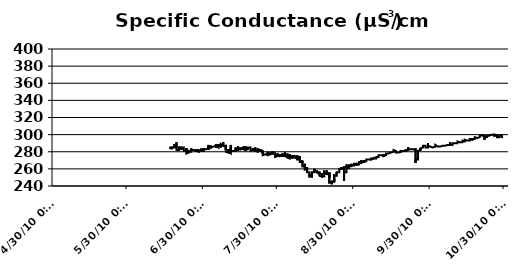
| Category | µS/cm |
|---|---|
| 6/16/10 | 285 |
| 6/16/10 | 285 |
| 6/16/10 | 285 |
| 6/16/10 | 285 |
| 6/16/10 | 286 |
| 6/16/10 | 285 |
| 6/16/10 | 286 |
| 6/16/10 | 286 |
| 6/16/10 | 284 |
| 6/16/10 | 285 |
| 6/16/10 | 285 |
| 6/16/10 | 284 |
| 6/16/10 | 284 |
| 6/16/10 | 284 |
| 6/16/10 | 284 |
| 6/16/10 | 284 |
| 6/16/10 | 285 |
| 6/16/10 | 284 |
| 6/16/10 | 284 |
| 6/16/10 | 284 |
| 6/16/10 | 284 |
| 6/16/10 | 284 |
| 6/16/10 | 284 |
| 6/16/10 | 284 |
| 6/17/10 | 284 |
| 6/17/10 | 284 |
| 6/17/10 | 284 |
| 6/17/10 | 284 |
| 6/17/10 | 284 |
| 6/17/10 | 284 |
| 6/17/10 | 284 |
| 6/17/10 | 284 |
| 6/17/10 | 284 |
| 6/17/10 | 284 |
| 6/17/10 | 284 |
| 6/17/10 | 285 |
| 6/17/10 | 285 |
| 6/17/10 | 285 |
| 6/17/10 | 285 |
| 6/17/10 | 285 |
| 6/17/10 | 285 |
| 6/17/10 | 285 |
| 6/17/10 | 285 |
| 6/17/10 | 285 |
| 6/17/10 | 285 |
| 6/17/10 | 285 |
| 6/17/10 | 285 |
| 6/17/10 | 285 |
| 6/17/10 | 285 |
| 6/17/10 | 286 |
| 6/17/10 | 285 |
| 6/17/10 | 286 |
| 6/17/10 | 286 |
| 6/17/10 | 286 |
| 6/17/10 | 286 |
| 6/17/10 | 286 |
| 6/17/10 | 286 |
| 6/17/10 | 286 |
| 6/17/10 | 285 |
| 6/17/10 | 286 |
| 6/17/10 | 286 |
| 6/17/10 | 287 |
| 6/17/10 | 287 |
| 6/17/10 | 286 |
| 6/17/10 | 285 |
| 6/17/10 | 284 |
| 6/17/10 | 284 |
| 6/17/10 | 284 |
| 6/17/10 | 284 |
| 6/17/10 | 285 |
| 6/17/10 | 285 |
| 6/17/10 | 285 |
| 6/18/10 | 285 |
| 6/18/10 | 285 |
| 6/18/10 | 285 |
| 6/18/10 | 285 |
| 6/18/10 | 286 |
| 6/18/10 | 286 |
| 6/18/10 | 286 |
| 6/18/10 | 286 |
| 6/18/10 | 286 |
| 6/18/10 | 286 |
| 6/18/10 | 287 |
| 6/18/10 | 287 |
| 6/18/10 | 287 |
| 6/18/10 | 287 |
| 6/18/10 | 287 |
| 6/18/10 | 287 |
| 6/18/10 | 287 |
| 6/18/10 | 287 |
| 6/18/10 | 287 |
| 6/18/10 | 287 |
| 6/18/10 | 288 |
| 6/18/10 | 287 |
| 6/18/10 | 288 |
| 6/18/10 | 288 |
| 6/18/10 | 288 |
| 6/18/10 | 288 |
| 6/18/10 | 289 |
| 6/18/10 | 289 |
| 6/18/10 | 289 |
| 6/18/10 | 289 |
| 6/18/10 | 289 |
| 6/18/10 | 287 |
| 6/18/10 | 287 |
| 6/18/10 | 289 |
| 6/18/10 | 290 |
| 6/18/10 | 290 |
| 6/18/10 | 290 |
| 6/18/10 | 289 |
| 6/18/10 | 290 |
| 6/18/10 | 290 |
| 6/18/10 | 289 |
| 6/18/10 | 287 |
| 6/18/10 | 287 |
| 6/18/10 | 287 |
| 6/18/10 | 288 |
| 6/18/10 | 287 |
| 6/18/10 | 287 |
| 6/18/10 | 287 |
| 6/19/10 | 287 |
| 6/19/10 | 287 |
| 6/19/10 | 287 |
| 6/19/10 | 287 |
| 6/19/10 | 287 |
| 6/19/10 | 287 |
| 6/19/10 | 287 |
| 6/19/10 | 288 |
| 6/19/10 | 287 |
| 6/19/10 | 288 |
| 6/19/10 | 288 |
| 6/19/10 | 288 |
| 6/19/10 | 288 |
| 6/19/10 | 288 |
| 6/19/10 | 288 |
| 6/19/10 | 287 |
| 6/19/10 | 287 |
| 6/19/10 | 287 |
| 6/19/10 | 288 |
| 6/19/10 | 288 |
| 6/19/10 | 287 |
| 6/19/10 | 288 |
| 6/19/10 | 287 |
| 6/19/10 | 287 |
| 6/19/10 | 286 |
| 6/19/10 | 287 |
| 6/19/10 | 287 |
| 6/19/10 | 287 |
| 6/19/10 | 287 |
| 6/19/10 | 287 |
| 6/19/10 | 288 |
| 6/19/10 | 288 |
| 6/19/10 | 288 |
| 6/19/10 | 288 |
| 6/19/10 | 289 |
| 6/19/10 | 288 |
| 6/19/10 | 289 |
| 6/19/10 | 291 |
| 6/19/10 | 288 |
| 6/19/10 | 284 |
| 6/19/10 | 286 |
| 6/19/10 | 284 |
| 6/19/10 | 283 |
| 6/19/10 | 283 |
| 6/19/10 | 283 |
| 6/19/10 | 283 |
| 6/19/10 | 282 |
| 6/19/10 | 281 |
| 6/20/10 | 282 |
| 6/20/10 | 282 |
| 6/20/10 | 282 |
| 6/20/10 | 282 |
| 6/20/10 | 282 |
| 6/20/10 | 282 |
| 6/20/10 | 282 |
| 6/20/10 | 283 |
| 6/20/10 | 283 |
| 6/20/10 | 283 |
| 6/20/10 | 283 |
| 6/20/10 | 284 |
| 6/20/10 | 284 |
| 6/20/10 | 284 |
| 6/20/10 | 284 |
| 6/20/10 | 284 |
| 6/20/10 | 284 |
| 6/20/10 | 285 |
| 6/20/10 | 285 |
| 6/20/10 | 285 |
| 6/20/10 | 285 |
| 6/20/10 | 284 |
| 6/20/10 | 285 |
| 6/20/10 | 285 |
| 6/20/10 | 284 |
| 6/20/10 | 284 |
| 6/20/10 | 285 |
| 6/20/10 | 285 |
| 6/20/10 | 285 |
| 6/20/10 | 286 |
| 6/20/10 | 286 |
| 6/20/10 | 286 |
| 6/20/10 | 286 |
| 6/20/10 | 286 |
| 6/20/10 | 285 |
| 6/20/10 | 286 |
| 6/20/10 | 286 |
| 6/20/10 | 286 |
| 6/20/10 | 284 |
| 6/20/10 | 285 |
| 6/20/10 | 284 |
| 6/20/10 | 285 |
| 6/20/10 | 285 |
| 6/20/10 | 284 |
| 6/20/10 | 284 |
| 6/20/10 | 284 |
| 6/20/10 | 283 |
| 6/20/10 | 284 |
| 6/21/10 | 284 |
| 6/21/10 | 284 |
| 6/21/10 | 284 |
| 6/21/10 | 284 |
| 6/21/10 | 284 |
| 6/21/10 | 284 |
| 6/21/10 | 284 |
| 6/21/10 | 284 |
| 6/21/10 | 284 |
| 6/21/10 | 284 |
| 6/21/10 | 284 |
| 6/21/10 | 284 |
| 6/21/10 | 284 |
| 6/21/10 | 284 |
| 6/21/10 | 284 |
| 6/21/10 | 282 |
| 6/21/10 | 284 |
| 6/21/10 | 284 |
| 6/21/10 | 285 |
| 6/21/10 | 285 |
| 6/21/10 | 284 |
| 6/21/10 | 284 |
| 6/21/10 | 285 |
| 6/21/10 | 285 |
| 6/21/10 | 285 |
| 6/21/10 | 285 |
| 6/21/10 | 285 |
| 6/21/10 | 285 |
| 6/21/10 | 285 |
| 6/21/10 | 285 |
| 6/21/10 | 285 |
| 6/21/10 | 286 |
| 6/21/10 | 286 |
| 6/21/10 | 286 |
| 6/21/10 | 286 |
| 6/21/10 | 286 |
| 6/21/10 | 286 |
| 6/21/10 | 287 |
| 6/21/10 | 286 |
| 6/21/10 | 286 |
| 6/21/10 | 285 |
| 6/21/10 | 284 |
| 6/21/10 | 284 |
| 6/21/10 | 284 |
| 6/21/10 | 284 |
| 6/21/10 | 284 |
| 6/21/10 | 284 |
| 6/21/10 | 284 |
| 6/22/10 | 285 |
| 6/22/10 | 285 |
| 6/22/10 | 285 |
| 6/22/10 | 285 |
| 6/22/10 | 284 |
| 6/22/10 | 284 |
| 6/22/10 | 284 |
| 6/22/10 | 284 |
| 6/22/10 | 284 |
| 6/22/10 | 284 |
| 6/22/10 | 284 |
| 6/22/10 | 284 |
| 6/22/10 | 284 |
| 6/22/10 | 284 |
| 6/22/10 | 284 |
| 6/22/10 | 284 |
| 6/22/10 | 284 |
| 6/22/10 | 283 |
| 6/22/10 | 283 |
| 6/22/10 | 283 |
| 6/22/10 | 283 |
| 6/22/10 | 283 |
| 6/22/10 | 283 |
| 6/22/10 | 283 |
| 6/22/10 | 283 |
| 6/22/10 | 283 |
| 6/22/10 | 283 |
| 6/22/10 | 283 |
| 6/22/10 | 283 |
| 6/22/10 | 283 |
| 6/22/10 | 284 |
| 6/22/10 | 284 |
| 6/22/10 | 283 |
| 6/22/10 | 283 |
| 6/22/10 | 284 |
| 6/22/10 | 283 |
| 6/22/10 | 284 |
| 6/22/10 | 282 |
| 6/22/10 | 282 |
| 6/22/10 | 281 |
| 6/22/10 | 282 |
| 6/22/10 | 282 |
| 6/22/10 | 282 |
| 6/22/10 | 282 |
| 6/22/10 | 282 |
| 6/22/10 | 282 |
| 6/22/10 | 282 |
| 6/22/10 | 282 |
| 6/23/10 | 282 |
| 6/23/10 | 282 |
| 6/23/10 | 282 |
| 6/23/10 | 282 |
| 6/23/10 | 282 |
| 6/23/10 | 282 |
| 6/23/10 | 282 |
| 6/23/10 | 282 |
| 6/23/10 | 282 |
| 6/23/10 | 282 |
| 6/23/10 | 282 |
| 6/23/10 | 282 |
| 6/23/10 | 282 |
| 6/23/10 | 283 |
| 6/23/10 | 283 |
| 6/23/10 | 283 |
| 6/23/10 | 283 |
| 6/23/10 | 283 |
| 6/23/10 | 284 |
| 6/23/10 | 283 |
| 6/23/10 | 283 |
| 6/23/10 | 283 |
| 6/23/10 | 283 |
| 6/23/10 | 283 |
| 6/23/10 | 283 |
| 6/23/10 | 283 |
| 6/23/10 | 283 |
| 6/23/10 | 283 |
| 6/23/10 | 281 |
| 6/23/10 | 280 |
| 6/23/10 | 282 |
| 6/23/10 | 282 |
| 6/23/10 | 282 |
| 6/23/10 | 284 |
| 6/23/10 | 284 |
| 6/23/10 | 284 |
| 6/23/10 | 285 |
| 6/23/10 | 280 |
| 6/23/10 | 280 |
| 6/23/10 | 280 |
| 6/23/10 | 279 |
| 6/23/10 | 278 |
| 6/23/10 | 278 |
| 6/23/10 | 279 |
| 6/23/10 | 279 |
| 6/23/10 | 279 |
| 6/23/10 | 279 |
| 6/23/10 | 279 |
| 6/24/10 | 279 |
| 6/24/10 | 279 |
| 6/24/10 | 279 |
| 6/24/10 | 279 |
| 6/24/10 | 279 |
| 6/24/10 | 279 |
| 6/24/10 | 279 |
| 6/24/10 | 279 |
| 6/24/10 | 279 |
| 6/24/10 | 279 |
| 6/24/10 | 279 |
| 6/24/10 | 279 |
| 6/24/10 | 280 |
| 6/24/10 | 280 |
| 6/24/10 | 280 |
| 6/24/10 | 280 |
| 6/24/10 | 280 |
| 6/24/10 | 281 |
| 6/24/10 | 281 |
| 6/24/10 | 280 |
| 6/24/10 | 280 |
| 6/24/10 | 279 |
| 6/24/10 | 280 |
| 6/24/10 | 280 |
| 6/24/10 | 280 |
| 6/24/10 | 280 |
| 6/24/10 | 280 |
| 6/24/10 | 280 |
| 6/24/10 | 281 |
| 6/24/10 | 281 |
| 6/24/10 | 280 |
| 6/24/10 | 280 |
| 6/24/10 | 280 |
| 6/24/10 | 281 |
| 6/24/10 | 281 |
| 6/24/10 | 281 |
| 6/24/10 | 282 |
| 6/24/10 | 281 |
| 6/24/10 | 281 |
| 6/24/10 | 281 |
| 6/24/10 | 281 |
| 6/24/10 | 280 |
| 6/24/10 | 280 |
| 6/24/10 | 280 |
| 6/24/10 | 280 |
| 6/24/10 | 280 |
| 6/24/10 | 280 |
| 6/24/10 | 280 |
| 6/25/10 | 280 |
| 6/25/10 | 280 |
| 6/25/10 | 280 |
| 6/25/10 | 281 |
| 6/25/10 | 281 |
| 6/25/10 | 281 |
| 6/25/10 | 281 |
| 6/25/10 | 281 |
| 6/25/10 | 281 |
| 6/25/10 | 281 |
| 6/25/10 | 281 |
| 6/25/10 | 282 |
| 6/25/10 | 282 |
| 6/25/10 | 282 |
| 6/25/10 | 282 |
| 6/25/10 | 282 |
| 6/25/10 | 282 |
| 6/25/10 | 282 |
| 6/25/10 | 282 |
| 6/25/10 | 283 |
| 6/25/10 | 283 |
| 6/25/10 | 282 |
| 6/25/10 | 283 |
| 6/25/10 | 284 |
| 6/25/10 | 283 |
| 6/25/10 | 284 |
| 6/25/10 | 283 |
| 6/25/10 | 284 |
| 6/25/10 | 284 |
| 6/25/10 | 283 |
| 6/25/10 | 283 |
| 6/25/10 | 284 |
| 6/25/10 | 284 |
| 6/25/10 | 284 |
| 6/25/10 | 283 |
| 6/25/10 | 282 |
| 6/25/10 | 283 |
| 6/25/10 | 283 |
| 6/25/10 | 282 |
| 6/25/10 | 283 |
| 6/25/10 | 283 |
| 6/25/10 | 283 |
| 6/25/10 | 283 |
| 6/25/10 | 282 |
| 6/25/10 | 281 |
| 6/25/10 | 281 |
| 6/25/10 | 281 |
| 6/25/10 | 282 |
| 6/26/10 | 282 |
| 6/26/10 | 281 |
| 6/26/10 | 281 |
| 6/26/10 | 281 |
| 6/26/10 | 281 |
| 6/26/10 | 281 |
| 6/26/10 | 281 |
| 6/26/10 | 281 |
| 6/26/10 | 281 |
| 6/26/10 | 281 |
| 6/26/10 | 281 |
| 6/26/10 | 281 |
| 6/26/10 | 281 |
| 6/26/10 | 281 |
| 6/26/10 | 281 |
| 6/26/10 | 281 |
| 6/26/10 | 281 |
| 6/26/10 | 281 |
| 6/26/10 | 282 |
| 6/26/10 | 282 |
| 6/26/10 | 281 |
| 6/26/10 | 281 |
| 6/26/10 | 281 |
| 6/26/10 | 282 |
| 6/26/10 | 283 |
| 6/26/10 | 282 |
| 6/26/10 | 282 |
| 6/26/10 | 281 |
| 6/26/10 | 282 |
| 6/26/10 | 281 |
| 6/26/10 | 282 |
| 6/26/10 | 282 |
| 6/26/10 | 283 |
| 6/26/10 | 283 |
| 6/26/10 | 283 |
| 6/26/10 | 282 |
| 6/26/10 | 282 |
| 6/26/10 | 281 |
| 6/26/10 | 281 |
| 6/26/10 | 282 |
| 6/26/10 | 282 |
| 6/26/10 | 282 |
| 6/26/10 | 282 |
| 6/26/10 | 282 |
| 6/26/10 | 281 |
| 6/26/10 | 281 |
| 6/26/10 | 281 |
| 6/26/10 | 281 |
| 6/27/10 | 281 |
| 6/27/10 | 281 |
| 6/27/10 | 281 |
| 6/27/10 | 281 |
| 6/27/10 | 281 |
| 6/27/10 | 281 |
| 6/27/10 | 281 |
| 6/27/10 | 281 |
| 6/27/10 | 281 |
| 6/27/10 | 281 |
| 6/27/10 | 281 |
| 6/27/10 | 281 |
| 6/27/10 | 281 |
| 6/27/10 | 281 |
| 6/27/10 | 281 |
| 6/27/10 | 281 |
| 6/27/10 | 281 |
| 6/27/10 | 282 |
| 6/27/10 | 281 |
| 6/27/10 | 281 |
| 6/27/10 | 281 |
| 6/27/10 | 281 |
| 6/27/10 | 282 |
| 6/27/10 | 282 |
| 6/27/10 | 281 |
| 6/27/10 | 281 |
| 6/27/10 | 281 |
| 6/27/10 | 280 |
| 6/27/10 | 281 |
| 6/27/10 | 281 |
| 6/27/10 | 283 |
| 6/27/10 | 282 |
| 6/27/10 | 281 |
| 6/27/10 | 281 |
| 6/27/10 | 282 |
| 6/27/10 | 282 |
| 6/27/10 | 282 |
| 6/27/10 | 283 |
| 6/27/10 | 281 |
| 6/27/10 | 280 |
| 6/27/10 | 280 |
| 6/27/10 | 280 |
| 6/27/10 | 280 |
| 6/27/10 | 281 |
| 6/27/10 | 281 |
| 6/27/10 | 281 |
| 6/27/10 | 280 |
| 6/27/10 | 280 |
| 6/28/10 | 280 |
| 6/28/10 | 280 |
| 6/28/10 | 281 |
| 6/28/10 | 280 |
| 6/28/10 | 280 |
| 6/28/10 | 281 |
| 6/28/10 | 280 |
| 6/28/10 | 281 |
| 6/28/10 | 281 |
| 6/28/10 | 281 |
| 6/28/10 | 281 |
| 6/28/10 | 281 |
| 6/28/10 | 281 |
| 6/28/10 | 281 |
| 6/28/10 | 281 |
| 6/28/10 | 281 |
| 6/28/10 | 281 |
| 6/28/10 | 281 |
| 6/28/10 | 281 |
| 6/28/10 | 281 |
| 6/28/10 | 281 |
| 6/28/10 | 281 |
| 6/28/10 | 282 |
| 6/28/10 | 282 |
| 6/28/10 | 282 |
| 6/28/10 | 282 |
| 6/28/10 | 282 |
| 6/28/10 | 282 |
| 6/28/10 | 282 |
| 6/28/10 | 282 |
| 6/28/10 | 282 |
| 6/28/10 | 282 |
| 6/28/10 | 282 |
| 6/28/10 | 282 |
| 6/28/10 | 281 |
| 6/28/10 | 281 |
| 6/28/10 | 281 |
| 6/28/10 | 282 |
| 6/28/10 | 281 |
| 6/28/10 | 281 |
| 6/28/10 | 281 |
| 6/28/10 | 281 |
| 6/28/10 | 281 |
| 6/28/10 | 281 |
| 6/28/10 | 281 |
| 6/28/10 | 281 |
| 6/28/10 | 281 |
| 6/28/10 | 281 |
| 6/29/10 | 281 |
| 6/29/10 | 281 |
| 6/29/10 | 282 |
| 6/29/10 | 282 |
| 6/29/10 | 281 |
| 6/29/10 | 282 |
| 6/29/10 | 282 |
| 6/29/10 | 282 |
| 6/29/10 | 282 |
| 6/29/10 | 283 |
| 6/29/10 | 282 |
| 6/29/10 | 283 |
| 6/29/10 | 281 |
| 6/29/10 | 283 |
| 6/29/10 | 283 |
| 6/29/10 | 283 |
| 6/29/10 | 283 |
| 6/29/10 | 283 |
| 6/29/10 | 283 |
| 6/29/10 | 283 |
| 6/29/10 | 282 |
| 6/29/10 | 282 |
| 6/29/10 | 282 |
| 6/29/10 | 282 |
| 6/29/10 | 282 |
| 6/29/10 | 283 |
| 6/29/10 | 283 |
| 6/29/10 | 283 |
| 6/29/10 | 283 |
| 6/29/10 | 281 |
| 6/29/10 | 283 |
| 6/29/10 | 283 |
| 6/29/10 | 284 |
| 6/29/10 | 284 |
| 6/29/10 | 284 |
| 6/29/10 | 283 |
| 6/29/10 | 283 |
| 6/29/10 | 283 |
| 6/29/10 | 282 |
| 6/29/10 | 282 |
| 6/29/10 | 282 |
| 6/29/10 | 282 |
| 6/29/10 | 282 |
| 6/29/10 | 282 |
| 6/29/10 | 282 |
| 6/29/10 | 282 |
| 6/29/10 | 283 |
| 6/29/10 | 283 |
| 6/30/10 | 283 |
| 6/30/10 | 283 |
| 6/30/10 | 283 |
| 6/30/10 | 283 |
| 6/30/10 | 283 |
| 6/30/10 | 283 |
| 6/30/10 | 283 |
| 6/30/10 | 283 |
| 6/30/10 | 282 |
| 6/30/10 | 282 |
| 6/30/10 | 282 |
| 6/30/10 | 283 |
| 6/30/10 | 283 |
| 6/30/10 | 280 |
| 6/30/10 | 282 |
| 6/30/10 | 283 |
| 6/30/10 | 283 |
| 6/30/10 | 282 |
| 6/30/10 | 283 |
| 6/30/10 | 283 |
| 6/30/10 | 283 |
| 6/30/10 | 283 |
| 6/30/10 | 283 |
| 6/30/10 | 282 |
| 6/30/10 | 282 |
| 6/30/10 | 283 |
| 6/30/10 | 282 |
| 6/30/10 | 283 |
| 6/30/10 | 283 |
| 6/30/10 | 283 |
| 6/30/10 | 283 |
| 6/30/10 | 284 |
| 6/30/10 | 283 |
| 6/30/10 | 281 |
| 6/30/10 | 283 |
| 6/30/10 | 283 |
| 6/30/10 | 283 |
| 6/30/10 | 282 |
| 6/30/10 | 283 |
| 6/30/10 | 283 |
| 6/30/10 | 283 |
| 6/30/10 | 283 |
| 6/30/10 | 283 |
| 6/30/10 | 283 |
| 6/30/10 | 282 |
| 6/30/10 | 283 |
| 6/30/10 | 283 |
| 6/30/10 | 283 |
| 7/1/10 | 283 |
| 7/1/10 | 283 |
| 7/1/10 | 283 |
| 7/1/10 | 283 |
| 7/1/10 | 283 |
| 7/1/10 | 283 |
| 7/1/10 | 283 |
| 7/1/10 | 283 |
| 7/1/10 | 283 |
| 7/1/10 | 283 |
| 7/1/10 | 283 |
| 7/1/10 | 283 |
| 7/1/10 | 283 |
| 7/1/10 | 283 |
| 7/1/10 | 283 |
| 7/1/10 | 283 |
| 7/1/10 | 283 |
| 7/1/10 | 283 |
| 7/1/10 | 283 |
| 7/1/10 | 284 |
| 7/1/10 | 284 |
| 7/1/10 | 284 |
| 7/1/10 | 283 |
| 7/1/10 | 283 |
| 7/1/10 | 283 |
| 7/1/10 | 284 |
| 7/1/10 | 282 |
| 7/1/10 | 282 |
| 7/1/10 | 284 |
| 7/1/10 | 284 |
| 7/1/10 | 284 |
| 7/1/10 | 284 |
| 7/1/10 | 284 |
| 7/1/10 | 284 |
| 7/1/10 | 284 |
| 7/1/10 | 284 |
| 7/1/10 | 284 |
| 7/1/10 | 284 |
| 7/1/10 | 284 |
| 7/1/10 | 284 |
| 7/1/10 | 284 |
| 7/1/10 | 284 |
| 7/1/10 | 284 |
| 7/1/10 | 284 |
| 7/1/10 | 284 |
| 7/1/10 | 284 |
| 7/1/10 | 284 |
| 7/1/10 | 284 |
| 7/2/10 | 284 |
| 7/2/10 | 284 |
| 7/2/10 | 284 |
| 7/2/10 | 284 |
| 7/2/10 | 284 |
| 7/2/10 | 284 |
| 7/2/10 | 284 |
| 7/2/10 | 284 |
| 7/2/10 | 284 |
| 7/2/10 | 284 |
| 7/2/10 | 284 |
| 7/2/10 | 284 |
| 7/2/10 | 284 |
| 7/2/10 | 284 |
| 7/2/10 | 284 |
| 7/2/10 | 284 |
| 7/2/10 | 284 |
| 7/2/10 | 284 |
| 7/2/10 | 284 |
| 7/2/10 | 282 |
| 7/2/10 | 282 |
| 7/2/10 | 283 |
| 7/2/10 | 283 |
| 7/2/10 | 285 |
| 7/2/10 | 285 |
| 7/2/10 | 285 |
| 7/2/10 | 286 |
| 7/2/10 | 286 |
| 7/2/10 | 283 |
| 7/2/10 | 286 |
| 7/2/10 | 284 |
| 7/2/10 | 286 |
| 7/2/10 | 287 |
| 7/2/10 | 287 |
| 7/2/10 | 288 |
| 7/2/10 | 287 |
| 7/2/10 | 287 |
| 7/2/10 | 287 |
| 7/2/10 | 284 |
| 7/2/10 | 284 |
| 7/2/10 | 284 |
| 7/2/10 | 284 |
| 7/2/10 | 284 |
| 7/2/10 | 285 |
| 7/2/10 | 284 |
| 7/2/10 | 284 |
| 7/2/10 | 285 |
| 7/2/10 | 285 |
| 7/3/10 | 285 |
| 7/3/10 | 285 |
| 7/3/10 | 285 |
| 7/3/10 | 285 |
| 7/3/10 | 285 |
| 7/3/10 | 285 |
| 7/3/10 | 285 |
| 7/3/10 | 284 |
| 7/3/10 | 284 |
| 7/3/10 | 284 |
| 7/3/10 | 284 |
| 7/3/10 | 284 |
| 7/3/10 | 284 |
| 7/3/10 | 284 |
| 7/3/10 | 284 |
| 7/3/10 | 284 |
| 7/3/10 | 284 |
| 7/3/10 | 284 |
| 7/3/10 | 285 |
| 7/3/10 | 284 |
| 7/3/10 | 284 |
| 7/3/10 | 285 |
| 7/3/10 | 285 |
| 7/3/10 | 285 |
| 7/3/10 | 285 |
| 7/3/10 | 285 |
| 7/3/10 | 285 |
| 7/3/10 | 286 |
| 7/3/10 | 286 |
| 7/3/10 | 286 |
| 7/3/10 | 286 |
| 7/3/10 | 287 |
| 7/3/10 | 286 |
| 7/3/10 | 287 |
| 7/3/10 | 285 |
| 7/3/10 | 287 |
| 7/3/10 | 285 |
| 7/3/10 | 284 |
| 7/3/10 | 285 |
| 7/3/10 | 286 |
| 7/3/10 | 285 |
| 7/3/10 | 286 |
| 7/3/10 | 286 |
| 7/3/10 | 286 |
| 7/3/10 | 286 |
| 7/3/10 | 285 |
| 7/3/10 | 286 |
| 7/3/10 | 286 |
| 7/4/10 | 286 |
| 7/4/10 | 285 |
| 7/4/10 | 285 |
| 7/4/10 | 285 |
| 7/4/10 | 285 |
| 7/4/10 | 285 |
| 7/4/10 | 285 |
| 7/4/10 | 285 |
| 7/4/10 | 285 |
| 7/4/10 | 285 |
| 7/4/10 | 285 |
| 7/4/10 | 285 |
| 7/4/10 | 285 |
| 7/4/10 | 285 |
| 7/4/10 | 285 |
| 7/4/10 | 285 |
| 7/4/10 | 285 |
| 7/4/10 | 285 |
| 7/4/10 | 285 |
| 7/4/10 | 285 |
| 7/4/10 | 285 |
| 7/4/10 | 285 |
| 7/4/10 | 285 |
| 7/4/10 | 286 |
| 7/4/10 | 286 |
| 7/4/10 | 286 |
| 7/4/10 | 286 |
| 7/4/10 | 285 |
| 7/4/10 | 285 |
| 7/4/10 | 285 |
| 7/4/10 | 285 |
| 7/4/10 | 286 |
| 7/4/10 | 286 |
| 7/4/10 | 287 |
| 7/4/10 | 287 |
| 7/4/10 | 287 |
| 7/4/10 | 286 |
| 7/4/10 | 286 |
| 7/4/10 | 286 |
| 7/4/10 | 286 |
| 7/4/10 | 286 |
| 7/4/10 | 287 |
| 7/4/10 | 287 |
| 7/4/10 | 286 |
| 7/4/10 | 286 |
| 7/4/10 | 286 |
| 7/4/10 | 286 |
| 7/4/10 | 287 |
| 7/5/10 | 287 |
| 7/5/10 | 286 |
| 7/5/10 | 286 |
| 7/5/10 | 286 |
| 7/5/10 | 286 |
| 7/5/10 | 285 |
| 7/5/10 | 285 |
| 7/5/10 | 285 |
| 7/5/10 | 285 |
| 7/5/10 | 285 |
| 7/5/10 | 285 |
| 7/5/10 | 285 |
| 7/5/10 | 285 |
| 7/5/10 | 285 |
| 7/5/10 | 285 |
| 7/5/10 | 285 |
| 7/5/10 | 285 |
| 7/5/10 | 286 |
| 7/5/10 | 285 |
| 7/5/10 | 285 |
| 7/5/10 | 286 |
| 7/5/10 | 286 |
| 7/5/10 | 286 |
| 7/5/10 | 286 |
| 7/5/10 | 286 |
| 7/5/10 | 287 |
| 7/5/10 | 287 |
| 7/5/10 | 286 |
| 7/5/10 | 287 |
| 7/5/10 | 287 |
| 7/5/10 | 288 |
| 7/5/10 | 288 |
| 7/5/10 | 288 |
| 7/5/10 | 288 |
| 7/5/10 | 288 |
| 7/5/10 | 288 |
| 7/5/10 | 288 |
| 7/5/10 | 288 |
| 7/5/10 | 288 |
| 7/5/10 | 288 |
| 7/5/10 | 288 |
| 7/5/10 | 289 |
| 7/5/10 | 288 |
| 7/5/10 | 288 |
| 7/5/10 | 287 |
| 7/5/10 | 287 |
| 7/5/10 | 286 |
| 7/5/10 | 286 |
| 7/6/10 | 285 |
| 7/6/10 | 287 |
| 7/6/10 | 286 |
| 7/6/10 | 287 |
| 7/6/10 | 287 |
| 7/6/10 | 287 |
| 7/6/10 | 287 |
| 7/6/10 | 287 |
| 7/6/10 | 286 |
| 7/6/10 | 286 |
| 7/6/10 | 286 |
| 7/6/10 | 286 |
| 7/6/10 | 286 |
| 7/6/10 | 286 |
| 7/6/10 | 286 |
| 7/6/10 | 286 |
| 7/6/10 | 286 |
| 7/6/10 | 286 |
| 7/6/10 | 287 |
| 7/6/10 | 286 |
| 7/6/10 | 286 |
| 7/6/10 | 286 |
| 7/6/10 | 286 |
| 7/6/10 | 287 |
| 7/6/10 | 287 |
| 7/6/10 | 287 |
| 7/6/10 | 287 |
| 7/6/10 | 287 |
| 7/6/10 | 288 |
| 7/6/10 | 288 |
| 7/6/10 | 288 |
| 7/6/10 | 288 |
| 7/6/10 | 289 |
| 7/6/10 | 288 |
| 7/6/10 | 289 |
| 7/6/10 | 289 |
| 7/6/10 | 289 |
| 7/6/10 | 289 |
| 7/6/10 | 288 |
| 7/6/10 | 288 |
| 7/6/10 | 288 |
| 7/6/10 | 288 |
| 7/6/10 | 287 |
| 7/6/10 | 287 |
| 7/6/10 | 288 |
| 7/6/10 | 288 |
| 7/6/10 | 288 |
| 7/6/10 | 287 |
| 7/7/10 | 287 |
| 7/7/10 | 287 |
| 7/7/10 | 287 |
| 7/7/10 | 287 |
| 7/7/10 | 286 |
| 7/7/10 | 288 |
| 7/7/10 | 287 |
| 7/7/10 | 287 |
| 7/7/10 | 286 |
| 7/7/10 | 286 |
| 7/7/10 | 286 |
| 7/7/10 | 286 |
| 7/7/10 | 286 |
| 7/7/10 | 286 |
| 7/7/10 | 286 |
| 7/7/10 | 286 |
| 7/7/10 | 286 |
| 7/7/10 | 286 |
| 7/7/10 | 285 |
| 7/7/10 | 286 |
| 7/7/10 | 287 |
| 7/7/10 | 286 |
| 7/7/10 | 287 |
| 7/7/10 | 287 |
| 7/7/10 | 288 |
| 7/7/10 | 287 |
| 7/7/10 | 287 |
| 7/7/10 | 288 |
| 7/7/10 | 287 |
| 7/7/10 | 288 |
| 7/7/10 | 287 |
| 7/7/10 | 288 |
| 7/7/10 | 288 |
| 7/7/10 | 289 |
| 7/7/10 | 288 |
| 7/7/10 | 288 |
| 7/7/10 | 288 |
| 7/7/10 | 289 |
| 7/7/10 | 288 |
| 7/7/10 | 289 |
| 7/7/10 | 288 |
| 7/7/10 | 288 |
| 7/7/10 | 288 |
| 7/7/10 | 288 |
| 7/7/10 | 288 |
| 7/7/10 | 288 |
| 7/7/10 | 288 |
| 7/7/10 | 288 |
| 7/8/10 | 287 |
| 7/8/10 | 286 |
| 7/8/10 | 286 |
| 7/8/10 | 286 |
| 7/8/10 | 286 |
| 7/8/10 | 286 |
| 7/8/10 | 286 |
| 7/8/10 | 286 |
| 7/8/10 | 286 |
| 7/8/10 | 286 |
| 7/8/10 | 286 |
| 7/8/10 | 286 |
| 7/8/10 | 286 |
| 7/8/10 | 286 |
| 7/8/10 | 287 |
| 7/8/10 | 286 |
| 7/8/10 | 286 |
| 7/8/10 | 286 |
| 7/8/10 | 287 |
| 7/8/10 | 286 |
| 7/8/10 | 287 |
| 7/8/10 | 287 |
| 7/8/10 | 288 |
| 7/8/10 | 287 |
| 7/8/10 | 287 |
| 7/8/10 | 288 |
| 7/8/10 | 288 |
| 7/8/10 | 288 |
| 7/8/10 | 288 |
| 7/8/10 | 288 |
| 7/8/10 | 289 |
| 7/8/10 | 289 |
| 7/8/10 | 289 |
| 7/8/10 | 290 |
| 7/8/10 | 290 |
| 7/8/10 | 290 |
| 7/8/10 | 290 |
| 7/8/10 | 290 |
| 7/8/10 | 290 |
| 7/8/10 | 290 |
| 7/8/10 | 291 |
| 7/8/10 | 290 |
| 7/8/10 | 290 |
| 7/8/10 | 290 |
| 7/8/10 | 289 |
| 7/8/10 | 287 |
| 7/8/10 | 287 |
| 7/8/10 | 287 |
| 7/9/10 | 287 |
| 7/9/10 | 287 |
| 7/9/10 | 287 |
| 7/9/10 | 287 |
| 7/9/10 | 287 |
| 7/9/10 | 287 |
| 7/9/10 | 287 |
| 7/9/10 | 286 |
| 7/9/10 | 286 |
| 7/9/10 | 286 |
| 7/9/10 | 286 |
| 7/9/10 | 286 |
| 7/9/10 | 286 |
| 7/9/10 | 286 |
| 7/9/10 | 282 |
| 7/9/10 | 286 |
| 7/9/10 | 286 |
| 7/9/10 | 286 |
| 7/9/10 | 287 |
| 7/9/10 | 287 |
| 7/9/10 | 287 |
| 7/9/10 | 288 |
| 7/9/10 | 288 |
| 7/9/10 | 288 |
| 7/9/10 | 288 |
| 7/9/10 | 288 |
| 7/9/10 | 288 |
| 7/9/10 | 288 |
| 7/9/10 | 288 |
| 7/9/10 | 286 |
| 7/9/10 | 286 |
| 7/9/10 | 286 |
| 7/9/10 | 283 |
| 7/9/10 | 280 |
| 7/9/10 | 281 |
| 7/9/10 | 281 |
| 7/9/10 | 280 |
| 7/9/10 | 279 |
| 7/9/10 | 280 |
| 7/9/10 | 280 |
| 7/9/10 | 279 |
| 7/9/10 | 279 |
| 7/9/10 | 279 |
| 7/9/10 | 279 |
| 7/9/10 | 279 |
| 7/9/10 | 279 |
| 7/9/10 | 279 |
| 7/9/10 | 279 |
| 7/10/10 | 279 |
| 7/10/10 | 279 |
| 7/10/10 | 279 |
| 7/10/10 | 279 |
| 7/10/10 | 279 |
| 7/10/10 | 280 |
| 7/10/10 | 280 |
| 7/10/10 | 280 |
| 7/10/10 | 280 |
| 7/10/10 | 280 |
| 7/10/10 | 280 |
| 7/10/10 | 279 |
| 7/10/10 | 281 |
| 7/10/10 | 281 |
| 7/10/10 | 281 |
| 7/10/10 | 281 |
| 7/10/10 | 281 |
| 7/10/10 | 281 |
| 7/10/10 | 281 |
| 7/10/10 | 281 |
| 7/10/10 | 281 |
| 7/10/10 | 282 |
| 7/10/10 | 282 |
| 7/10/10 | 282 |
| 7/10/10 | 282 |
| 7/10/10 | 282 |
| 7/10/10 | 282 |
| 7/10/10 | 282 |
| 7/10/10 | 282 |
| 7/10/10 | 282 |
| 7/10/10 | 279 |
| 7/10/10 | 283 |
| 7/10/10 | 280 |
| 7/10/10 | 282 |
| 7/10/10 | 280 |
| 7/10/10 | 280 |
| 7/10/10 | 281 |
| 7/10/10 | 280 |
| 7/10/10 | 280 |
| 7/10/10 | 279 |
| 7/10/10 | 280 |
| 7/10/10 | 280 |
| 7/10/10 | 279 |
| 7/10/10 | 279 |
| 7/10/10 | 279 |
| 7/10/10 | 279 |
| 7/10/10 | 279 |
| 7/10/10 | 279 |
| 7/11/10 | 278 |
| 7/11/10 | 279 |
| 7/11/10 | 279 |
| 7/11/10 | 279 |
| 7/11/10 | 279 |
| 7/11/10 | 280 |
| 7/11/10 | 280 |
| 7/11/10 | 280 |
| 7/11/10 | 280 |
| 7/11/10 | 280 |
| 7/11/10 | 280 |
| 7/11/10 | 280 |
| 7/11/10 | 280 |
| 7/11/10 | 288 |
| 7/11/10 | 280 |
| 7/11/10 | 280 |
| 7/11/10 | 280 |
| 7/11/10 | 280 |
| 7/11/10 | 281 |
| 7/11/10 | 281 |
| 7/11/10 | 281 |
| 7/11/10 | 282 |
| 7/11/10 | 281 |
| 7/11/10 | 282 |
| 7/11/10 | 282 |
| 7/11/10 | 282 |
| 7/11/10 | 282 |
| 7/11/10 | 283 |
| 7/11/10 | 283 |
| 7/11/10 | 283 |
| 7/11/10 | 283 |
| 7/11/10 | 284 |
| 7/11/10 | 284 |
| 7/11/10 | 284 |
| 7/11/10 | 284 |
| 7/11/10 | 285 |
| 7/11/10 | 284 |
| 7/11/10 | 283 |
| 7/11/10 | 284 |
| 7/11/10 | 279 |
| 7/11/10 | 280 |
| 7/11/10 | 281 |
| 7/11/10 | 281 |
| 7/11/10 | 281 |
| 7/11/10 | 282 |
| 7/11/10 | 281 |
| 7/11/10 | 281 |
| 7/11/10 | 281 |
| 7/12/10 | 281 |
| 7/12/10 | 281 |
| 7/12/10 | 281 |
| 7/12/10 | 281 |
| 7/12/10 | 280 |
| 7/12/10 | 281 |
| 7/12/10 | 280 |
| 7/12/10 | 281 |
| 7/12/10 | 280 |
| 7/12/10 | 280 |
| 7/12/10 | 280 |
| 7/12/10 | 280 |
| 7/12/10 | 280 |
| 7/12/10 | 280 |
| 7/12/10 | 280 |
| 7/12/10 | 281 |
| 7/12/10 | 281 |
| 7/12/10 | 281 |
| 7/12/10 | 281 |
| 7/12/10 | 281 |
| 7/12/10 | 281 |
| 7/12/10 | 282 |
| 7/12/10 | 281 |
| 7/12/10 | 282 |
| 7/12/10 | 282 |
| 7/12/10 | 282 |
| 7/12/10 | 282 |
| 7/12/10 | 281 |
| 7/12/10 | 281 |
| 7/12/10 | 281 |
| 7/12/10 | 281 |
| 7/12/10 | 281 |
| 7/12/10 | 281 |
| 7/12/10 | 281 |
| 7/12/10 | 282 |
| 7/12/10 | 282 |
| 7/12/10 | 281 |
| 7/12/10 | 282 |
| 7/12/10 | 281 |
| 7/12/10 | 281 |
| 7/12/10 | 282 |
| 7/12/10 | 282 |
| 7/12/10 | 282 |
| 7/12/10 | 282 |
| 7/12/10 | 282 |
| 7/12/10 | 282 |
| 7/12/10 | 281 |
| 7/12/10 | 281 |
| 7/13/10 | 281 |
| 7/13/10 | 281 |
| 7/13/10 | 281 |
| 7/13/10 | 281 |
| 7/13/10 | 281 |
| 7/13/10 | 281 |
| 7/13/10 | 281 |
| 7/13/10 | 281 |
| 7/13/10 | 281 |
| 7/13/10 | 281 |
| 7/13/10 | 281 |
| 7/13/10 | 281 |
| 7/13/10 | 282 |
| 7/13/10 | 282 |
| 7/13/10 | 282 |
| 7/13/10 | 282 |
| 7/13/10 | 282 |
| 7/13/10 | 282 |
| 7/13/10 | 282 |
| 7/13/10 | 283 |
| 7/13/10 | 283 |
| 7/13/10 | 282 |
| 7/13/10 | 283 |
| 7/13/10 | 281 |
| 7/13/10 | 282 |
| 7/13/10 | 283 |
| 7/13/10 | 282 |
| 7/13/10 | 284 |
| 7/13/10 | 284 |
| 7/13/10 | 284 |
| 7/13/10 | 284 |
| 7/13/10 | 284 |
| 7/13/10 | 284 |
| 7/13/10 | 285 |
| 7/13/10 | 285 |
| 7/13/10 | 285 |
| 7/13/10 | 285 |
| 7/13/10 | 285 |
| 7/13/10 | 284 |
| 7/13/10 | 284 |
| 7/13/10 | 284 |
| 7/13/10 | 284 |
| 7/13/10 | 284 |
| 7/13/10 | 283 |
| 7/13/10 | 283 |
| 7/13/10 | 283 |
| 7/13/10 | 282 |
| 7/13/10 | 282 |
| 7/14/10 | 282 |
| 7/14/10 | 282 |
| 7/14/10 | 282 |
| 7/14/10 | 282 |
| 7/14/10 | 283 |
| 7/14/10 | 283 |
| 7/14/10 | 283 |
| 7/14/10 | 283 |
| 7/14/10 | 283 |
| 7/14/10 | 283 |
| 7/14/10 | 283 |
| 7/14/10 | 283 |
| 7/14/10 | 283 |
| 7/14/10 | 283 |
| 7/14/10 | 283 |
| 7/14/10 | 284 |
| 7/14/10 | 283 |
| 7/14/10 | 283 |
| 7/14/10 | 283 |
| 7/14/10 | 283 |
| 7/14/10 | 284 |
| 7/14/10 | 284 |
| 7/14/10 | 284 |
| 7/14/10 | 284 |
| 7/14/10 | 285 |
| 7/14/10 | 285 |
| 7/14/10 | 283 |
| 7/14/10 | 284 |
| 7/14/10 | 285 |
| 7/14/10 | 286 |
| 7/14/10 | 286 |
| 7/14/10 | 284 |
| 7/14/10 | 284 |
| 7/14/10 | 284 |
| 7/14/10 | 284 |
| 7/14/10 | 282 |
| 7/14/10 | 283 |
| 7/14/10 | 284 |
| 7/14/10 | 285 |
| 7/14/10 | 286 |
| 7/14/10 | 285 |
| 7/14/10 | 284 |
| 7/14/10 | 283 |
| 7/14/10 | 283 |
| 7/14/10 | 283 |
| 7/14/10 | 283 |
| 7/14/10 | 283 |
| 7/14/10 | 284 |
| 7/15/10 | 283 |
| 7/15/10 | 284 |
| 7/15/10 | 284 |
| 7/15/10 | 283 |
| 7/15/10 | 283 |
| 7/15/10 | 283 |
| 7/15/10 | 283 |
| 7/15/10 | 283 |
| 7/15/10 | 283 |
| 7/15/10 | 283 |
| 7/15/10 | 283 |
| 7/15/10 | 283 |
| 7/15/10 | 283 |
| 7/15/10 | 283 |
| 7/15/10 | 283 |
| 7/15/10 | 283 |
| 7/15/10 | 283 |
| 7/15/10 | 283 |
| 7/15/10 | 284 |
| 7/15/10 | 284 |
| 7/15/10 | 284 |
| 7/15/10 | 284 |
| 7/15/10 | 284 |
| 7/15/10 | 284 |
| 7/15/10 | 284 |
| 7/15/10 | 285 |
| 7/15/10 | 285 |
| 7/15/10 | 285 |
| 7/15/10 | 285 |
| 7/15/10 | 285 |
| 7/15/10 | 285 |
| 7/15/10 | 285 |
| 7/15/10 | 286 |
| 7/15/10 | 285 |
| 7/15/10 | 286 |
| 7/15/10 | 284 |
| 7/15/10 | 284 |
| 7/15/10 | 283 |
| 7/15/10 | 284 |
| 7/15/10 | 284 |
| 7/15/10 | 284 |
| 7/15/10 | 284 |
| 7/15/10 | 284 |
| 7/15/10 | 284 |
| 7/15/10 | 284 |
| 7/15/10 | 284 |
| 7/15/10 | 284 |
| 7/15/10 | 284 |
| 7/16/10 | 285 |
| 7/16/10 | 285 |
| 7/16/10 | 285 |
| 7/16/10 | 284 |
| 7/16/10 | 284 |
| 7/16/10 | 284 |
| 7/16/10 | 283 |
| 7/16/10 | 283 |
| 7/16/10 | 283 |
| 7/16/10 | 283 |
| 7/16/10 | 283 |
| 7/16/10 | 283 |
| 7/16/10 | 283 |
| 7/16/10 | 283 |
| 7/16/10 | 283 |
| 7/16/10 | 283 |
| 7/16/10 | 283 |
| 7/16/10 | 283 |
| 7/16/10 | 284 |
| 7/16/10 | 283 |
| 7/16/10 | 283 |
| 7/16/10 | 284 |
| 7/16/10 | 283 |
| 7/16/10 | 283 |
| 7/16/10 | 283 |
| 7/16/10 | 283 |
| 7/16/10 | 283 |
| 7/16/10 | 283 |
| 7/16/10 | 283 |
| 7/16/10 | 283 |
| 7/16/10 | 283 |
| 7/16/10 | 283 |
| 7/16/10 | 283 |
| 7/16/10 | 284 |
| 7/16/10 | 284 |
| 7/16/10 | 282 |
| 7/16/10 | 283 |
| 7/16/10 | 284 |
| 7/16/10 | 283 |
| 7/16/10 | 283 |
| 7/16/10 | 283 |
| 7/16/10 | 284 |
| 7/16/10 | 285 |
| 7/16/10 | 284 |
| 7/16/10 | 283 |
| 7/16/10 | 282 |
| 7/16/10 | 282 |
| 7/16/10 | 282 |
| 7/17/10 | 282 |
| 7/17/10 | 282 |
| 7/17/10 | 282 |
| 7/17/10 | 282 |
| 7/17/10 | 283 |
| 7/17/10 | 283 |
| 7/17/10 | 283 |
| 7/17/10 | 283 |
| 7/17/10 | 283 |
| 7/17/10 | 283 |
| 7/17/10 | 283 |
| 7/17/10 | 283 |
| 7/17/10 | 284 |
| 7/17/10 | 284 |
| 7/17/10 | 284 |
| 7/17/10 | 284 |
| 7/17/10 | 284 |
| 7/17/10 | 283 |
| 7/17/10 | 284 |
| 7/17/10 | 284 |
| 7/17/10 | 284 |
| 7/17/10 | 284 |
| 7/17/10 | 285 |
| 7/17/10 | 285 |
| 7/17/10 | 285 |
| 7/17/10 | 286 |
| 7/17/10 | 284 |
| 7/17/10 | 284 |
| 7/17/10 | 286 |
| 7/17/10 | 286 |
| 7/17/10 | 284 |
| 7/17/10 | 285 |
| 7/17/10 | 285 |
| 7/17/10 | 285 |
| 7/17/10 | 285 |
| 7/17/10 | 283 |
| 7/17/10 | 284 |
| 7/17/10 | 284 |
| 7/17/10 | 283 |
| 7/17/10 | 284 |
| 7/17/10 | 284 |
| 7/17/10 | 284 |
| 7/17/10 | 284 |
| 7/17/10 | 284 |
| 7/17/10 | 283 |
| 7/17/10 | 282 |
| 7/17/10 | 282 |
| 7/17/10 | 283 |
| 7/18/10 | 283 |
| 7/18/10 | 284 |
| 7/18/10 | 283 |
| 7/18/10 | 283 |
| 7/18/10 | 283 |
| 7/18/10 | 283 |
| 7/18/10 | 283 |
| 7/18/10 | 283 |
| 7/18/10 | 283 |
| 7/18/10 | 283 |
| 7/18/10 | 283 |
| 7/18/10 | 283 |
| 7/18/10 | 283 |
| 7/18/10 | 283 |
| 7/18/10 | 283 |
| 7/18/10 | 283 |
| 7/18/10 | 283 |
| 7/18/10 | 284 |
| 7/18/10 | 284 |
| 7/18/10 | 284 |
| 7/18/10 | 284 |
| 7/18/10 | 284 |
| 7/18/10 | 284 |
| 7/18/10 | 284 |
| 7/18/10 | 284 |
| 7/18/10 | 284 |
| 7/18/10 | 284 |
| 7/18/10 | 285 |
| 7/18/10 | 285 |
| 7/18/10 | 285 |
| 7/18/10 | 285 |
| 7/18/10 | 285 |
| 7/18/10 | 286 |
| 7/18/10 | 286 |
| 7/18/10 | 286 |
| 7/18/10 | 286 |
| 7/18/10 | 286 |
| 7/18/10 | 285 |
| 7/18/10 | 284 |
| 7/18/10 | 285 |
| 7/18/10 | 285 |
| 7/18/10 | 285 |
| 7/18/10 | 285 |
| 7/18/10 | 284 |
| 7/18/10 | 284 |
| 7/18/10 | 283 |
| 7/18/10 | 284 |
| 7/18/10 | 285 |
| 7/19/10 | 285 |
| 7/19/10 | 285 |
| 7/19/10 | 286 |
| 7/19/10 | 285 |
| 7/19/10 | 283 |
| 7/19/10 | 283 |
| 7/19/10 | 283 |
| 7/19/10 | 283 |
| 7/19/10 | 283 |
| 7/19/10 | 283 |
| 7/19/10 | 283 |
| 7/19/10 | 283 |
| 7/19/10 | 283 |
| 7/19/10 | 283 |
| 7/19/10 | 283 |
| 7/19/10 | 283 |
| 7/19/10 | 283 |
| 7/19/10 | 283 |
| 7/19/10 | 283 |
| 7/19/10 | 283 |
| 7/19/10 | 283 |
| 7/19/10 | 283 |
| 7/19/10 | 283 |
| 7/19/10 | 283 |
| 7/19/10 | 282 |
| 7/19/10 | 283 |
| 7/19/10 | 283 |
| 7/19/10 | 283 |
| 7/19/10 | 283 |
| 7/19/10 | 283 |
| 7/19/10 | 283 |
| 7/19/10 | 284 |
| 7/19/10 | 284 |
| 7/19/10 | 284 |
| 7/19/10 | 284 |
| 7/19/10 | 284 |
| 7/19/10 | 284 |
| 7/19/10 | 282 |
| 7/19/10 | 283 |
| 7/19/10 | 281 |
| 7/19/10 | 282 |
| 7/19/10 | 282 |
| 7/19/10 | 282 |
| 7/19/10 | 282 |
| 7/19/10 | 282 |
| 7/19/10 | 282 |
| 7/19/10 | 282 |
| 7/19/10 | 282 |
| 7/20/10 | 282 |
| 7/20/10 | 282 |
| 7/20/10 | 283 |
| 7/20/10 | 283 |
| 7/20/10 | 283 |
| 7/20/10 | 283 |
| 7/20/10 | 283 |
| 7/20/10 | 283 |
| 7/20/10 | 283 |
| 7/20/10 | 284 |
| 7/20/10 | 284 |
| 7/20/10 | 284 |
| 7/20/10 | 284 |
| 7/20/10 | 284 |
| 7/20/10 | 284 |
| 7/20/10 | 283 |
| 7/20/10 | 283 |
| 7/20/10 | 283 |
| 7/20/10 | 283 |
| 7/20/10 | 283 |
| 7/20/10 | 283 |
| 7/20/10 | 284 |
| 7/20/10 | 284 |
| 7/20/10 | 284 |
| 7/20/10 | 284 |
| 7/20/10 | 284 |
| 7/20/10 | 285 |
| 7/20/10 | 284 |
| 7/20/10 | 282 |
| 7/20/10 | 282 |
| 7/20/10 | 282 |
| 7/20/10 | 282 |
| 7/20/10 | 282 |
| 7/20/10 | 281 |
| 7/20/10 | 282 |
| 7/20/10 | 283 |
| 7/20/10 | 283 |
| 7/20/10 | 283 |
| 7/20/10 | 284 |
| 7/20/10 | 285 |
| 7/20/10 | 284 |
| 7/20/10 | 283 |
| 7/20/10 | 284 |
| 7/20/10 | 282 |
| 7/20/10 | 281 |
| 7/20/10 | 281 |
| 7/20/10 | 281 |
| 7/20/10 | 281 |
| 7/21/10 | 281 |
| 7/21/10 | 282 |
| 7/21/10 | 281 |
| 7/21/10 | 281 |
| 7/21/10 | 282 |
| 7/21/10 | 282 |
| 7/21/10 | 281 |
| 7/21/10 | 282 |
| 7/21/10 | 282 |
| 7/21/10 | 282 |
| 7/21/10 | 282 |
| 7/21/10 | 282 |
| 7/21/10 | 282 |
| 7/21/10 | 282 |
| 7/21/10 | 282 |
| 7/21/10 | 282 |
| 7/21/10 | 282 |
| 7/21/10 | 283 |
| 7/21/10 | 283 |
| 7/21/10 | 283 |
| 7/21/10 | 283 |
| 7/21/10 | 283 |
| 7/21/10 | 283 |
| 7/21/10 | 283 |
| 7/21/10 | 284 |
| 7/21/10 | 284 |
| 7/21/10 | 284 |
| 7/21/10 | 284 |
| 7/21/10 | 285 |
| 7/21/10 | 284 |
| 7/21/10 | 284 |
| 7/21/10 | 284 |
| 7/21/10 | 284 |
| 7/21/10 | 283 |
| 7/21/10 | 284 |
| 7/21/10 | 282 |
| 7/21/10 | 283 |
| 7/21/10 | 282 |
| 7/21/10 | 282 |
| 7/21/10 | 282 |
| 7/21/10 | 282 |
| 7/21/10 | 283 |
| 7/21/10 | 282 |
| 7/21/10 | 282 |
| 7/21/10 | 281 |
| 7/21/10 | 281 |
| 7/21/10 | 280 |
| 7/21/10 | 280 |
| 7/22/10 | 280 |
| 7/22/10 | 280 |
| 7/22/10 | 280 |
| 7/22/10 | 280 |
| 7/22/10 | 280 |
| 7/22/10 | 280 |
| 7/22/10 | 280 |
| 7/22/10 | 280 |
| 7/22/10 | 281 |
| 7/22/10 | 281 |
| 7/22/10 | 281 |
| 7/22/10 | 281 |
| 7/22/10 | 281 |
| 7/22/10 | 282 |
| 7/22/10 | 282 |
| 7/22/10 | 282 |
| 7/22/10 | 282 |
| 7/22/10 | 282 |
| 7/22/10 | 283 |
| 7/22/10 | 282 |
| 7/22/10 | 282 |
| 7/22/10 | 282 |
| 7/22/10 | 282 |
| 7/22/10 | 284 |
| 7/22/10 | 283 |
| 7/22/10 | 282 |
| 7/22/10 | 281 |
| 7/22/10 | 281 |
| 7/22/10 | 281 |
| 7/22/10 | 282 |
| 7/22/10 | 283 |
| 7/22/10 | 282 |
| 7/22/10 | 283 |
| 7/22/10 | 283 |
| 7/22/10 | 282 |
| 7/22/10 | 281 |
| 7/22/10 | 282 |
| 7/22/10 | 282 |
| 7/22/10 | 282 |
| 7/22/10 | 281 |
| 7/22/10 | 281 |
| 7/22/10 | 281 |
| 7/22/10 | 281 |
| 7/22/10 | 281 |
| 7/22/10 | 281 |
| 7/22/10 | 281 |
| 7/22/10 | 281 |
| 7/22/10 | 282 |
| 7/23/10 | 282 |
| 7/23/10 | 281 |
| 7/23/10 | 281 |
| 7/23/10 | 280 |
| 7/23/10 | 281 |
| 7/23/10 | 281 |
| 7/23/10 | 281 |
| 7/23/10 | 281 |
| 7/23/10 | 281 |
| 7/23/10 | 281 |
| 7/23/10 | 281 |
| 7/23/10 | 281 |
| 7/23/10 | 282 |
| 7/23/10 | 281 |
| 7/23/10 | 281 |
| 7/23/10 | 281 |
| 7/23/10 | 282 |
| 7/23/10 | 282 |
| 7/23/10 | 282 |
| 7/23/10 | 282 |
| 7/23/10 | 282 |
| 7/23/10 | 282 |
| 7/23/10 | 282 |
| 7/23/10 | 282 |
| 7/23/10 | 281 |
| 7/23/10 | 282 |
| 7/23/10 | 282 |
| 7/23/10 | 282 |
| 7/23/10 | 282 |
| 7/23/10 | 283 |
| 7/23/10 | 282 |
| 7/23/10 | 282 |
| 7/23/10 | 283 |
| 7/23/10 | 283 |
| 7/23/10 | 282 |
| 7/23/10 | 282 |
| 7/23/10 | 283 |
| 7/23/10 | 282 |
| 7/23/10 | 282 |
| 7/23/10 | 282 |
| 7/23/10 | 281 |
| 7/23/10 | 281 |
| 7/23/10 | 281 |
| 7/23/10 | 282 |
| 7/23/10 | 282 |
| 7/23/10 | 282 |
| 7/23/10 | 281 |
| 7/23/10 | 281 |
| 7/24/10 | 281 |
| 7/24/10 | 281 |
| 7/24/10 | 281 |
| 7/24/10 | 281 |
| 7/24/10 | 278 |
| 7/24/10 | 277 |
| 7/24/10 | 278 |
| 7/24/10 | 279 |
| 7/24/10 | 278 |
| 7/24/10 | 278 |
| 7/24/10 | 278 |
| 7/24/10 | 278 |
| 7/24/10 | 278 |
| 7/24/10 | 278 |
| 7/24/10 | 278 |
| 7/24/10 | 278 |
| 7/24/10 | 278 |
| 7/24/10 | 278 |
| 7/24/10 | 279 |
| 7/24/10 | 279 |
| 7/24/10 | 280 |
| 7/24/10 | 280 |
| 7/24/10 | 279 |
| 7/24/10 | 279 |
| 7/24/10 | 278 |
| 7/24/10 | 278 |
| 7/24/10 | 278 |
| 7/24/10 | 279 |
| 7/24/10 | 280 |
| 7/24/10 | 279 |
| 7/24/10 | 280 |
| 7/24/10 | 280 |
| 7/24/10 | 280 |
| 7/24/10 | 280 |
| 7/24/10 | 280 |
| 7/24/10 | 279 |
| 7/24/10 | 279 |
| 7/24/10 | 278 |
| 7/24/10 | 278 |
| 7/24/10 | 278 |
| 7/24/10 | 279 |
| 7/24/10 | 279 |
| 7/24/10 | 278 |
| 7/24/10 | 278 |
| 7/24/10 | 276 |
| 7/24/10 | 276 |
| 7/24/10 | 276 |
| 7/24/10 | 277 |
| 7/25/10 | 277 |
| 7/25/10 | 276 |
| 7/25/10 | 276 |
| 7/25/10 | 276 |
| 7/25/10 | 276 |
| 7/25/10 | 276 |
| 7/25/10 | 276 |
| 7/25/10 | 276 |
| 7/25/10 | 277 |
| 7/25/10 | 277 |
| 7/25/10 | 277 |
| 7/25/10 | 277 |
| 7/25/10 | 277 |
| 7/25/10 | 277 |
| 7/25/10 | 277 |
| 7/25/10 | 277 |
| 7/25/10 | 277 |
| 7/25/10 | 277 |
| 7/25/10 | 277 |
| 7/25/10 | 277 |
| 7/25/10 | 278 |
| 7/25/10 | 278 |
| 7/25/10 | 277 |
| 7/25/10 | 277 |
| 7/25/10 | 277 |
| 7/25/10 | 277 |
| 7/25/10 | 277 |
| 7/25/10 | 277 |
| 7/25/10 | 277 |
| 7/25/10 | 277 |
| 7/25/10 | 278 |
| 7/25/10 | 278 |
| 7/25/10 | 277 |
| 7/25/10 | 277 |
| 7/25/10 | 277 |
| 7/25/10 | 277 |
| 7/25/10 | 276 |
| 7/25/10 | 276 |
| 7/25/10 | 276 |
| 7/25/10 | 276 |
| 7/25/10 | 276 |
| 7/25/10 | 276 |
| 7/25/10 | 276 |
| 7/25/10 | 276 |
| 7/25/10 | 276 |
| 7/25/10 | 276 |
| 7/25/10 | 277 |
| 7/25/10 | 276 |
| 7/26/10 | 276 |
| 7/26/10 | 276 |
| 7/26/10 | 276 |
| 7/26/10 | 276 |
| 7/26/10 | 276 |
| 7/26/10 | 276 |
| 7/26/10 | 277 |
| 7/26/10 | 277 |
| 7/26/10 | 277 |
| 7/26/10 | 277 |
| 7/26/10 | 277 |
| 7/26/10 | 277 |
| 7/26/10 | 278 |
| 7/26/10 | 278 |
| 7/26/10 | 278 |
| 7/26/10 | 278 |
| 7/26/10 | 278 |
| 7/26/10 | 278 |
| 7/26/10 | 278 |
| 7/26/10 | 277 |
| 7/26/10 | 278 |
| 7/26/10 | 278 |
| 7/26/10 | 278 |
| 7/26/10 | 279 |
| 7/26/10 | 279 |
| 7/26/10 | 279 |
| 7/26/10 | 279 |
| 7/26/10 | 280 |
| 7/26/10 | 280 |
| 7/26/10 | 280 |
| 7/26/10 | 280 |
| 7/26/10 | 279 |
| 7/26/10 | 280 |
| 7/26/10 | 279 |
| 7/26/10 | 277 |
| 7/26/10 | 278 |
| 7/26/10 | 279 |
| 7/26/10 | 278 |
| 7/26/10 | 277 |
| 7/26/10 | 277 |
| 7/26/10 | 277 |
| 7/26/10 | 276 |
| 7/26/10 | 276 |
| 7/26/10 | 276 |
| 7/26/10 | 278 |
| 7/26/10 | 277 |
| 7/26/10 | 278 |
| 7/26/10 | 278 |
| 7/27/10 | 277 |
| 7/27/10 | 277 |
| 7/27/10 | 277 |
| 7/27/10 | 277 |
| 7/27/10 | 277 |
| 7/27/10 | 277 |
| 7/27/10 | 278 |
| 7/27/10 | 277 |
| 7/27/10 | 277 |
| 7/27/10 | 277 |
| 7/27/10 | 278 |
| 7/27/10 | 278 |
| 7/27/10 | 278 |
| 7/27/10 | 278 |
| 7/27/10 | 278 |
| 7/27/10 | 278 |
| 7/27/10 | 278 |
| 7/27/10 | 278 |
| 7/27/10 | 278 |
| 7/27/10 | 278 |
| 7/27/10 | 278 |
| 7/27/10 | 279 |
| 7/27/10 | 279 |
| 7/27/10 | 279 |
| 7/27/10 | 280 |
| 7/27/10 | 280 |
| 7/27/10 | 280 |
| 7/27/10 | 280 |
| 7/27/10 | 280 |
| 7/27/10 | 280 |
| 7/27/10 | 280 |
| 7/27/10 | 280 |
| 7/27/10 | 280 |
| 7/27/10 | 280 |
| 7/27/10 | 277 |
| 7/27/10 | 278 |
| 7/27/10 | 278 |
| 7/27/10 | 278 |
| 7/27/10 | 278 |
| 7/27/10 | 278 |
| 7/27/10 | 277 |
| 7/27/10 | 277 |
| 7/27/10 | 277 |
| 7/27/10 | 277 |
| 7/27/10 | 276 |
| 7/27/10 | 277 |
| 7/27/10 | 277 |
| 7/27/10 | 277 |
| 7/28/10 | 278 |
| 7/28/10 | 278 |
| 7/28/10 | 278 |
| 7/28/10 | 277 |
| 7/28/10 | 277 |
| 7/28/10 | 277 |
| 7/28/10 | 277 |
| 7/28/10 | 277 |
| 7/28/10 | 277 |
| 7/28/10 | 277 |
| 7/28/10 | 277 |
| 7/28/10 | 277 |
| 7/28/10 | 278 |
| 7/28/10 | 279 |
| 7/28/10 | 278 |
| 7/28/10 | 278 |
| 7/28/10 | 278 |
| 7/28/10 | 279 |
| 7/28/10 | 279 |
| 7/28/10 | 279 |
| 7/28/10 | 279 |
| 7/28/10 | 279 |
| 7/28/10 | 279 |
| 7/28/10 | 279 |
| 7/28/10 | 280 |
| 7/28/10 | 280 |
| 7/28/10 | 280 |
| 7/28/10 | 279 |
| 7/28/10 | 279 |
| 7/28/10 | 278 |
| 7/28/10 | 278 |
| 7/28/10 | 280 |
| 7/28/10 | 280 |
| 7/28/10 | 280 |
| 7/28/10 | 279 |
| 7/28/10 | 279 |
| 7/28/10 | 279 |
| 7/28/10 | 278 |
| 7/28/10 | 278 |
| 7/28/10 | 277 |
| 7/28/10 | 278 |
| 7/28/10 | 280 |
| 7/28/10 | 280 |
| 7/28/10 | 279 |
| 7/28/10 | 278 |
| 7/28/10 | 277 |
| 7/28/10 | 277 |
| 7/28/10 | 277 |
| 7/29/10 | 277 |
| 7/29/10 | 279 |
| 7/29/10 | 278 |
| 7/29/10 | 278 |
| 7/29/10 | 276 |
| 7/29/10 | 276 |
| 7/29/10 | 276 |
| 7/29/10 | 277 |
| 7/29/10 | 276 |
| 7/29/10 | 276 |
| 7/29/10 | 277 |
| 7/29/10 | 276 |
| 7/29/10 | 276 |
| 7/29/10 | 276 |
| 7/29/10 | 275 |
| 7/29/10 | 275 |
| 7/29/10 | 275 |
| 7/29/10 | 275 |
| 7/29/10 | 276 |
| 7/29/10 | 276 |
| 7/29/10 | 276 |
| 7/29/10 | 276 |
| 7/29/10 | 276 |
| 7/29/10 | 276 |
| 7/29/10 | 277 |
| 7/29/10 | 277 |
| 7/29/10 | 276 |
| 7/29/10 | 275 |
| 7/29/10 | 274 |
| 7/29/10 | 274 |
| 7/29/10 | 275 |
| 7/29/10 | 276 |
| 7/29/10 | 277 |
| 7/29/10 | 275 |
| 7/29/10 | 274 |
| 7/29/10 | 275 |
| 7/29/10 | 275 |
| 7/29/10 | 274 |
| 7/29/10 | 274 |
| 7/29/10 | 275 |
| 7/29/10 | 275 |
| 7/29/10 | 274 |
| 7/29/10 | 274 |
| 7/29/10 | 274 |
| 7/29/10 | 274 |
| 7/29/10 | 274 |
| 7/29/10 | 274 |
| 7/29/10 | 275 |
| 7/30/10 | 275 |
| 7/30/10 | 274 |
| 7/30/10 | 275 |
| 7/30/10 | 275 |
| 7/30/10 | 275 |
| 7/30/10 | 275 |
| 7/30/10 | 275 |
| 7/30/10 | 276 |
| 7/30/10 | 276 |
| 7/30/10 | 276 |
| 7/30/10 | 276 |
| 7/30/10 | 276 |
| 7/30/10 | 277 |
| 7/30/10 | 276 |
| 7/30/10 | 276 |
| 7/30/10 | 276 |
| 7/30/10 | 276 |
| 7/30/10 | 276 |
| 7/30/10 | 276 |
| 7/30/10 | 276 |
| 7/30/10 | 276 |
| 7/30/10 | 277 |
| 7/30/10 | 278 |
| 7/30/10 | 278 |
| 7/30/10 | 277 |
| 7/30/10 | 278 |
| 7/30/10 | 278 |
| 7/30/10 | 276 |
| 7/30/10 | 277 |
| 7/30/10 | 277 |
| 7/30/10 | 278 |
| 7/30/10 | 276 |
| 7/30/10 | 275 |
| 7/30/10 | 278 |
| 7/30/10 | 275 |
| 7/30/10 | 276 |
| 7/30/10 | 275 |
| 7/30/10 | 275 |
| 7/30/10 | 275 |
| 7/30/10 | 275 |
| 7/30/10 | 275 |
| 7/30/10 | 276 |
| 7/30/10 | 274 |
| 7/30/10 | 275 |
| 7/30/10 | 274 |
| 7/30/10 | 274 |
| 7/30/10 | 274 |
| 7/30/10 | 274 |
| 7/31/10 | 275 |
| 7/31/10 | 275 |
| 7/31/10 | 275 |
| 7/31/10 | 275 |
| 7/31/10 | 274 |
| 7/31/10 | 275 |
| 7/31/10 | 275 |
| 7/31/10 | 275 |
| 7/31/10 | 276 |
| 7/31/10 | 276 |
| 7/31/10 | 276 |
| 7/31/10 | 276 |
| 7/31/10 | 276 |
| 7/31/10 | 276 |
| 7/31/10 | 276 |
| 7/31/10 | 276 |
| 7/31/10 | 276 |
| 7/31/10 | 276 |
| 7/31/10 | 276 |
| 7/31/10 | 276 |
| 7/31/10 | 277 |
| 7/31/10 | 278 |
| 7/31/10 | 278 |
| 7/31/10 | 278 |
| 7/31/10 | 278 |
| 7/31/10 | 278 |
| 7/31/10 | 278 |
| 7/31/10 | 276 |
| 7/31/10 | 277 |
| 7/31/10 | 277 |
| 7/31/10 | 278 |
| 7/31/10 | 278 |
| 7/31/10 | 277 |
| 7/31/10 | 277 |
| 7/31/10 | 277 |
| 7/31/10 | 275 |
| 7/31/10 | 276 |
| 7/31/10 | 275 |
| 7/31/10 | 275 |
| 7/31/10 | 275 |
| 7/31/10 | 275 |
| 7/31/10 | 275 |
| 7/31/10 | 276 |
| 7/31/10 | 276 |
| 7/31/10 | 275 |
| 7/31/10 | 275 |
| 7/31/10 | 276 |
| 7/31/10 | 276 |
| 8/1/10 | 276 |
| 8/1/10 | 276 |
| 8/1/10 | 275 |
| 8/1/10 | 275 |
| 8/1/10 | 275 |
| 8/1/10 | 275 |
| 8/1/10 | 275 |
| 8/1/10 | 274 |
| 8/1/10 | 274 |
| 8/1/10 | 274 |
| 8/1/10 | 274 |
| 8/1/10 | 275 |
| 8/1/10 | 275 |
| 8/1/10 | 276 |
| 8/1/10 | 276 |
| 8/1/10 | 276 |
| 8/1/10 | 276 |
| 8/1/10 | 276 |
| 8/1/10 | 276 |
| 8/1/10 | 276 |
| 8/1/10 | 276 |
| 8/1/10 | 277 |
| 8/1/10 | 277 |
| 8/1/10 | 278 |
| 8/1/10 | 277 |
| 8/1/10 | 276 |
| 8/1/10 | 276 |
| 8/1/10 | 276 |
| 8/1/10 | 276 |
| 8/1/10 | 275 |
| 8/1/10 | 276 |
| 8/1/10 | 276 |
| 8/1/10 | 275 |
| 8/1/10 | 275 |
| 8/1/10 | 275 |
| 8/1/10 | 275 |
| 8/1/10 | 275 |
| 8/1/10 | 275 |
| 8/1/10 | 275 |
| 8/1/10 | 276 |
| 8/1/10 | 276 |
| 8/1/10 | 275 |
| 8/1/10 | 274 |
| 8/1/10 | 275 |
| 8/1/10 | 275 |
| 8/1/10 | 276 |
| 8/1/10 | 275 |
| 8/1/10 | 275 |
| 8/2/10 | 275 |
| 8/2/10 | 275 |
| 8/2/10 | 275 |
| 8/2/10 | 275 |
| 8/2/10 | 275 |
| 8/2/10 | 275 |
| 8/2/10 | 275 |
| 8/2/10 | 275 |
| 8/2/10 | 275 |
| 8/2/10 | 275 |
| 8/2/10 | 275 |
| 8/2/10 | 275 |
| 8/2/10 | 275 |
| 8/2/10 | 275 |
| 8/2/10 | 276 |
| 8/2/10 | 276 |
| 8/2/10 | 276 |
| 8/2/10 | 276 |
| 8/2/10 | 276 |
| 8/2/10 | 276 |
| 8/2/10 | 276 |
| 8/2/10 | 277 |
| 8/2/10 | 277 |
| 8/2/10 | 277 |
| 8/2/10 | 278 |
| 8/2/10 | 278 |
| 8/2/10 | 277 |
| 8/2/10 | 277 |
| 8/2/10 | 278 |
| 8/2/10 | 279 |
| 8/2/10 | 277 |
| 8/2/10 | 279 |
| 8/2/10 | 276 |
| 8/2/10 | 279 |
| 8/2/10 | 276 |
| 8/2/10 | 278 |
| 8/2/10 | 277 |
| 8/2/10 | 277 |
| 8/2/10 | 277 |
| 8/2/10 | 275 |
| 8/2/10 | 276 |
| 8/2/10 | 275 |
| 8/2/10 | 275 |
| 8/2/10 | 275 |
| 8/2/10 | 275 |
| 8/2/10 | 275 |
| 8/2/10 | 274 |
| 8/2/10 | 275 |
| 8/3/10 | 276 |
| 8/3/10 | 276 |
| 8/3/10 | 275 |
| 8/3/10 | 275 |
| 8/3/10 | 275 |
| 8/3/10 | 275 |
| 8/3/10 | 276 |
| 8/3/10 | 276 |
| 8/3/10 | 277 |
| 8/3/10 | 278 |
| 8/3/10 | 275 |
| 8/3/10 | 274 |
| 8/3/10 | 273 |
| 8/3/10 | 274 |
| 8/3/10 | 274 |
| 8/3/10 | 274 |
| 8/3/10 | 274 |
| 8/3/10 | 275 |
| 8/3/10 | 275 |
| 8/3/10 | 275 |
| 8/3/10 | 275 |
| 8/3/10 | 275 |
| 8/3/10 | 275 |
| 8/3/10 | 276 |
| 8/3/10 | 276 |
| 8/3/10 | 276 |
| 8/3/10 | 276 |
| 8/3/10 | 276 |
| 8/3/10 | 276 |
| 8/3/10 | 275 |
| 8/3/10 | 275 |
| 8/3/10 | 276 |
| 8/3/10 | 275 |
| 8/3/10 | 275 |
| 8/3/10 | 276 |
| 8/3/10 | 275 |
| 8/3/10 | 275 |
| 8/3/10 | 274 |
| 8/3/10 | 276 |
| 8/3/10 | 276 |
| 8/3/10 | 274 |
| 8/3/10 | 273 |
| 8/3/10 | 273 |
| 8/3/10 | 272 |
| 8/3/10 | 272 |
| 8/3/10 | 272 |
| 8/3/10 | 272 |
| 8/3/10 | 272 |
| 8/4/10 | 272 |
| 8/4/10 | 272 |
| 8/4/10 | 273 |
| 8/4/10 | 274 |
| 8/4/10 | 273 |
| 8/4/10 | 273 |
| 8/4/10 | 274 |
| 8/4/10 | 274 |
| 8/4/10 | 275 |
| 8/4/10 | 275 |
| 8/4/10 | 275 |
| 8/4/10 | 275 |
| 8/4/10 | 275 |
| 8/4/10 | 276 |
| 8/4/10 | 275 |
| 8/4/10 | 273 |
| 8/4/10 | 273 |
| 8/4/10 | 274 |
| 8/4/10 | 275 |
| 8/4/10 | 276 |
| 8/4/10 | 276 |
| 8/4/10 | 277 |
| 8/4/10 | 277 |
| 8/4/10 | 277 |
| 8/4/10 | 277 |
| 8/4/10 | 275 |
| 8/4/10 | 275 |
| 8/4/10 | 276 |
| 8/4/10 | 276 |
| 8/4/10 | 277 |
| 8/4/10 | 278 |
| 8/4/10 | 278 |
| 8/4/10 | 276 |
| 8/4/10 | 276 |
| 8/4/10 | 274 |
| 8/4/10 | 276 |
| 8/4/10 | 274 |
| 8/4/10 | 274 |
| 8/4/10 | 274 |
| 8/4/10 | 274 |
| 8/4/10 | 274 |
| 8/4/10 | 274 |
| 8/4/10 | 275 |
| 8/4/10 | 275 |
| 8/4/10 | 274 |
| 8/4/10 | 275 |
| 8/4/10 | 275 |
| 8/4/10 | 274 |
| 8/5/10 | 275 |
| 8/5/10 | 275 |
| 8/5/10 | 275 |
| 8/5/10 | 274 |
| 8/5/10 | 274 |
| 8/5/10 | 273 |
| 8/5/10 | 273 |
| 8/5/10 | 273 |
| 8/5/10 | 273 |
| 8/5/10 | 273 |
| 8/5/10 | 273 |
| 8/5/10 | 273 |
| 8/5/10 | 273 |
| 8/5/10 | 273 |
| 8/5/10 | 272 |
| 8/5/10 | 272 |
| 8/5/10 | 272 |
| 8/5/10 | 273 |
| 8/5/10 | 273 |
| 8/5/10 | 276 |
| 8/5/10 | 272 |
| 8/5/10 | 272 |
| 8/5/10 | 275 |
| 8/5/10 | 273 |
| 8/5/10 | 275 |
| 8/5/10 | 275 |
| 8/5/10 | 275 |
| 8/5/10 | 275 |
| 8/5/10 | 275 |
| 8/5/10 | 276 |
| 8/5/10 | 276 |
| 8/5/10 | 274 |
| 8/5/10 | 274 |
| 8/5/10 | 274 |
| 8/5/10 | 274 |
| 8/5/10 | 274 |
| 8/5/10 | 275 |
| 8/5/10 | 274 |
| 8/5/10 | 275 |
| 8/5/10 | 276 |
| 8/5/10 | 276 |
| 8/5/10 | 276 |
| 8/5/10 | 275 |
| 8/5/10 | 274 |
| 8/5/10 | 274 |
| 8/5/10 | 274 |
| 8/5/10 | 275 |
| 8/5/10 | 275 |
| 8/6/10 | 275 |
| 8/6/10 | 275 |
| 8/6/10 | 273 |
| 8/6/10 | 273 |
| 8/6/10 | 272 |
| 8/6/10 | 273 |
| 8/6/10 | 273 |
| 8/6/10 | 273 |
| 8/6/10 | 273 |
| 8/6/10 | 274 |
| 8/6/10 | 274 |
| 8/6/10 | 274 |
| 8/6/10 | 274 |
| 8/6/10 | 274 |
| 8/6/10 | 275 |
| 8/6/10 | 275 |
| 8/6/10 | 275 |
| 8/6/10 | 275 |
| 8/6/10 | 274 |
| 8/6/10 | 275 |
| 8/6/10 | 275 |
| 8/6/10 | 275 |
| 8/6/10 | 275 |
| 8/6/10 | 274 |
| 8/6/10 | 275 |
| 8/6/10 | 276 |
| 8/6/10 | 274 |
| 8/6/10 | 276 |
| 8/6/10 | 275 |
| 8/6/10 | 273 |
| 8/6/10 | 275 |
| 8/6/10 | 274 |
| 8/6/10 | 274 |
| 8/6/10 | 276 |
| 8/6/10 | 276 |
| 8/6/10 | 274 |
| 8/6/10 | 273 |
| 8/6/10 | 273 |
| 8/6/10 | 272 |
| 8/6/10 | 272 |
| 8/6/10 | 272 |
| 8/6/10 | 273 |
| 8/6/10 | 272 |
| 8/6/10 | 272 |
| 8/6/10 | 272 |
| 8/6/10 | 272 |
| 8/6/10 | 272 |
| 8/6/10 | 272 |
| 8/7/10 | 272 |
| 8/7/10 | 272 |
| 8/7/10 | 273 |
| 8/7/10 | 273 |
| 8/7/10 | 273 |
| 8/7/10 | 273 |
| 8/7/10 | 273 |
| 8/7/10 | 274 |
| 8/7/10 | 273 |
| 8/7/10 | 274 |
| 8/7/10 | 274 |
| 8/7/10 | 274 |
| 8/7/10 | 274 |
| 8/7/10 | 273 |
| 8/7/10 | 274 |
| 8/7/10 | 274 |
| 8/7/10 | 274 |
| 8/7/10 | 274 |
| 8/7/10 | 274 |
| 8/7/10 | 274 |
| 8/7/10 | 274 |
| 8/7/10 | 272 |
| 8/7/10 | 274 |
| 8/7/10 | 276 |
| 8/7/10 | 275 |
| 8/7/10 | 273 |
| 8/7/10 | 275 |
| 8/7/10 | 273 |
| 8/7/10 | 275 |
| 8/7/10 | 273 |
| 8/7/10 | 274 |
| 8/7/10 | 275 |
| 8/7/10 | 276 |
| 8/7/10 | 275 |
| 8/7/10 | 275 |
| 8/7/10 | 274 |
| 8/7/10 | 273 |
| 8/7/10 | 272 |
| 8/7/10 | 272 |
| 8/7/10 | 271 |
| 8/7/10 | 272 |
| 8/7/10 | 273 |
| 8/7/10 | 273 |
| 8/7/10 | 272 |
| 8/7/10 | 271 |
| 8/7/10 | 271 |
| 8/7/10 | 270 |
| 8/7/10 | 271 |
| 8/8/10 | 271 |
| 8/8/10 | 271 |
| 8/8/10 | 272 |
| 8/8/10 | 272 |
| 8/8/10 | 271 |
| 8/8/10 | 270 |
| 8/8/10 | 270 |
| 8/8/10 | 270 |
| 8/8/10 | 270 |
| 8/8/10 | 270 |
| 8/8/10 | 270 |
| 8/8/10 | 271 |
| 8/8/10 | 272 |
| 8/8/10 | 272 |
| 8/8/10 | 272 |
| 8/8/10 | 271 |
| 8/8/10 | 272 |
| 8/8/10 | 272 |
| 8/8/10 | 272 |
| 8/8/10 | 272 |
| 8/8/10 | 273 |
| 8/8/10 | 273 |
| 8/8/10 | 273 |
| 8/8/10 | 274 |
| 8/8/10 | 272 |
| 8/8/10 | 274 |
| 8/8/10 | 274 |
| 8/8/10 | 272 |
| 8/8/10 | 274 |
| 8/8/10 | 275 |
| 8/8/10 | 275 |
| 8/8/10 | 275 |
| 8/8/10 | 275 |
| 8/8/10 | 272 |
| 8/8/10 | 273 |
| 8/8/10 | 271 |
| 8/8/10 | 271 |
| 8/8/10 | 270 |
| 8/8/10 | 269 |
| 8/8/10 | 270 |
| 8/8/10 | 271 |
| 8/8/10 | 270 |
| 8/8/10 | 270 |
| 8/8/10 | 269 |
| 8/8/10 | 269 |
| 8/8/10 | 268 |
| 8/8/10 | 268 |
| 8/8/10 | 268 |
| 8/9/10 | 268 |
| 8/9/10 | 268 |
| 8/9/10 | 268 |
| 8/9/10 | 268 |
| 8/9/10 | 268 |
| 8/9/10 | 268 |
| 8/9/10 | 267 |
| 8/9/10 | 267 |
| 8/9/10 | 267 |
| 8/9/10 | 266 |
| 8/9/10 | 266 |
| 8/9/10 | 267 |
| 8/9/10 | 266 |
| 8/9/10 | 267 |
| 8/9/10 | 267 |
| 8/9/10 | 267 |
| 8/9/10 | 268 |
| 8/9/10 | 267 |
| 8/9/10 | 268 |
| 8/9/10 | 269 |
| 8/9/10 | 269 |
| 8/9/10 | 268 |
| 8/9/10 | 270 |
| 8/9/10 | 271 |
| 8/9/10 | 271 |
| 8/9/10 | 270 |
| 8/9/10 | 270 |
| 8/9/10 | 271 |
| 8/9/10 | 271 |
| 8/9/10 | 271 |
| 8/9/10 | 271 |
| 8/9/10 | 270 |
| 8/9/10 | 271 |
| 8/9/10 | 270 |
| 8/9/10 | 269 |
| 8/9/10 | 267 |
| 8/9/10 | 269 |
| 8/9/10 | 267 |
| 8/9/10 | 267 |
| 8/9/10 | 269 |
| 8/9/10 | 267 |
| 8/9/10 | 266 |
| 8/9/10 | 265 |
| 8/9/10 | 264 |
| 8/9/10 | 264 |
| 8/9/10 | 263 |
| 8/9/10 | 264 |
| 8/9/10 | 264 |
| 8/10/10 | 264 |
| 8/10/10 | 264 |
| 8/10/10 | 264 |
| 8/10/10 | 264 |
| 8/10/10 | 264 |
| 8/10/10 | 262 |
| 8/10/10 | 261 |
| 8/10/10 | 261 |
| 8/10/10 | 261 |
| 8/10/10 | 261 |
| 8/10/10 | 262 |
| 8/10/10 | 262 |
| 8/10/10 | 262 |
| 8/10/10 | 262 |
| 8/10/10 | 262 |
| 8/10/10 | 262 |
| 8/10/10 | 263 |
| 8/10/10 | 262 |
| 8/10/10 | 263 |
| 8/10/10 | 263 |
| 8/10/10 | 263 |
| 8/10/10 | 264 |
| 8/10/10 | 264 |
| 8/10/10 | 264 |
| 8/10/10 | 264 |
| 8/10/10 | 264 |
| 8/10/10 | 264 |
| 8/10/10 | 265 |
| 8/10/10 | 265 |
| 8/10/10 | 265 |
| 8/10/10 | 264 |
| 8/10/10 | 263 |
| 8/10/10 | 265 |
| 8/10/10 | 262 |
| 8/10/10 | 262 |
| 8/10/10 | 264 |
| 8/10/10 | 266 |
| 8/10/10 | 267 |
| 8/10/10 | 262 |
| 8/10/10 | 263 |
| 8/10/10 | 264 |
| 8/10/10 | 264 |
| 8/10/10 | 263 |
| 8/10/10 | 263 |
| 8/10/10 | 261 |
| 8/10/10 | 260 |
| 8/10/10 | 259 |
| 8/10/10 | 260 |
| 8/11/10 | 260 |
| 8/11/10 | 259 |
| 8/11/10 | 259 |
| 8/11/10 | 259 |
| 8/11/10 | 259 |
| 8/11/10 | 259 |
| 8/11/10 | 259 |
| 8/11/10 | 259 |
| 8/11/10 | 259 |
| 8/11/10 | 259 |
| 8/11/10 | 259 |
| 8/11/10 | 259 |
| 8/11/10 | 259 |
| 8/11/10 | 257 |
| 8/11/10 | 257 |
| 8/11/10 | 257 |
| 8/11/10 | 257 |
| 8/11/10 | 257 |
| 8/11/10 | 258 |
| 8/11/10 | 258 |
| 8/11/10 | 258 |
| 8/11/10 | 260 |
| 8/11/10 | 261 |
| 8/11/10 | 261 |
| 8/11/10 | 261 |
| 8/11/10 | 262 |
| 8/11/10 | 262 |
| 8/11/10 | 262 |
| 8/11/10 | 262 |
| 8/11/10 | 262 |
| 8/11/10 | 262 |
| 8/11/10 | 263 |
| 8/11/10 | 263 |
| 8/11/10 | 261 |
| 8/11/10 | 263 |
| 8/11/10 | 260 |
| 8/11/10 | 260 |
| 8/11/10 | 259 |
| 8/11/10 | 259 |
| 8/11/10 | 259 |
| 8/11/10 | 259 |
| 8/11/10 | 258 |
| 8/11/10 | 259 |
| 8/11/10 | 258 |
| 8/11/10 | 257 |
| 8/11/10 | 257 |
| 8/11/10 | 256 |
| 8/11/10 | 256 |
| 8/12/10 | 256 |
| 8/12/10 | 255 |
| 8/12/10 | 256 |
| 8/12/10 | 255 |
| 8/12/10 | 255 |
| 8/12/10 | 256 |
| 8/12/10 | 255 |
| 8/12/10 | 252 |
| 8/12/10 | 252 |
| 8/12/10 | 251 |
| 8/12/10 | 253 |
| 8/12/10 | 253 |
| 8/12/10 | 252 |
| 8/12/10 | 254 |
| 8/12/10 | 253 |
| 8/12/10 | 253 |
| 8/12/10 | 253 |
| 8/12/10 | 252 |
| 8/12/10 | 253 |
| 8/12/10 | 253 |
| 8/12/10 | 254 |
| 8/12/10 | 254 |
| 8/12/10 | 254 |
| 8/12/10 | 254 |
| 8/12/10 | 254 |
| 8/12/10 | 254 |
| 8/12/10 | 254 |
| 8/12/10 | 254 |
| 8/12/10 | 253 |
| 8/12/10 | 254 |
| 8/12/10 | 254 |
| 8/12/10 | 254 |
| 8/12/10 | 252 |
| 8/12/10 | 251 |
| 8/12/10 | 250 |
| 8/12/10 | 251 |
| 8/12/10 | 251 |
| 8/12/10 | 252 |
| 8/12/10 | 252 |
| 8/12/10 | 252 |
| 8/12/10 | 251 |
| 8/12/10 | 252 |
| 8/12/10 | 252 |
| 8/12/10 | 253 |
| 8/12/10 | 252 |
| 8/12/10 | 252 |
| 8/12/10 | 252 |
| 8/12/10 | 252 |
| 8/13/10 | 252 |
| 8/13/10 | 250 |
| 8/13/10 | 251 |
| 8/13/10 | 251 |
| 8/13/10 | 251 |
| 8/13/10 | 251 |
| 8/13/10 | 251 |
| 8/13/10 | 251 |
| 8/13/10 | 252 |
| 8/13/10 | 252 |
| 8/13/10 | 252 |
| 8/13/10 | 253 |
| 8/13/10 | 253 |
| 8/13/10 | 253 |
| 8/13/10 | 253 |
| 8/13/10 | 254 |
| 8/13/10 | 254 |
| 8/13/10 | 254 |
| 8/13/10 | 255 |
| 8/13/10 | 255 |
| 8/13/10 | 255 |
| 8/13/10 | 255 |
| 8/13/10 | 255 |
| 8/13/10 | 255 |
| 8/13/10 | 254 |
| 8/13/10 | 254 |
| 8/13/10 | 254 |
| 8/13/10 | 254 |
| 8/13/10 | 254 |
| 8/13/10 | 254 |
| 8/13/10 | 254 |
| 8/13/10 | 254 |
| 8/13/10 | 254 |
| 8/13/10 | 254 |
| 8/13/10 | 254 |
| 8/13/10 | 254 |
| 8/13/10 | 254 |
| 8/13/10 | 254 |
| 8/13/10 | 254 |
| 8/13/10 | 254 |
| 8/13/10 | 254 |
| 8/13/10 | 254 |
| 8/13/10 | 254 |
| 8/13/10 | 254 |
| 8/13/10 | 255 |
| 8/13/10 | 256 |
| 8/13/10 | 256 |
| 8/13/10 | 256 |
| 8/14/10 | 256 |
| 8/14/10 | 256 |
| 8/14/10 | 256 |
| 8/14/10 | 256 |
| 8/14/10 | 257 |
| 8/14/10 | 257 |
| 8/14/10 | 257 |
| 8/14/10 | 257 |
| 8/14/10 | 258 |
| 8/14/10 | 258 |
| 8/14/10 | 258 |
| 8/14/10 | 258 |
| 8/14/10 | 258 |
| 8/14/10 | 259 |
| 8/14/10 | 259 |
| 8/14/10 | 259 |
| 8/14/10 | 259 |
| 8/14/10 | 259 |
| 8/14/10 | 259 |
| 8/14/10 | 259 |
| 8/14/10 | 259 |
| 8/14/10 | 258 |
| 8/14/10 | 258 |
| 8/14/10 | 258 |
| 8/14/10 | 258 |
| 8/14/10 | 258 |
| 8/14/10 | 258 |
| 8/14/10 | 260 |
| 8/14/10 | 259 |
| 8/14/10 | 257 |
| 8/14/10 | 257 |
| 8/14/10 | 258 |
| 8/14/10 | 258 |
| 8/14/10 | 260 |
| 8/14/10 | 258 |
| 8/14/10 | 257 |
| 8/14/10 | 257 |
| 8/14/10 | 257 |
| 8/14/10 | 257 |
| 8/14/10 | 257 |
| 8/14/10 | 257 |
| 8/14/10 | 257 |
| 8/14/10 | 257 |
| 8/14/10 | 257 |
| 8/14/10 | 257 |
| 8/14/10 | 258 |
| 8/14/10 | 257 |
| 8/14/10 | 257 |
| 8/15/10 | 256 |
| 8/15/10 | 255 |
| 8/15/10 | 255 |
| 8/15/10 | 255 |
| 8/15/10 | 255 |
| 8/15/10 | 255 |
| 8/15/10 | 257 |
| 8/15/10 | 257 |
| 8/15/10 | 257 |
| 8/15/10 | 257 |
| 8/15/10 | 256 |
| 8/15/10 | 255 |
| 8/15/10 | 256 |
| 8/15/10 | 256 |
| 8/15/10 | 256 |
| 8/15/10 | 256 |
| 8/15/10 | 256 |
| 8/15/10 | 256 |
| 8/15/10 | 256 |
| 8/15/10 | 257 |
| 8/15/10 | 257 |
| 8/15/10 | 257 |
| 8/15/10 | 257 |
| 8/15/10 | 257 |
| 8/15/10 | 258 |
| 8/15/10 | 258 |
| 8/15/10 | 258 |
| 8/15/10 | 258 |
| 8/15/10 | 258 |
| 8/15/10 | 258 |
| 8/15/10 | 257 |
| 8/15/10 | 257 |
| 8/15/10 | 258 |
| 8/15/10 | 257 |
| 8/15/10 | 258 |
| 8/15/10 | 258 |
| 8/15/10 | 257 |
| 8/15/10 | 257 |
| 8/15/10 | 258 |
| 8/15/10 | 258 |
| 8/15/10 | 258 |
| 8/15/10 | 257 |
| 8/15/10 | 256 |
| 8/15/10 | 256 |
| 8/15/10 | 255 |
| 8/15/10 | 255 |
| 8/15/10 | 255 |
| 8/15/10 | 256 |
| 8/16/10 | 256 |
| 8/16/10 | 255 |
| 8/16/10 | 256 |
| 8/16/10 | 256 |
| 8/16/10 | 256 |
| 8/16/10 | 255 |
| 8/16/10 | 254 |
| 8/16/10 | 254 |
| 8/16/10 | 254 |
| 8/16/10 | 254 |
| 8/16/10 | 254 |
| 8/16/10 | 254 |
| 8/16/10 | 254 |
| 8/16/10 | 254 |
| 8/16/10 | 255 |
| 8/16/10 | 255 |
| 8/16/10 | 255 |
| 8/16/10 | 255 |
| 8/16/10 | 255 |
| 8/16/10 | 255 |
| 8/16/10 | 255 |
| 8/16/10 | 255 |
| 8/16/10 | 255 |
| 8/16/10 | 255 |
| 8/16/10 | 255 |
| 8/16/10 | 255 |
| 8/16/10 | 255 |
| 8/16/10 | 256 |
| 8/16/10 | 256 |
| 8/16/10 | 256 |
| 8/16/10 | 256 |
| 8/16/10 | 257 |
| 8/16/10 | 256 |
| 8/16/10 | 257 |
| 8/16/10 | 257 |
| 8/16/10 | 257 |
| 8/16/10 | 257 |
| 8/16/10 | 256 |
| 8/16/10 | 257 |
| 8/16/10 | 256 |
| 8/16/10 | 252 |
| 8/16/10 | 251 |
| 8/16/10 | 252 |
| 8/16/10 | 252 |
| 8/16/10 | 251 |
| 8/16/10 | 251 |
| 8/16/10 | 251 |
| 8/16/10 | 251 |
| 8/17/10 | 251 |
| 8/17/10 | 251 |
| 8/17/10 | 251 |
| 8/17/10 | 251 |
| 8/17/10 | 252 |
| 8/17/10 | 252 |
| 8/17/10 | 252 |
| 8/17/10 | 252 |
| 8/17/10 | 252 |
| 8/17/10 | 253 |
| 8/17/10 | 253 |
| 8/17/10 | 253 |
| 8/17/10 | 254 |
| 8/17/10 | 254 |
| 8/17/10 | 253 |
| 8/17/10 | 254 |
| 8/17/10 | 255 |
| 8/17/10 | 255 |
| 8/17/10 | 255 |
| 8/17/10 | 255 |
| 8/17/10 | 255 |
| 8/17/10 | 255 |
| 8/17/10 | 255 |
| 8/17/10 | 255 |
| 8/17/10 | 255 |
| 8/17/10 | 256 |
| 8/17/10 | 254 |
| 8/17/10 | 254 |
| 8/17/10 | 254 |
| 8/17/10 | 254 |
| 8/17/10 | 254 |
| 8/17/10 | 255 |
| 8/17/10 | 254 |
| 8/17/10 | 255 |
| 8/17/10 | 256 |
| 8/17/10 | 255 |
| 8/17/10 | 254 |
| 8/17/10 | 253 |
| 8/17/10 | 252 |
| 8/17/10 | 252 |
| 8/17/10 | 251 |
| 8/17/10 | 251 |
| 8/17/10 | 252 |
| 8/17/10 | 252 |
| 8/17/10 | 251 |
| 8/17/10 | 251 |
| 8/17/10 | 251 |
| 8/17/10 | 251 |
| 8/18/10 | 251 |
| 8/18/10 | 251 |
| 8/18/10 | 252 |
| 8/18/10 | 252 |
| 8/18/10 | 253 |
| 8/18/10 | 253 |
| 8/18/10 | 253 |
| 8/18/10 | 253 |
| 8/18/10 | 254 |
| 8/18/10 | 254 |
| 8/18/10 | 254 |
| 8/18/10 | 253 |
| 8/18/10 | 254 |
| 8/18/10 | 256 |
| 8/18/10 | 255 |
| 8/18/10 | 257 |
| 8/18/10 | 257 |
| 8/18/10 | 257 |
| 8/18/10 | 257 |
| 8/18/10 | 257 |
| 8/18/10 | 257 |
| 8/18/10 | 255 |
| 8/18/10 | 256 |
| 8/18/10 | 256 |
| 8/18/10 | 256 |
| 8/18/10 | 256 |
| 8/18/10 | 257 |
| 8/18/10 | 258 |
| 8/18/10 | 257 |
| 8/18/10 | 258 |
| 8/18/10 | 257 |
| 8/18/10 | 258 |
| 8/18/10 | 259 |
| 8/18/10 | 257 |
| 8/18/10 | 258 |
| 8/18/10 | 258 |
| 8/18/10 | 255 |
| 8/18/10 | 255 |
| 8/18/10 | 255 |
| 8/18/10 | 254 |
| 8/18/10 | 254 |
| 8/18/10 | 255 |
| 8/18/10 | 254 |
| 8/18/10 | 254 |
| 8/18/10 | 254 |
| 8/18/10 | 254 |
| 8/18/10 | 254 |
| 8/18/10 | 254 |
| 8/19/10 | 254 |
| 8/19/10 | 254 |
| 8/19/10 | 254 |
| 8/19/10 | 254 |
| 8/19/10 | 254 |
| 8/19/10 | 254 |
| 8/19/10 | 254 |
| 8/19/10 | 254 |
| 8/19/10 | 255 |
| 8/19/10 | 255 |
| 8/19/10 | 255 |
| 8/19/10 | 254 |
| 8/19/10 | 256 |
| 8/19/10 | 255 |
| 8/19/10 | 256 |
| 8/19/10 | 256 |
| 8/19/10 | 256 |
| 8/19/10 | 256 |
| 8/19/10 | 256 |
| 8/19/10 | 256 |
| 8/19/10 | 257 |
| 8/19/10 | 257 |
| 8/19/10 | 257 |
| 8/19/10 | 258 |
| 8/19/10 | 256 |
| 8/19/10 | 256 |
| 8/19/10 | 257 |
| 8/19/10 | 256 |
| 8/19/10 | 256 |
| 8/19/10 | 255 |
| 8/19/10 | 256 |
| 8/19/10 | 256 |
| 8/19/10 | 257 |
| 8/19/10 | 255 |
| 8/19/10 | 257 |
| 8/19/10 | 256 |
| 8/19/10 | 254 |
| 8/19/10 | 255 |
| 8/19/10 | 254 |
| 8/19/10 | 254 |
| 8/19/10 | 253 |
| 8/19/10 | 254 |
| 8/19/10 | 253 |
| 8/19/10 | 253 |
| 8/19/10 | 253 |
| 8/19/10 | 253 |
| 8/19/10 | 253 |
| 8/19/10 | 253 |
| 8/20/10 | 254 |
| 8/20/10 | 254 |
| 8/20/10 | 254 |
| 8/20/10 | 254 |
| 8/20/10 | 254 |
| 8/20/10 | 254 |
| 8/20/10 | 253 |
| 8/20/10 | 251 |
| 8/20/10 | 253 |
| 8/20/10 | 251 |
| 8/20/10 | 252 |
| 8/20/10 | 252 |
| 8/20/10 | 253 |
| 8/20/10 | 253 |
| 8/20/10 | 254 |
| 8/20/10 | 253 |
| 8/20/10 | 255 |
| 8/20/10 | 253 |
| 8/20/10 | 256 |
| 8/20/10 | 252 |
| 8/20/10 | 252 |
| 8/20/10 | 252 |
| 8/20/10 | 253 |
| 8/20/10 | 253 |
| 8/20/10 | 254 |
| 8/20/10 | 250 |
| 8/20/10 | 253 |
| 8/20/10 | 252 |
| 8/20/10 | 254 |
| 8/20/10 | 253 |
| 8/20/10 | 253 |
| 8/20/10 | 253 |
| 8/20/10 | 253 |
| 8/20/10 | 253 |
| 8/20/10 | 252 |
| 8/20/10 | 253 |
| 8/20/10 | 250 |
| 8/20/10 | 253 |
| 8/20/10 | 245 |
| 8/20/10 | 243 |
| 8/20/10 | 243 |
| 8/20/10 | 243 |
| 8/20/10 | 244 |
| 8/20/10 | 244 |
| 8/20/10 | 242 |
| 8/20/10 | 242 |
| 8/20/10 | 243 |
| 8/20/10 | 245 |
| 8/21/10 | 244 |
| 8/21/10 | 245 |
| 8/21/10 | 245 |
| 8/21/10 | 244 |
| 8/21/10 | 243 |
| 8/21/10 | 242 |
| 8/21/10 | 242 |
| 8/21/10 | 242 |
| 8/21/10 | 242 |
| 8/21/10 | 244 |
| 8/21/10 | 243 |
| 8/21/10 | 243 |
| 8/21/10 | 243 |
| 8/21/10 | 244 |
| 8/21/10 | 245 |
| 8/21/10 | 246 |
| 8/21/10 | 246 |
| 8/21/10 | 246 |
| 8/21/10 | 245 |
| 8/21/10 | 245 |
| 8/21/10 | 246 |
| 8/21/10 | 247 |
| 8/21/10 | 247 |
| 8/21/10 | 247 |
| 8/21/10 | 247 |
| 8/21/10 | 245 |
| 8/21/10 | 245 |
| 8/21/10 | 247 |
| 8/21/10 | 247 |
| 8/21/10 | 245 |
| 8/21/10 | 246 |
| 8/21/10 | 245 |
| 8/21/10 | 246 |
| 8/21/10 | 246 |
| 8/21/10 | 245 |
| 8/21/10 | 246 |
| 8/21/10 | 246 |
| 8/21/10 | 246 |
| 8/21/10 | 244 |
| 8/21/10 | 244 |
| 8/21/10 | 245 |
| 8/21/10 | 243 |
| 8/21/10 | 246 |
| 8/21/10 | 246 |
| 8/21/10 | 246 |
| 8/21/10 | 246 |
| 8/21/10 | 245 |
| 8/21/10 | 244 |
| 8/22/10 | 245 |
| 8/22/10 | 249 |
| 8/22/10 | 248 |
| 8/22/10 | 249 |
| 8/22/10 | 248 |
| 8/22/10 | 245 |
| 8/22/10 | 248 |
| 8/22/10 | 249 |
| 8/22/10 | 248 |
| 8/22/10 | 248 |
| 8/22/10 | 249 |
| 8/22/10 | 248 |
| 8/22/10 | 249 |
| 8/22/10 | 252 |
| 8/22/10 | 251 |
| 8/22/10 | 251 |
| 8/22/10 | 252 |
| 8/22/10 | 253 |
| 8/22/10 | 253 |
| 8/22/10 | 252 |
| 8/22/10 | 253 |
| 8/22/10 | 252 |
| 8/22/10 | 252 |
| 8/22/10 | 252 |
| 8/22/10 | 252 |
| 8/22/10 | 251 |
| 8/22/10 | 250 |
| 8/22/10 | 250 |
| 8/22/10 | 251 |
| 8/22/10 | 251 |
| 8/22/10 | 251 |
| 8/22/10 | 251 |
| 8/22/10 | 252 |
| 8/22/10 | 253 |
| 8/22/10 | 253 |
| 8/22/10 | 253 |
| 8/22/10 | 253 |
| 8/22/10 | 254 |
| 8/22/10 | 254 |
| 8/22/10 | 254 |
| 8/22/10 | 254 |
| 8/22/10 | 255 |
| 8/22/10 | 255 |
| 8/22/10 | 253 |
| 8/22/10 | 253 |
| 8/22/10 | 252 |
| 8/22/10 | 252 |
| 8/22/10 | 252 |
| 8/23/10 | 252 |
| 8/23/10 | 252 |
| 8/23/10 | 253 |
| 8/23/10 | 253 |
| 8/23/10 | 253 |
| 8/23/10 | 253 |
| 8/23/10 | 254 |
| 8/23/10 | 254 |
| 8/23/10 | 254 |
| 8/23/10 | 255 |
| 8/23/10 | 255 |
| 8/23/10 | 255 |
| 8/23/10 | 255 |
| 8/23/10 | 255 |
| 8/23/10 | 256 |
| 8/23/10 | 256 |
| 8/23/10 | 256 |
| 8/23/10 | 256 |
| 8/23/10 | 256 |
| 8/23/10 | 256 |
| 8/23/10 | 256 |
| 8/23/10 | 256 |
| 8/23/10 | 256 |
| 8/23/10 | 256 |
| 8/23/10 | 256 |
| 8/23/10 | 256 |
| 8/23/10 | 256 |
| 8/23/10 | 256 |
| 8/23/10 | 256 |
| 8/23/10 | 256 |
| 8/23/10 | 255 |
| 8/23/10 | 255 |
| 8/23/10 | 256 |
| 8/23/10 | 255 |
| 8/23/10 | 255 |
| 8/23/10 | 254 |
| 8/23/10 | 255 |
| 8/23/10 | 254 |
| 8/23/10 | 254 |
| 8/23/10 | 255 |
| 8/23/10 | 255 |
| 8/23/10 | 255 |
| 8/23/10 | 254 |
| 8/23/10 | 254 |
| 8/23/10 | 255 |
| 8/23/10 | 255 |
| 8/23/10 | 255 |
| 8/23/10 | 256 |
| 8/24/10 | 256 |
| 8/24/10 | 257 |
| 8/24/10 | 257 |
| 8/24/10 | 258 |
| 8/24/10 | 258 |
| 8/24/10 | 258 |
| 8/24/10 | 259 |
| 8/24/10 | 259 |
| 8/24/10 | 259 |
| 8/24/10 | 259 |
| 8/24/10 | 259 |
| 8/24/10 | 259 |
| 8/24/10 | 259 |
| 8/24/10 | 260 |
| 8/24/10 | 259 |
| 8/24/10 | 259 |
| 8/24/10 | 259 |
| 8/24/10 | 259 |
| 8/24/10 | 260 |
| 8/24/10 | 260 |
| 8/24/10 | 260 |
| 8/24/10 | 260 |
| 8/24/10 | 260 |
| 8/24/10 | 260 |
| 8/24/10 | 259 |
| 8/24/10 | 259 |
| 8/24/10 | 261 |
| 8/24/10 | 260 |
| 8/24/10 | 260 |
| 8/24/10 | 260 |
| 8/24/10 | 260 |
| 8/24/10 | 260 |
| 8/24/10 | 260 |
| 8/24/10 | 260 |
| 8/24/10 | 260 |
| 8/24/10 | 260 |
| 8/24/10 | 260 |
| 8/24/10 | 260 |
| 8/24/10 | 260 |
| 8/24/10 | 261 |
| 8/24/10 | 260 |
| 8/24/10 | 260 |
| 8/24/10 | 260 |
| 8/24/10 | 260 |
| 8/24/10 | 260 |
| 8/24/10 | 260 |
| 8/24/10 | 260 |
| 8/24/10 | 260 |
| 8/25/10 | 260 |
| 8/25/10 | 261 |
| 8/25/10 | 261 |
| 8/25/10 | 261 |
| 8/25/10 | 260 |
| 8/25/10 | 261 |
| 8/25/10 | 261 |
| 8/25/10 | 261 |
| 8/25/10 | 261 |
| 8/25/10 | 261 |
| 8/25/10 | 261 |
| 8/25/10 | 261 |
| 8/25/10 | 261 |
| 8/25/10 | 261 |
| 8/25/10 | 261 |
| 8/25/10 | 261 |
| 8/25/10 | 261 |
| 8/25/10 | 261 |
| 8/25/10 | 261 |
| 8/25/10 | 261 |
| 8/25/10 | 261 |
| 8/25/10 | 261 |
| 8/25/10 | 262 |
| 8/25/10 | 262 |
| 8/25/10 | 263 |
| 8/25/10 | 261 |
| 8/25/10 | 261 |
| 8/25/10 | 261 |
| 8/25/10 | 260 |
| 8/25/10 | 260 |
| 8/25/10 | 261 |
| 8/25/10 | 261 |
| 8/25/10 | 261 |
| 8/25/10 | 261 |
| 8/25/10 | 262 |
| 8/25/10 | 262 |
| 8/25/10 | 261 |
| 8/25/10 | 260 |
| 8/25/10 | 261 |
| 8/25/10 | 260 |
| 8/25/10 | 260 |
| 8/25/10 | 260 |
| 8/25/10 | 260 |
| 8/25/10 | 260 |
| 8/25/10 | 260 |
| 8/25/10 | 260 |
| 8/25/10 | 260 |
| 8/25/10 | 261 |
| 8/26/10 | 261 |
| 8/26/10 | 260 |
| 8/26/10 | 260 |
| 8/26/10 | 260 |
| 8/26/10 | 260 |
| 8/26/10 | 260 |
| 8/26/10 | 261 |
| 8/26/10 | 261 |
| 8/26/10 | 261 |
| 8/26/10 | 261 |
| 8/26/10 | 261 |
| 8/26/10 | 262 |
| 8/26/10 | 262 |
| 8/26/10 | 262 |
| 8/26/10 | 262 |
| 8/26/10 | 262 |
| 8/26/10 | 263 |
| 8/26/10 | 262 |
| 8/26/10 | 246 |
| 8/26/10 | 247 |
| 8/26/10 | 248 |
| 8/26/10 | 248 |
| 8/26/10 | 249 |
| 8/26/10 | 250 |
| 8/26/10 | 250 |
| 8/26/10 | 250 |
| 8/26/10 | 251 |
| 8/26/10 | 251 |
| 8/26/10 | 251 |
| 8/26/10 | 251 |
| 8/26/10 | 252 |
| 8/26/10 | 253 |
| 8/26/10 | 253 |
| 8/26/10 | 254 |
| 8/26/10 | 254 |
| 8/26/10 | 254 |
| 8/26/10 | 255 |
| 8/26/10 | 255 |
| 8/26/10 | 255 |
| 8/26/10 | 256 |
| 8/26/10 | 255 |
| 8/26/10 | 256 |
| 8/26/10 | 256 |
| 8/26/10 | 256 |
| 8/26/10 | 256 |
| 8/26/10 | 256 |
| 8/26/10 | 256 |
| 8/26/10 | 256 |
| 8/27/10 | 256 |
| 8/27/10 | 257 |
| 8/27/10 | 257 |
| 8/27/10 | 257 |
| 8/27/10 | 257 |
| 8/27/10 | 257 |
| 8/27/10 | 260 |
| 8/27/10 | 260 |
| 8/27/10 | 260 |
| 8/27/10 | 261 |
| 8/27/10 | 262 |
| 8/27/10 | 262 |
| 8/27/10 | 262 |
| 8/27/10 | 262 |
| 8/27/10 | 262 |
| 8/27/10 | 261 |
| 8/27/10 | 261 |
| 8/27/10 | 261 |
| 8/27/10 | 261 |
| 8/27/10 | 261 |
| 8/27/10 | 260 |
| 8/27/10 | 259 |
| 8/27/10 | 259 |
| 8/27/10 | 259 |
| 8/27/10 | 259 |
| 8/27/10 | 263 |
| 8/27/10 | 263 |
| 8/27/10 | 264 |
| 8/27/10 | 264 |
| 8/27/10 | 264 |
| 8/27/10 | 264 |
| 8/27/10 | 262 |
| 8/27/10 | 263 |
| 8/27/10 | 264 |
| 8/27/10 | 264 |
| 8/27/10 | 265 |
| 8/27/10 | 264 |
| 8/27/10 | 262 |
| 8/27/10 | 263 |
| 8/27/10 | 263 |
| 8/27/10 | 262 |
| 8/27/10 | 261 |
| 8/27/10 | 261 |
| 8/27/10 | 261 |
| 8/27/10 | 261 |
| 8/27/10 | 261 |
| 8/27/10 | 261 |
| 8/27/10 | 262 |
| 8/28/10 | 261 |
| 8/28/10 | 262 |
| 8/28/10 | 262 |
| 8/28/10 | 262 |
| 8/28/10 | 262 |
| 8/28/10 | 262 |
| 8/28/10 | 262 |
| 8/28/10 | 262 |
| 8/28/10 | 263 |
| 8/28/10 | 263 |
| 8/28/10 | 263 |
| 8/28/10 | 264 |
| 8/28/10 | 264 |
| 8/28/10 | 264 |
| 8/28/10 | 264 |
| 8/28/10 | 264 |
| 8/28/10 | 264 |
| 8/28/10 | 264 |
| 8/28/10 | 264 |
| 8/28/10 | 265 |
| 8/28/10 | 265 |
| 8/28/10 | 265 |
| 8/28/10 | 265 |
| 8/28/10 | 265 |
| 8/28/10 | 266 |
| 8/28/10 | 266 |
| 8/28/10 | 266 |
| 8/28/10 | 266 |
| 8/28/10 | 266 |
| 8/28/10 | 266 |
| 8/28/10 | 266 |
| 8/28/10 | 265 |
| 8/28/10 | 266 |
| 8/28/10 | 264 |
| 8/28/10 | 265 |
| 8/28/10 | 264 |
| 8/28/10 | 264 |
| 8/28/10 | 263 |
| 8/28/10 | 263 |
| 8/28/10 | 263 |
| 8/28/10 | 263 |
| 8/28/10 | 263 |
| 8/28/10 | 263 |
| 8/28/10 | 263 |
| 8/28/10 | 262 |
| 8/28/10 | 263 |
| 8/28/10 | 263 |
| 8/28/10 | 263 |
| 8/29/10 | 263 |
| 8/29/10 | 263 |
| 8/29/10 | 263 |
| 8/29/10 | 263 |
| 8/29/10 | 263 |
| 8/29/10 | 263 |
| 8/29/10 | 263 |
| 8/29/10 | 264 |
| 8/29/10 | 264 |
| 8/29/10 | 264 |
| 8/29/10 | 264 |
| 8/29/10 | 264 |
| 8/29/10 | 264 |
| 8/29/10 | 264 |
| 8/29/10 | 264 |
| 8/29/10 | 265 |
| 8/29/10 | 265 |
| 8/29/10 | 265 |
| 8/29/10 | 265 |
| 8/29/10 | 265 |
| 8/29/10 | 266 |
| 8/29/10 | 265 |
| 8/29/10 | 265 |
| 8/29/10 | 266 |
| 8/29/10 | 266 |
| 8/29/10 | 266 |
| 8/29/10 | 266 |
| 8/29/10 | 266 |
| 8/29/10 | 265 |
| 8/29/10 | 266 |
| 8/29/10 | 266 |
| 8/29/10 | 266 |
| 8/29/10 | 265 |
| 8/29/10 | 265 |
| 8/29/10 | 266 |
| 8/29/10 | 266 |
| 8/29/10 | 264 |
| 8/29/10 | 265 |
| 8/29/10 | 263 |
| 8/29/10 | 264 |
| 8/29/10 | 265 |
| 8/29/10 | 265 |
| 8/29/10 | 265 |
| 8/29/10 | 265 |
| 8/29/10 | 264 |
| 8/29/10 | 264 |
| 8/29/10 | 264 |
| 8/29/10 | 264 |
| 8/30/10 | 264 |
| 8/30/10 | 264 |
| 8/30/10 | 264 |
| 8/30/10 | 264 |
| 8/30/10 | 265 |
| 8/30/10 | 265 |
| 8/30/10 | 265 |
| 8/30/10 | 265 |
| 8/30/10 | 265 |
| 8/30/10 | 265 |
| 8/30/10 | 265 |
| 8/30/10 | 265 |
| 8/30/10 | 265 |
| 8/30/10 | 265 |
| 8/30/10 | 265 |
| 8/30/10 | 265 |
| 8/30/10 | 265 |
| 8/30/10 | 265 |
| 8/30/10 | 266 |
| 8/30/10 | 266 |
| 8/30/10 | 266 |
| 8/30/10 | 266 |
| 8/30/10 | 267 |
| 8/30/10 | 267 |
| 8/30/10 | 267 |
| 8/30/10 | 267 |
| 8/30/10 | 267 |
| 8/30/10 | 267 |
| 8/30/10 | 267 |
| 8/30/10 | 267 |
| 8/30/10 | 267 |
| 8/30/10 | 267 |
| 8/30/10 | 267 |
| 8/30/10 | 267 |
| 8/30/10 | 267 |
| 8/30/10 | 267 |
| 8/30/10 | 267 |
| 8/30/10 | 265 |
| 8/30/10 | 265 |
| 8/30/10 | 265 |
| 8/30/10 | 265 |
| 8/30/10 | 266 |
| 8/30/10 | 266 |
| 8/30/10 | 265 |
| 8/30/10 | 265 |
| 8/30/10 | 265 |
| 8/30/10 | 265 |
| 8/30/10 | 265 |
| 8/31/10 | 265 |
| 8/31/10 | 266 |
| 8/31/10 | 265 |
| 8/31/10 | 265 |
| 8/31/10 | 265 |
| 8/31/10 | 265 |
| 8/31/10 | 265 |
| 8/31/10 | 265 |
| 8/31/10 | 266 |
| 8/31/10 | 266 |
| 8/31/10 | 266 |
| 8/31/10 | 266 |
| 8/31/10 | 266 |
| 8/31/10 | 266 |
| 8/31/10 | 266 |
| 8/31/10 | 266 |
| 8/31/10 | 266 |
| 8/31/10 | 266 |
| 8/31/10 | 266 |
| 8/31/10 | 266 |
| 8/31/10 | 266 |
| 8/31/10 | 266 |
| 8/31/10 | 266 |
| 8/31/10 | 267 |
| 8/31/10 | 267 |
| 8/31/10 | 267 |
| 8/31/10 | 268 |
| 8/31/10 | 268 |
| 8/31/10 | 268 |
| 8/31/10 | 267 |
| 8/31/10 | 267 |
| 8/31/10 | 268 |
| 8/31/10 | 268 |
| 8/31/10 | 268 |
| 8/31/10 | 267 |
| 8/31/10 | 267 |
| 8/31/10 | 264 |
| 8/31/10 | 267 |
| 8/31/10 | 266 |
| 8/31/10 | 265 |
| 8/31/10 | 265 |
| 8/31/10 | 266 |
| 8/31/10 | 265 |
| 8/31/10 | 265 |
| 8/31/10 | 266 |
| 8/31/10 | 266 |
| 8/31/10 | 266 |
| 8/31/10 | 265 |
| 9/1/10 | 265 |
| 9/1/10 | 265 |
| 9/1/10 | 266 |
| 9/1/10 | 266 |
| 9/1/10 | 265 |
| 9/1/10 | 266 |
| 9/1/10 | 265 |
| 9/1/10 | 266 |
| 9/1/10 | 266 |
| 9/1/10 | 266 |
| 9/1/10 | 266 |
| 9/1/10 | 266 |
| 9/1/10 | 266 |
| 9/1/10 | 266 |
| 9/1/10 | 266 |
| 9/1/10 | 266 |
| 9/1/10 | 266 |
| 9/1/10 | 267 |
| 9/1/10 | 267 |
| 9/1/10 | 267 |
| 9/1/10 | 267 |
| 9/1/10 | 267 |
| 9/1/10 | 267 |
| 9/1/10 | 267 |
| 9/1/10 | 267 |
| 9/1/10 | 267 |
| 9/1/10 | 268 |
| 9/1/10 | 268 |
| 9/1/10 | 268 |
| 9/1/10 | 267 |
| 9/1/10 | 267 |
| 9/1/10 | 269 |
| 9/1/10 | 267 |
| 9/1/10 | 268 |
| 9/1/10 | 268 |
| 9/1/10 | 267 |
| 9/1/10 | 268 |
| 9/1/10 | 267 |
| 9/1/10 | 267 |
| 9/1/10 | 267 |
| 9/1/10 | 267 |
| 9/1/10 | 267 |
| 9/1/10 | 267 |
| 9/1/10 | 268 |
| 9/1/10 | 267 |
| 9/1/10 | 266 |
| 9/1/10 | 267 |
| 9/1/10 | 267 |
| 9/2/10 | 267 |
| 9/2/10 | 267 |
| 9/2/10 | 267 |
| 9/2/10 | 267 |
| 9/2/10 | 267 |
| 9/2/10 | 267 |
| 9/2/10 | 267 |
| 9/2/10 | 267 |
| 9/2/10 | 267 |
| 9/2/10 | 267 |
| 9/2/10 | 267 |
| 9/2/10 | 266 |
| 9/2/10 | 268 |
| 9/2/10 | 268 |
| 9/2/10 | 268 |
| 9/2/10 | 268 |
| 9/2/10 | 268 |
| 9/2/10 | 268 |
| 9/2/10 | 268 |
| 9/2/10 | 268 |
| 9/2/10 | 268 |
| 9/2/10 | 268 |
| 9/2/10 | 268 |
| 9/2/10 | 268 |
| 9/2/10 | 268 |
| 9/2/10 | 268 |
| 9/2/10 | 269 |
| 9/2/10 | 269 |
| 9/2/10 | 268 |
| 9/2/10 | 268 |
| 9/2/10 | 267 |
| 9/2/10 | 270 |
| 9/2/10 | 268 |
| 9/2/10 | 269 |
| 9/2/10 | 269 |
| 9/2/10 | 269 |
| 9/2/10 | 269 |
| 9/2/10 | 268 |
| 9/2/10 | 268 |
| 9/2/10 | 268 |
| 9/2/10 | 268 |
| 9/2/10 | 267 |
| 9/2/10 | 267 |
| 9/2/10 | 268 |
| 9/2/10 | 268 |
| 9/2/10 | 268 |
| 9/2/10 | 268 |
| 9/2/10 | 268 |
| 9/3/10 | 268 |
| 9/3/10 | 268 |
| 9/3/10 | 269 |
| 9/3/10 | 269 |
| 9/3/10 | 269 |
| 9/3/10 | 268 |
| 9/3/10 | 268 |
| 9/3/10 | 268 |
| 9/3/10 | 268 |
| 9/3/10 | 268 |
| 9/3/10 | 268 |
| 9/3/10 | 269 |
| 9/3/10 | 269 |
| 9/3/10 | 269 |
| 9/3/10 | 269 |
| 9/3/10 | 269 |
| 9/3/10 | 269 |
| 9/3/10 | 269 |
| 9/3/10 | 270 |
| 9/3/10 | 270 |
| 9/3/10 | 269 |
| 9/3/10 | 269 |
| 9/3/10 | 268 |
| 9/3/10 | 270 |
| 9/3/10 | 270 |
| 9/3/10 | 270 |
| 9/3/10 | 269 |
| 9/3/10 | 269 |
| 9/3/10 | 269 |
| 9/3/10 | 269 |
| 9/3/10 | 269 |
| 9/3/10 | 269 |
| 9/3/10 | 269 |
| 9/3/10 | 269 |
| 9/3/10 | 269 |
| 9/3/10 | 269 |
| 9/3/10 | 269 |
| 9/3/10 | 268 |
| 9/3/10 | 268 |
| 9/3/10 | 268 |
| 9/3/10 | 268 |
| 9/3/10 | 268 |
| 9/3/10 | 269 |
| 9/3/10 | 269 |
| 9/3/10 | 269 |
| 9/3/10 | 269 |
| 9/3/10 | 269 |
| 9/3/10 | 269 |
| 9/4/10 | 269 |
| 9/4/10 | 270 |
| 9/4/10 | 270 |
| 9/4/10 | 268 |
| 9/4/10 | 268 |
| 9/4/10 | 268 |
| 9/4/10 | 269 |
| 9/4/10 | 269 |
| 9/4/10 | 269 |
| 9/4/10 | 269 |
| 9/4/10 | 269 |
| 9/4/10 | 270 |
| 9/4/10 | 270 |
| 9/4/10 | 270 |
| 9/4/10 | 270 |
| 9/4/10 | 270 |
| 9/4/10 | 270 |
| 9/4/10 | 270 |
| 9/4/10 | 270 |
| 9/4/10 | 270 |
| 9/4/10 | 269 |
| 9/4/10 | 270 |
| 9/4/10 | 270 |
| 9/4/10 | 270 |
| 9/4/10 | 270 |
| 9/4/10 | 270 |
| 9/4/10 | 270 |
| 9/4/10 | 270 |
| 9/4/10 | 270 |
| 9/4/10 | 270 |
| 9/4/10 | 270 |
| 9/4/10 | 270 |
| 9/4/10 | 270 |
| 9/4/10 | 270 |
| 9/4/10 | 270 |
| 9/4/10 | 270 |
| 9/4/10 | 270 |
| 9/4/10 | 270 |
| 9/4/10 | 270 |
| 9/4/10 | 271 |
| 9/4/10 | 270 |
| 9/4/10 | 271 |
| 9/4/10 | 271 |
| 9/4/10 | 271 |
| 9/4/10 | 271 |
| 9/4/10 | 271 |
| 9/4/10 | 271 |
| 9/4/10 | 271 |
| 9/5/10 | 271 |
| 9/5/10 | 271 |
| 9/5/10 | 271 |
| 9/5/10 | 271 |
| 9/5/10 | 271 |
| 9/5/10 | 271 |
| 9/5/10 | 271 |
| 9/5/10 | 271 |
| 9/5/10 | 271 |
| 9/5/10 | 271 |
| 9/5/10 | 271 |
| 9/5/10 | 271 |
| 9/5/10 | 271 |
| 9/5/10 | 271 |
| 9/5/10 | 271 |
| 9/5/10 | 271 |
| 9/5/10 | 271 |
| 9/5/10 | 271 |
| 9/5/10 | 271 |
| 9/5/10 | 271 |
| 9/5/10 | 271 |
| 9/5/10 | 270 |
| 9/5/10 | 270 |
| 9/5/10 | 270 |
| 9/5/10 | 270 |
| 9/5/10 | 270 |
| 9/5/10 | 270 |
| 9/5/10 | 271 |
| 9/5/10 | 271 |
| 9/5/10 | 271 |
| 9/5/10 | 271 |
| 9/5/10 | 271 |
| 9/5/10 | 271 |
| 9/5/10 | 271 |
| 9/5/10 | 271 |
| 9/5/10 | 272 |
| 9/5/10 | 271 |
| 9/5/10 | 271 |
| 9/5/10 | 271 |
| 9/5/10 | 271 |
| 9/5/10 | 270 |
| 9/5/10 | 270 |
| 9/5/10 | 271 |
| 9/5/10 | 270 |
| 9/5/10 | 271 |
| 9/5/10 | 271 |
| 9/5/10 | 271 |
| 9/5/10 | 271 |
| 9/6/10 | 271 |
| 9/6/10 | 271 |
| 9/6/10 | 271 |
| 9/6/10 | 271 |
| 9/6/10 | 271 |
| 9/6/10 | 272 |
| 9/6/10 | 271 |
| 9/6/10 | 271 |
| 9/6/10 | 271 |
| 9/6/10 | 271 |
| 9/6/10 | 272 |
| 9/6/10 | 271 |
| 9/6/10 | 272 |
| 9/6/10 | 272 |
| 9/6/10 | 272 |
| 9/6/10 | 272 |
| 9/6/10 | 272 |
| 9/6/10 | 272 |
| 9/6/10 | 272 |
| 9/6/10 | 272 |
| 9/6/10 | 272 |
| 9/6/10 | 272 |
| 9/6/10 | 272 |
| 9/6/10 | 272 |
| 9/6/10 | 273 |
| 9/6/10 | 272 |
| 9/6/10 | 272 |
| 9/6/10 | 272 |
| 9/6/10 | 273 |
| 9/6/10 | 273 |
| 9/6/10 | 272 |
| 9/6/10 | 272 |
| 9/6/10 | 272 |
| 9/6/10 | 273 |
| 9/6/10 | 272 |
| 9/6/10 | 272 |
| 9/6/10 | 273 |
| 9/6/10 | 272 |
| 9/6/10 | 272 |
| 9/6/10 | 272 |
| 9/6/10 | 272 |
| 9/6/10 | 272 |
| 9/6/10 | 272 |
| 9/6/10 | 272 |
| 9/6/10 | 272 |
| 9/6/10 | 272 |
| 9/6/10 | 272 |
| 9/6/10 | 271 |
| 9/7/10 | 272 |
| 9/7/10 | 272 |
| 9/7/10 | 272 |
| 9/7/10 | 272 |
| 9/7/10 | 272 |
| 9/7/10 | 272 |
| 9/7/10 | 272 |
| 9/7/10 | 272 |
| 9/7/10 | 273 |
| 9/7/10 | 273 |
| 9/7/10 | 273 |
| 9/7/10 | 273 |
| 9/7/10 | 273 |
| 9/7/10 | 273 |
| 9/7/10 | 273 |
| 9/7/10 | 272 |
| 9/7/10 | 272 |
| 9/7/10 | 273 |
| 9/7/10 | 273 |
| 9/7/10 | 273 |
| 9/7/10 | 272 |
| 9/7/10 | 273 |
| 9/7/10 | 272 |
| 9/7/10 | 273 |
| 9/7/10 | 272 |
| 9/7/10 | 272 |
| 9/7/10 | 273 |
| 9/7/10 | 272 |
| 9/7/10 | 272 |
| 9/7/10 | 272 |
| 9/7/10 | 272 |
| 9/7/10 | 272 |
| 9/7/10 | 273 |
| 9/7/10 | 273 |
| 9/7/10 | 273 |
| 9/7/10 | 272 |
| 9/7/10 | 272 |
| 9/7/10 | 273 |
| 9/7/10 | 273 |
| 9/7/10 | 273 |
| 9/7/10 | 273 |
| 9/7/10 | 273 |
| 9/7/10 | 273 |
| 9/7/10 | 273 |
| 9/7/10 | 274 |
| 9/7/10 | 272 |
| 9/7/10 | 272 |
| 9/7/10 | 272 |
| 9/8/10 | 272 |
| 9/8/10 | 273 |
| 9/8/10 | 273 |
| 9/8/10 | 273 |
| 9/8/10 | 273 |
| 9/8/10 | 274 |
| 9/8/10 | 274 |
| 9/8/10 | 273 |
| 9/8/10 | 273 |
| 9/8/10 | 273 |
| 9/8/10 | 273 |
| 9/8/10 | 273 |
| 9/8/10 | 273 |
| 9/8/10 | 273 |
| 9/8/10 | 273 |
| 9/8/10 | 273 |
| 9/8/10 | 273 |
| 9/8/10 | 273 |
| 9/8/10 | 273 |
| 9/8/10 | 274 |
| 9/8/10 | 273 |
| 9/8/10 | 274 |
| 9/8/10 | 273 |
| 9/8/10 | 274 |
| 9/8/10 | 273 |
| 9/8/10 | 273 |
| 9/8/10 | 274 |
| 9/8/10 | 274 |
| 9/8/10 | 273 |
| 9/8/10 | 273 |
| 9/8/10 | 274 |
| 9/8/10 | 274 |
| 9/8/10 | 274 |
| 9/8/10 | 273 |
| 9/8/10 | 273 |
| 9/8/10 | 274 |
| 9/8/10 | 274 |
| 9/8/10 | 273 |
| 9/8/10 | 273 |
| 9/8/10 | 273 |
| 9/8/10 | 273 |
| 9/8/10 | 273 |
| 9/8/10 | 273 |
| 9/8/10 | 273 |
| 9/8/10 | 273 |
| 9/8/10 | 273 |
| 9/8/10 | 274 |
| 9/8/10 | 274 |
| 9/9/10 | 274 |
| 9/9/10 | 274 |
| 9/9/10 | 274 |
| 9/9/10 | 274 |
| 9/9/10 | 274 |
| 9/9/10 | 274 |
| 9/9/10 | 274 |
| 9/9/10 | 274 |
| 9/9/10 | 274 |
| 9/9/10 | 274 |
| 9/9/10 | 274 |
| 9/9/10 | 274 |
| 9/9/10 | 275 |
| 9/9/10 | 274 |
| 9/9/10 | 274 |
| 9/9/10 | 274 |
| 9/9/10 | 274 |
| 9/9/10 | 274 |
| 9/9/10 | 274 |
| 9/9/10 | 274 |
| 9/9/10 | 274 |
| 9/9/10 | 274 |
| 9/9/10 | 274 |
| 9/9/10 | 274 |
| 9/9/10 | 274 |
| 9/9/10 | 274 |
| 9/9/10 | 274 |
| 9/9/10 | 274 |
| 9/9/10 | 274 |
| 9/9/10 | 274 |
| 9/9/10 | 274 |
| 9/9/10 | 274 |
| 9/9/10 | 275 |
| 9/9/10 | 275 |
| 9/9/10 | 275 |
| 9/9/10 | 275 |
| 9/9/10 | 275 |
| 9/9/10 | 275 |
| 9/9/10 | 275 |
| 9/9/10 | 275 |
| 9/9/10 | 275 |
| 9/9/10 | 275 |
| 9/9/10 | 275 |
| 9/9/10 | 275 |
| 9/9/10 | 275 |
| 9/9/10 | 276 |
| 9/9/10 | 276 |
| 9/9/10 | 276 |
| 9/10/10 | 276 |
| 9/10/10 | 276 |
| 9/10/10 | 276 |
| 9/10/10 | 276 |
| 9/10/10 | 276 |
| 9/10/10 | 276 |
| 9/10/10 | 276 |
| 9/10/10 | 276 |
| 9/10/10 | 276 |
| 9/10/10 | 276 |
| 9/10/10 | 276 |
| 9/10/10 | 276 |
| 9/10/10 | 276 |
| 9/10/10 | 276 |
| 9/10/10 | 276 |
| 9/10/10 | 276 |
| 9/10/10 | 276 |
| 9/10/10 | 276 |
| 9/10/10 | 276 |
| 9/10/10 | 276 |
| 9/10/10 | 276 |
| 9/10/10 | 276 |
| 9/10/10 | 276 |
| 9/10/10 | 276 |
| 9/10/10 | 276 |
| 9/10/10 | 276 |
| 9/10/10 | 276 |
| 9/10/10 | 277 |
| 9/10/10 | 276 |
| 9/10/10 | 276 |
| 9/10/10 | 276 |
| 9/10/10 | 276 |
| 9/10/10 | 277 |
| 9/10/10 | 276 |
| 9/10/10 | 276 |
| 9/10/10 | 276 |
| 9/10/10 | 276 |
| 9/10/10 | 276 |
| 9/10/10 | 277 |
| 9/10/10 | 277 |
| 9/10/10 | 277 |
| 9/10/10 | 276 |
| 9/10/10 | 276 |
| 9/10/10 | 276 |
| 9/10/10 | 276 |
| 9/10/10 | 276 |
| 9/10/10 | 276 |
| 9/10/10 | 276 |
| 9/11/10 | 276 |
| 9/11/10 | 277 |
| 9/11/10 | 277 |
| 9/11/10 | 277 |
| 9/11/10 | 277 |
| 9/11/10 | 277 |
| 9/11/10 | 277 |
| 9/11/10 | 275 |
| 9/11/10 | 274 |
| 9/11/10 | 277 |
| 9/11/10 | 277 |
| 9/11/10 | 277 |
| 9/11/10 | 277 |
| 9/11/10 | 277 |
| 9/11/10 | 277 |
| 9/11/10 | 277 |
| 9/11/10 | 277 |
| 9/11/10 | 277 |
| 9/11/10 | 277 |
| 9/11/10 | 277 |
| 9/11/10 | 277 |
| 9/11/10 | 277 |
| 9/11/10 | 276 |
| 9/11/10 | 276 |
| 9/11/10 | 276 |
| 9/11/10 | 276 |
| 9/11/10 | 275 |
| 9/11/10 | 275 |
| 9/11/10 | 275 |
| 9/11/10 | 275 |
| 9/11/10 | 275 |
| 9/11/10 | 275 |
| 9/11/10 | 275 |
| 9/11/10 | 275 |
| 9/11/10 | 276 |
| 9/11/10 | 276 |
| 9/11/10 | 276 |
| 9/11/10 | 276 |
| 9/11/10 | 276 |
| 9/11/10 | 276 |
| 9/11/10 | 276 |
| 9/11/10 | 276 |
| 9/11/10 | 276 |
| 9/11/10 | 276 |
| 9/11/10 | 276 |
| 9/11/10 | 276 |
| 9/11/10 | 276 |
| 9/11/10 | 276 |
| 9/12/10 | 276 |
| 9/12/10 | 276 |
| 9/12/10 | 276 |
| 9/12/10 | 276 |
| 9/12/10 | 276 |
| 9/12/10 | 277 |
| 9/12/10 | 277 |
| 9/12/10 | 277 |
| 9/12/10 | 277 |
| 9/12/10 | 277 |
| 9/12/10 | 277 |
| 9/12/10 | 277 |
| 9/12/10 | 277 |
| 9/12/10 | 277 |
| 9/12/10 | 277 |
| 9/12/10 | 277 |
| 9/12/10 | 277 |
| 9/12/10 | 277 |
| 9/12/10 | 277 |
| 9/12/10 | 277 |
| 9/12/10 | 277 |
| 9/12/10 | 277 |
| 9/12/10 | 277 |
| 9/12/10 | 277 |
| 9/12/10 | 277 |
| 9/12/10 | 277 |
| 9/12/10 | 277 |
| 9/12/10 | 277 |
| 9/12/10 | 277 |
| 9/12/10 | 277 |
| 9/12/10 | 277 |
| 9/12/10 | 277 |
| 9/12/10 | 277 |
| 9/12/10 | 277 |
| 9/12/10 | 277 |
| 9/12/10 | 277 |
| 9/12/10 | 277 |
| 9/12/10 | 277 |
| 9/12/10 | 277 |
| 9/12/10 | 277 |
| 9/12/10 | 277 |
| 9/12/10 | 277 |
| 9/12/10 | 276 |
| 9/12/10 | 277 |
| 9/12/10 | 277 |
| 9/12/10 | 277 |
| 9/12/10 | 278 |
| 9/12/10 | 278 |
| 9/13/10 | 278 |
| 9/13/10 | 278 |
| 9/13/10 | 278 |
| 9/13/10 | 278 |
| 9/13/10 | 278 |
| 9/13/10 | 278 |
| 9/13/10 | 278 |
| 9/13/10 | 279 |
| 9/13/10 | 279 |
| 9/13/10 | 279 |
| 9/13/10 | 278 |
| 9/13/10 | 278 |
| 9/13/10 | 278 |
| 9/13/10 | 278 |
| 9/13/10 | 278 |
| 9/13/10 | 278 |
| 9/13/10 | 278 |
| 9/13/10 | 278 |
| 9/13/10 | 279 |
| 9/13/10 | 278 |
| 9/13/10 | 278 |
| 9/13/10 | 278 |
| 9/13/10 | 278 |
| 9/13/10 | 278 |
| 9/13/10 | 278 |
| 9/13/10 | 278 |
| 9/13/10 | 278 |
| 9/13/10 | 278 |
| 9/13/10 | 278 |
| 9/13/10 | 277 |
| 9/13/10 | 278 |
| 9/13/10 | 278 |
| 9/13/10 | 278 |
| 9/13/10 | 279 |
| 9/13/10 | 278 |
| 9/13/10 | 278 |
| 9/13/10 | 278 |
| 9/13/10 | 279 |
| 9/13/10 | 279 |
| 9/13/10 | 279 |
| 9/13/10 | 278 |
| 9/13/10 | 278 |
| 9/13/10 | 278 |
| 9/13/10 | 278 |
| 9/13/10 | 279 |
| 9/13/10 | 278 |
| 9/13/10 | 278 |
| 9/13/10 | 279 |
| 9/14/10 | 279 |
| 9/14/10 | 279 |
| 9/14/10 | 279 |
| 9/14/10 | 279 |
| 9/14/10 | 279 |
| 9/14/10 | 279 |
| 9/14/10 | 279 |
| 9/14/10 | 279 |
| 9/14/10 | 279 |
| 9/14/10 | 279 |
| 9/14/10 | 279 |
| 9/14/10 | 279 |
| 9/14/10 | 279 |
| 9/14/10 | 279 |
| 9/14/10 | 279 |
| 9/14/10 | 279 |
| 9/14/10 | 279 |
| 9/14/10 | 279 |
| 9/14/10 | 279 |
| 9/14/10 | 279 |
| 9/14/10 | 280 |
| 9/14/10 | 279 |
| 9/14/10 | 279 |
| 9/14/10 | 279 |
| 9/14/10 | 279 |
| 9/14/10 | 279 |
| 9/14/10 | 279 |
| 9/14/10 | 280 |
| 9/14/10 | 280 |
| 9/14/10 | 280 |
| 9/14/10 | 280 |
| 9/14/10 | 280 |
| 9/14/10 | 280 |
| 9/14/10 | 280 |
| 9/14/10 | 280 |
| 9/14/10 | 280 |
| 9/14/10 | 280 |
| 9/14/10 | 279 |
| 9/14/10 | 280 |
| 9/14/10 | 280 |
| 9/14/10 | 279 |
| 9/14/10 | 280 |
| 9/14/10 | 280 |
| 9/14/10 | 280 |
| 9/14/10 | 280 |
| 9/14/10 | 280 |
| 9/14/10 | 280 |
| 9/14/10 | 280 |
| 9/15/10 | 280 |
| 9/15/10 | 280 |
| 9/15/10 | 280 |
| 9/15/10 | 280 |
| 9/15/10 | 280 |
| 9/15/10 | 280 |
| 9/15/10 | 280 |
| 9/15/10 | 280 |
| 9/15/10 | 280 |
| 9/15/10 | 280 |
| 9/15/10 | 281 |
| 9/15/10 | 280 |
| 9/15/10 | 280 |
| 9/15/10 | 280 |
| 9/15/10 | 281 |
| 9/15/10 | 280 |
| 9/15/10 | 280 |
| 9/15/10 | 280 |
| 9/15/10 | 280 |
| 9/15/10 | 280 |
| 9/15/10 | 280 |
| 9/15/10 | 281 |
| 9/15/10 | 280 |
| 9/15/10 | 281 |
| 9/15/10 | 281 |
| 9/15/10 | 281 |
| 9/15/10 | 281 |
| 9/15/10 | 280 |
| 9/15/10 | 280 |
| 9/15/10 | 280 |
| 9/15/10 | 281 |
| 9/15/10 | 281 |
| 9/15/10 | 281 |
| 9/15/10 | 280 |
| 9/15/10 | 281 |
| 9/15/10 | 281 |
| 9/15/10 | 281 |
| 9/15/10 | 281 |
| 9/15/10 | 281 |
| 9/15/10 | 281 |
| 9/15/10 | 281 |
| 9/15/10 | 282 |
| 9/15/10 | 281 |
| 9/15/10 | 281 |
| 9/15/10 | 281 |
| 9/15/10 | 281 |
| 9/15/10 | 281 |
| 9/15/10 | 281 |
| 9/16/10 | 281 |
| 9/16/10 | 280 |
| 9/16/10 | 281 |
| 9/16/10 | 281 |
| 9/16/10 | 281 |
| 9/16/10 | 281 |
| 9/16/10 | 281 |
| 9/16/10 | 281 |
| 9/16/10 | 281 |
| 9/16/10 | 281 |
| 9/16/10 | 281 |
| 9/16/10 | 281 |
| 9/16/10 | 281 |
| 9/16/10 | 281 |
| 9/16/10 | 281 |
| 9/16/10 | 281 |
| 9/16/10 | 281 |
| 9/16/10 | 281 |
| 9/16/10 | 281 |
| 9/16/10 | 281 |
| 9/16/10 | 281 |
| 9/16/10 | 281 |
| 9/16/10 | 281 |
| 9/16/10 | 281 |
| 9/16/10 | 280 |
| 9/16/10 | 280 |
| 9/16/10 | 280 |
| 9/16/10 | 280 |
| 9/16/10 | 280 |
| 9/16/10 | 280 |
| 9/16/10 | 280 |
| 9/16/10 | 280 |
| 9/16/10 | 280 |
| 9/16/10 | 280 |
| 9/16/10 | 280 |
| 9/16/10 | 280 |
| 9/16/10 | 280 |
| 9/16/10 | 280 |
| 9/16/10 | 280 |
| 9/16/10 | 280 |
| 9/16/10 | 280 |
| 9/16/10 | 280 |
| 9/16/10 | 279 |
| 9/16/10 | 279 |
| 9/16/10 | 279 |
| 9/16/10 | 279 |
| 9/16/10 | 279 |
| 9/16/10 | 279 |
| 9/17/10 | 279 |
| 9/17/10 | 279 |
| 9/17/10 | 279 |
| 9/17/10 | 279 |
| 9/17/10 | 279 |
| 9/17/10 | 279 |
| 9/17/10 | 280 |
| 9/17/10 | 279 |
| 9/17/10 | 279 |
| 9/17/10 | 280 |
| 9/17/10 | 280 |
| 9/17/10 | 279 |
| 9/17/10 | 280 |
| 9/17/10 | 280 |
| 9/17/10 | 280 |
| 9/17/10 | 280 |
| 9/17/10 | 280 |
| 9/17/10 | 280 |
| 9/17/10 | 280 |
| 9/17/10 | 280 |
| 9/17/10 | 280 |
| 9/17/10 | 280 |
| 9/17/10 | 280 |
| 9/17/10 | 280 |
| 9/17/10 | 280 |
| 9/17/10 | 280 |
| 9/17/10 | 280 |
| 9/17/10 | 280 |
| 9/17/10 | 280 |
| 9/17/10 | 280 |
| 9/17/10 | 280 |
| 9/17/10 | 280 |
| 9/17/10 | 280 |
| 9/17/10 | 280 |
| 9/17/10 | 280 |
| 9/17/10 | 280 |
| 9/17/10 | 280 |
| 9/17/10 | 280 |
| 9/17/10 | 280 |
| 9/17/10 | 280 |
| 9/17/10 | 280 |
| 9/17/10 | 280 |
| 9/17/10 | 280 |
| 9/17/10 | 280 |
| 9/17/10 | 280 |
| 9/17/10 | 280 |
| 9/17/10 | 280 |
| 9/17/10 | 280 |
| 9/18/10 | 280 |
| 9/18/10 | 280 |
| 9/18/10 | 281 |
| 9/18/10 | 280 |
| 9/18/10 | 280 |
| 9/18/10 | 280 |
| 9/18/10 | 280 |
| 9/18/10 | 281 |
| 9/18/10 | 281 |
| 9/18/10 | 281 |
| 9/18/10 | 280 |
| 9/18/10 | 280 |
| 9/18/10 | 281 |
| 9/18/10 | 281 |
| 9/18/10 | 280 |
| 9/18/10 | 280 |
| 9/18/10 | 280 |
| 9/18/10 | 280 |
| 9/18/10 | 280 |
| 9/18/10 | 280 |
| 9/18/10 | 281 |
| 9/18/10 | 281 |
| 9/18/10 | 281 |
| 9/18/10 | 281 |
| 9/18/10 | 281 |
| 9/18/10 | 281 |
| 9/18/10 | 281 |
| 9/18/10 | 281 |
| 9/18/10 | 282 |
| 9/18/10 | 281 |
| 9/18/10 | 281 |
| 9/18/10 | 282 |
| 9/18/10 | 283 |
| 9/18/10 | 283 |
| 9/18/10 | 283 |
| 9/18/10 | 282 |
| 9/18/10 | 281 |
| 9/18/10 | 281 |
| 9/18/10 | 280 |
| 9/18/10 | 280 |
| 9/18/10 | 280 |
| 9/18/10 | 279 |
| 9/18/10 | 281 |
| 9/18/10 | 280 |
| 9/18/10 | 280 |
| 9/18/10 | 281 |
| 9/18/10 | 280 |
| 9/18/10 | 281 |
| 9/19/10 | 281 |
| 9/19/10 | 280 |
| 9/19/10 | 281 |
| 9/19/10 | 281 |
| 9/19/10 | 280 |
| 9/19/10 | 280 |
| 9/19/10 | 280 |
| 9/19/10 | 281 |
| 9/19/10 | 280 |
| 9/19/10 | 281 |
| 9/19/10 | 280 |
| 9/19/10 | 280 |
| 9/19/10 | 281 |
| 9/19/10 | 281 |
| 9/19/10 | 281 |
| 9/19/10 | 281 |
| 9/19/10 | 281 |
| 9/19/10 | 281 |
| 9/19/10 | 281 |
| 9/19/10 | 281 |
| 9/19/10 | 281 |
| 9/19/10 | 281 |
| 9/19/10 | 281 |
| 9/19/10 | 282 |
| 9/19/10 | 282 |
| 9/19/10 | 282 |
| 9/19/10 | 282 |
| 9/19/10 | 282 |
| 9/19/10 | 281 |
| 9/19/10 | 281 |
| 9/19/10 | 281 |
| 9/19/10 | 281 |
| 9/19/10 | 281 |
| 9/19/10 | 281 |
| 9/19/10 | 282 |
| 9/19/10 | 282 |
| 9/19/10 | 282 |
| 9/19/10 | 282 |
| 9/19/10 | 282 |
| 9/19/10 | 282 |
| 9/19/10 | 282 |
| 9/19/10 | 282 |
| 9/19/10 | 282 |
| 9/19/10 | 281 |
| 9/19/10 | 281 |
| 9/19/10 | 281 |
| 9/19/10 | 281 |
| 9/19/10 | 281 |
| 9/20/10 | 281 |
| 9/20/10 | 281 |
| 9/20/10 | 281 |
| 9/20/10 | 281 |
| 9/20/10 | 281 |
| 9/20/10 | 281 |
| 9/20/10 | 281 |
| 9/20/10 | 281 |
| 9/20/10 | 281 |
| 9/20/10 | 281 |
| 9/20/10 | 281 |
| 9/20/10 | 282 |
| 9/20/10 | 281 |
| 9/20/10 | 282 |
| 9/20/10 | 282 |
| 9/20/10 | 282 |
| 9/20/10 | 282 |
| 9/20/10 | 282 |
| 9/20/10 | 282 |
| 9/20/10 | 282 |
| 9/20/10 | 282 |
| 9/20/10 | 282 |
| 9/20/10 | 282 |
| 9/20/10 | 281 |
| 9/20/10 | 282 |
| 9/20/10 | 281 |
| 9/20/10 | 282 |
| 9/20/10 | 282 |
| 9/20/10 | 282 |
| 9/20/10 | 282 |
| 9/20/10 | 283 |
| 9/20/10 | 282 |
| 9/20/10 | 282 |
| 9/20/10 | 281 |
| 9/20/10 | 281 |
| 9/20/10 | 282 |
| 9/20/10 | 282 |
| 9/20/10 | 282 |
| 9/20/10 | 282 |
| 9/20/10 | 282 |
| 9/20/10 | 282 |
| 9/20/10 | 282 |
| 9/20/10 | 282 |
| 9/20/10 | 282 |
| 9/20/10 | 282 |
| 9/20/10 | 282 |
| 9/20/10 | 282 |
| 9/20/10 | 282 |
| 9/21/10 | 282 |
| 9/21/10 | 282 |
| 9/21/10 | 283 |
| 9/21/10 | 283 |
| 9/21/10 | 283 |
| 9/21/10 | 282 |
| 9/21/10 | 283 |
| 9/21/10 | 283 |
| 9/21/10 | 283 |
| 9/21/10 | 283 |
| 9/21/10 | 283 |
| 9/21/10 | 283 |
| 9/21/10 | 283 |
| 9/21/10 | 283 |
| 9/21/10 | 283 |
| 9/21/10 | 283 |
| 9/21/10 | 283 |
| 9/21/10 | 282 |
| 9/21/10 | 283 |
| 9/21/10 | 283 |
| 9/21/10 | 283 |
| 9/21/10 | 283 |
| 9/21/10 | 283 |
| 9/21/10 | 284 |
| 9/21/10 | 284 |
| 9/21/10 | 284 |
| 9/21/10 | 285 |
| 9/21/10 | 284 |
| 9/21/10 | 285 |
| 9/21/10 | 284 |
| 9/21/10 | 283 |
| 9/21/10 | 284 |
| 9/21/10 | 282 |
| 9/21/10 | 283 |
| 9/21/10 | 285 |
| 9/21/10 | 285 |
| 9/21/10 | 284 |
| 9/21/10 | 285 |
| 9/21/10 | 284 |
| 9/21/10 | 285 |
| 9/21/10 | 284 |
| 9/21/10 | 284 |
| 9/21/10 | 284 |
| 9/21/10 | 283 |
| 9/21/10 | 283 |
| 9/21/10 | 283 |
| 9/21/10 | 284 |
| 9/21/10 | 283 |
| 9/22/10 | 283 |
| 9/22/10 | 283 |
| 9/22/10 | 283 |
| 9/22/10 | 283 |
| 9/22/10 | 283 |
| 9/22/10 | 283 |
| 9/22/10 | 284 |
| 9/22/10 | 283 |
| 9/22/10 | 283 |
| 9/22/10 | 283 |
| 9/22/10 | 283 |
| 9/22/10 | 284 |
| 9/22/10 | 284 |
| 9/22/10 | 283 |
| 9/22/10 | 283 |
| 9/22/10 | 283 |
| 9/22/10 | 283 |
| 9/22/10 | 283 |
| 9/22/10 | 283 |
| 9/22/10 | 283 |
| 9/22/10 | 284 |
| 9/22/10 | 284 |
| 9/22/10 | 284 |
| 9/22/10 | 284 |
| 9/22/10 | 284 |
| 9/22/10 | 284 |
| 9/22/10 | 284 |
| 9/22/10 | 284 |
| 9/22/10 | 284 |
| 9/22/10 | 284 |
| 9/22/10 | 283 |
| 9/22/10 | 283 |
| 9/22/10 | 283 |
| 9/22/10 | 284 |
| 9/22/10 | 284 |
| 9/22/10 | 283 |
| 9/22/10 | 283 |
| 9/22/10 | 284 |
| 9/22/10 | 284 |
| 9/22/10 | 284 |
| 9/22/10 | 284 |
| 9/22/10 | 283 |
| 9/22/10 | 283 |
| 9/22/10 | 283 |
| 9/22/10 | 283 |
| 9/22/10 | 283 |
| 9/22/10 | 283 |
| 9/22/10 | 283 |
| 9/23/10 | 283 |
| 9/23/10 | 283 |
| 9/23/10 | 283 |
| 9/23/10 | 282 |
| 9/23/10 | 283 |
| 9/23/10 | 283 |
| 9/23/10 | 283 |
| 9/23/10 | 283 |
| 9/23/10 | 283 |
| 9/23/10 | 283 |
| 9/23/10 | 283 |
| 9/23/10 | 283 |
| 9/23/10 | 283 |
| 9/23/10 | 283 |
| 9/23/10 | 283 |
| 9/23/10 | 283 |
| 9/23/10 | 283 |
| 9/23/10 | 283 |
| 9/23/10 | 283 |
| 9/23/10 | 283 |
| 9/23/10 | 283 |
| 9/23/10 | 283 |
| 9/23/10 | 283 |
| 9/23/10 | 283 |
| 9/23/10 | 283 |
| 9/23/10 | 283 |
| 9/23/10 | 283 |
| 9/23/10 | 283 |
| 9/23/10 | 283 |
| 9/23/10 | 283 |
| 9/23/10 | 283 |
| 9/23/10 | 283 |
| 9/23/10 | 283 |
| 9/23/10 | 284 |
| 9/23/10 | 284 |
| 9/23/10 | 283 |
| 9/23/10 | 283 |
| 9/23/10 | 283 |
| 9/23/10 | 283 |
| 9/23/10 | 283 |
| 9/23/10 | 283 |
| 9/23/10 | 283 |
| 9/23/10 | 282 |
| 9/23/10 | 282 |
| 9/23/10 | 282 |
| 9/23/10 | 282 |
| 9/23/10 | 283 |
| 9/23/10 | 283 |
| 9/24/10 | 282 |
| 9/24/10 | 282 |
| 9/24/10 | 282 |
| 9/24/10 | 282 |
| 9/24/10 | 283 |
| 9/24/10 | 283 |
| 9/24/10 | 283 |
| 9/24/10 | 283 |
| 9/24/10 | 283 |
| 9/24/10 | 284 |
| 9/24/10 | 283 |
| 9/24/10 | 283 |
| 9/24/10 | 284 |
| 9/24/10 | 283 |
| 9/24/10 | 283 |
| 9/24/10 | 283 |
| 9/24/10 | 284 |
| 9/24/10 | 283 |
| 9/24/10 | 284 |
| 9/24/10 | 284 |
| 9/24/10 | 284 |
| 9/24/10 | 284 |
| 9/24/10 | 284 |
| 9/24/10 | 283 |
| 9/24/10 | 284 |
| 9/24/10 | 284 |
| 9/24/10 | 283 |
| 9/24/10 | 283 |
| 9/24/10 | 283 |
| 9/24/10 | 283 |
| 9/24/10 | 284 |
| 9/24/10 | 285 |
| 9/24/10 | 285 |
| 9/24/10 | 284 |
| 9/24/10 | 267 |
| 9/24/10 | 268 |
| 9/24/10 | 268 |
| 9/24/10 | 269 |
| 9/24/10 | 268 |
| 9/24/10 | 269 |
| 9/24/10 | 270 |
| 9/24/10 | 269 |
| 9/24/10 | 270 |
| 9/24/10 | 270 |
| 9/24/10 | 271 |
| 9/24/10 | 271 |
| 9/24/10 | 272 |
| 9/24/10 | 272 |
| 9/25/10 | 271 |
| 9/25/10 | 271 |
| 9/25/10 | 271 |
| 9/25/10 | 271 |
| 9/25/10 | 271 |
| 9/25/10 | 271 |
| 9/25/10 | 272 |
| 9/25/10 | 271 |
| 9/25/10 | 272 |
| 9/25/10 | 272 |
| 9/25/10 | 272 |
| 9/25/10 | 273 |
| 9/25/10 | 272 |
| 9/25/10 | 274 |
| 9/25/10 | 275 |
| 9/25/10 | 273 |
| 9/25/10 | 274 |
| 9/25/10 | 275 |
| 9/25/10 | 275 |
| 9/25/10 | 275 |
| 9/25/10 | 276 |
| 9/25/10 | 275 |
| 9/25/10 | 276 |
| 9/25/10 | 277 |
| 9/25/10 | 277 |
| 9/25/10 | 277 |
| 9/25/10 | 277 |
| 9/25/10 | 277 |
| 9/25/10 | 278 |
| 9/25/10 | 278 |
| 9/25/10 | 277 |
| 9/25/10 | 276 |
| 9/25/10 | 278 |
| 9/25/10 | 278 |
| 9/25/10 | 278 |
| 9/25/10 | 278 |
| 9/25/10 | 278 |
| 9/25/10 | 278 |
| 9/25/10 | 278 |
| 9/25/10 | 278 |
| 9/25/10 | 277 |
| 9/25/10 | 281 |
| 9/25/10 | 281 |
| 9/25/10 | 282 |
| 9/25/10 | 282 |
| 9/25/10 | 282 |
| 9/25/10 | 282 |
| 9/25/10 | 282 |
| 9/26/10 | 282 |
| 9/26/10 | 282 |
| 9/26/10 | 282 |
| 9/26/10 | 282 |
| 9/26/10 | 282 |
| 9/26/10 | 283 |
| 9/26/10 | 283 |
| 9/26/10 | 283 |
| 9/26/10 | 283 |
| 9/26/10 | 283 |
| 9/26/10 | 283 |
| 9/26/10 | 283 |
| 9/26/10 | 283 |
| 9/26/10 | 283 |
| 9/26/10 | 283 |
| 9/26/10 | 283 |
| 9/26/10 | 283 |
| 9/26/10 | 283 |
| 9/26/10 | 283 |
| 9/26/10 | 283 |
| 9/26/10 | 284 |
| 9/26/10 | 283 |
| 9/26/10 | 284 |
| 9/26/10 | 284 |
| 9/26/10 | 283 |
| 9/26/10 | 284 |
| 9/26/10 | 284 |
| 9/26/10 | 284 |
| 9/26/10 | 284 |
| 9/26/10 | 284 |
| 9/26/10 | 284 |
| 9/26/10 | 284 |
| 9/26/10 | 284 |
| 9/26/10 | 284 |
| 9/26/10 | 282 |
| 9/26/10 | 284 |
| 9/26/10 | 284 |
| 9/26/10 | 285 |
| 9/26/10 | 285 |
| 9/26/10 | 285 |
| 9/26/10 | 285 |
| 9/26/10 | 285 |
| 9/26/10 | 285 |
| 9/26/10 | 285 |
| 9/26/10 | 285 |
| 9/26/10 | 285 |
| 9/26/10 | 285 |
| 9/26/10 | 285 |
| 9/27/10 | 285 |
| 9/27/10 | 285 |
| 9/27/10 | 285 |
| 9/27/10 | 285 |
| 9/27/10 | 285 |
| 9/27/10 | 285 |
| 9/27/10 | 285 |
| 9/27/10 | 285 |
| 9/27/10 | 285 |
| 9/27/10 | 285 |
| 9/27/10 | 286 |
| 9/27/10 | 285 |
| 9/27/10 | 285 |
| 9/27/10 | 285 |
| 9/27/10 | 286 |
| 9/27/10 | 286 |
| 9/27/10 | 286 |
| 9/27/10 | 286 |
| 9/27/10 | 286 |
| 9/27/10 | 286 |
| 9/27/10 | 286 |
| 9/27/10 | 286 |
| 9/27/10 | 286 |
| 9/27/10 | 286 |
| 9/27/10 | 286 |
| 9/27/10 | 286 |
| 9/27/10 | 286 |
| 9/27/10 | 286 |
| 9/27/10 | 287 |
| 9/27/10 | 286 |
| 9/27/10 | 286 |
| 9/27/10 | 286 |
| 9/27/10 | 286 |
| 9/27/10 | 286 |
| 9/27/10 | 286 |
| 9/27/10 | 286 |
| 9/27/10 | 286 |
| 9/27/10 | 286 |
| 9/27/10 | 286 |
| 9/27/10 | 286 |
| 9/27/10 | 286 |
| 9/27/10 | 286 |
| 9/27/10 | 286 |
| 9/27/10 | 286 |
| 9/27/10 | 287 |
| 9/27/10 | 287 |
| 9/27/10 | 287 |
| 9/27/10 | 287 |
| 9/28/10 | 287 |
| 9/28/10 | 287 |
| 9/28/10 | 287 |
| 9/28/10 | 287 |
| 9/28/10 | 287 |
| 9/28/10 | 287 |
| 9/28/10 | 287 |
| 9/28/10 | 287 |
| 9/28/10 | 286 |
| 9/28/10 | 286 |
| 9/28/10 | 286 |
| 9/28/10 | 286 |
| 9/28/10 | 286 |
| 9/28/10 | 286 |
| 9/28/10 | 286 |
| 9/28/10 | 286 |
| 9/28/10 | 286 |
| 9/28/10 | 286 |
| 9/28/10 | 286 |
| 9/28/10 | 285 |
| 9/28/10 | 285 |
| 9/28/10 | 285 |
| 9/28/10 | 285 |
| 9/28/10 | 285 |
| 9/28/10 | 285 |
| 9/28/10 | 285 |
| 9/28/10 | 285 |
| 9/28/10 | 285 |
| 9/28/10 | 285 |
| 9/28/10 | 285 |
| 9/28/10 | 285 |
| 9/28/10 | 285 |
| 9/28/10 | 285 |
| 9/28/10 | 285 |
| 9/28/10 | 285 |
| 9/28/10 | 285 |
| 9/28/10 | 285 |
| 9/28/10 | 285 |
| 9/28/10 | 285 |
| 9/28/10 | 285 |
| 9/28/10 | 285 |
| 9/28/10 | 285 |
| 9/28/10 | 285 |
| 9/28/10 | 285 |
| 9/28/10 | 285 |
| 9/28/10 | 285 |
| 9/28/10 | 285 |
| 9/28/10 | 286 |
| 9/29/10 | 285 |
| 9/29/10 | 286 |
| 9/29/10 | 286 |
| 9/29/10 | 286 |
| 9/29/10 | 286 |
| 9/29/10 | 285 |
| 9/29/10 | 286 |
| 9/29/10 | 286 |
| 9/29/10 | 286 |
| 9/29/10 | 286 |
| 9/29/10 | 286 |
| 9/29/10 | 286 |
| 9/29/10 | 286 |
| 9/29/10 | 286 |
| 9/29/10 | 286 |
| 9/29/10 | 286 |
| 9/29/10 | 286 |
| 9/29/10 | 286 |
| 9/29/10 | 286 |
| 9/29/10 | 286 |
| 9/29/10 | 286 |
| 9/29/10 | 286 |
| 9/29/10 | 287 |
| 9/29/10 | 286 |
| 9/29/10 | 287 |
| 9/29/10 | 287 |
| 9/29/10 | 288 |
| 9/29/10 | 287 |
| 9/29/10 | 288 |
| 9/29/10 | 288 |
| 9/29/10 | 288 |
| 9/29/10 | 290 |
| 9/29/10 | 289 |
| 9/29/10 | 287 |
| 9/29/10 | 287 |
| 9/29/10 | 287 |
| 9/29/10 | 286 |
| 9/29/10 | 287 |
| 9/29/10 | 286 |
| 9/29/10 | 286 |
| 9/29/10 | 286 |
| 9/29/10 | 287 |
| 9/29/10 | 287 |
| 9/29/10 | 287 |
| 9/29/10 | 286 |
| 9/29/10 | 286 |
| 9/29/10 | 286 |
| 9/29/10 | 286 |
| 9/30/10 | 286 |
| 9/30/10 | 286 |
| 9/30/10 | 286 |
| 9/30/10 | 286 |
| 9/30/10 | 286 |
| 9/30/10 | 286 |
| 9/30/10 | 286 |
| 9/30/10 | 286 |
| 9/30/10 | 286 |
| 9/30/10 | 286 |
| 9/30/10 | 286 |
| 9/30/10 | 286 |
| 9/30/10 | 286 |
| 9/30/10 | 286 |
| 9/30/10 | 286 |
| 9/30/10 | 286 |
| 9/30/10 | 286 |
| 9/30/10 | 286 |
| 9/30/10 | 286 |
| 9/30/10 | 286 |
| 9/30/10 | 286 |
| 9/30/10 | 286 |
| 9/30/10 | 286 |
| 9/30/10 | 286 |
| 9/30/10 | 286 |
| 9/30/10 | 286 |
| 9/30/10 | 286 |
| 9/30/10 | 286 |
| 9/30/10 | 286 |
| 9/30/10 | 286 |
| 9/30/10 | 285 |
| 9/30/10 | 285 |
| 9/30/10 | 285 |
| 9/30/10 | 287 |
| 9/30/10 | 285 |
| 9/30/10 | 286 |
| 9/30/10 | 286 |
| 9/30/10 | 286 |
| 9/30/10 | 287 |
| 9/30/10 | 285 |
| 9/30/10 | 286 |
| 9/30/10 | 286 |
| 9/30/10 | 285 |
| 9/30/10 | 285 |
| 9/30/10 | 285 |
| 9/30/10 | 285 |
| 9/30/10 | 285 |
| 9/30/10 | 285 |
| 10/1/10 | 285 |
| 10/1/10 | 285 |
| 10/1/10 | 285 |
| 10/1/10 | 285 |
| 10/1/10 | 285 |
| 10/1/10 | 285 |
| 10/1/10 | 285 |
| 10/1/10 | 285 |
| 10/1/10 | 285 |
| 10/1/10 | 285 |
| 10/1/10 | 285 |
| 10/1/10 | 285 |
| 10/1/10 | 285 |
| 10/1/10 | 285 |
| 10/1/10 | 285 |
| 10/1/10 | 285 |
| 10/1/10 | 285 |
| 10/1/10 | 285 |
| 10/1/10 | 286 |
| 10/1/10 | 285 |
| 10/1/10 | 285 |
| 10/1/10 | 285 |
| 10/1/10 | 285 |
| 10/1/10 | 285 |
| 10/1/10 | 285 |
| 10/1/10 | 285 |
| 10/1/10 | 285 |
| 10/1/10 | 285 |
| 10/1/10 | 285 |
| 10/1/10 | 285 |
| 10/1/10 | 285 |
| 10/1/10 | 285 |
| 10/1/10 | 286 |
| 10/1/10 | 286 |
| 10/1/10 | 286 |
| 10/1/10 | 285 |
| 10/1/10 | 285 |
| 10/1/10 | 285 |
| 10/1/10 | 285 |
| 10/1/10 | 286 |
| 10/1/10 | 286 |
| 10/1/10 | 286 |
| 10/1/10 | 286 |
| 10/1/10 | 286 |
| 10/1/10 | 286 |
| 10/1/10 | 286 |
| 10/1/10 | 286 |
| 10/1/10 | 286 |
| 10/2/10 | 286 |
| 10/2/10 | 286 |
| 10/2/10 | 286 |
| 10/2/10 | 286 |
| 10/2/10 | 286 |
| 10/2/10 | 286 |
| 10/2/10 | 286 |
| 10/2/10 | 286 |
| 10/2/10 | 286 |
| 10/2/10 | 286 |
| 10/2/10 | 286 |
| 10/2/10 | 286 |
| 10/2/10 | 286 |
| 10/2/10 | 286 |
| 10/2/10 | 286 |
| 10/2/10 | 286 |
| 10/2/10 | 286 |
| 10/2/10 | 286 |
| 10/2/10 | 286 |
| 10/2/10 | 286 |
| 10/2/10 | 286 |
| 10/2/10 | 287 |
| 10/2/10 | 286 |
| 10/2/10 | 286 |
| 10/2/10 | 286 |
| 10/2/10 | 287 |
| 10/2/10 | 286 |
| 10/2/10 | 287 |
| 10/2/10 | 288 |
| 10/2/10 | 288 |
| 10/2/10 | 289 |
| 10/2/10 | 289 |
| 10/2/10 | 288 |
| 10/2/10 | 289 |
| 10/2/10 | 289 |
| 10/2/10 | 288 |
| 10/2/10 | 289 |
| 10/2/10 | 288 |
| 10/2/10 | 289 |
| 10/2/10 | 289 |
| 10/2/10 | 288 |
| 10/2/10 | 289 |
| 10/2/10 | 288 |
| 10/2/10 | 287 |
| 10/2/10 | 287 |
| 10/2/10 | 287 |
| 10/2/10 | 287 |
| 10/2/10 | 287 |
| 10/3/10 | 286 |
| 10/3/10 | 287 |
| 10/3/10 | 287 |
| 10/3/10 | 287 |
| 10/3/10 | 287 |
| 10/3/10 | 286 |
| 10/3/10 | 286 |
| 10/3/10 | 287 |
| 10/3/10 | 287 |
| 10/3/10 | 287 |
| 10/3/10 | 287 |
| 10/3/10 | 287 |
| 10/3/10 | 286 |
| 10/3/10 | 286 |
| 10/3/10 | 286 |
| 10/3/10 | 286 |
| 10/3/10 | 287 |
| 10/3/10 | 287 |
| 10/3/10 | 287 |
| 10/3/10 | 287 |
| 10/3/10 | 287 |
| 10/3/10 | 287 |
| 10/3/10 | 287 |
| 10/3/10 | 287 |
| 10/3/10 | 286 |
| 10/3/10 | 286 |
| 10/3/10 | 286 |
| 10/3/10 | 286 |
| 10/3/10 | 287 |
| 10/3/10 | 286 |
| 10/3/10 | 286 |
| 10/3/10 | 286 |
| 10/3/10 | 286 |
| 10/3/10 | 286 |
| 10/3/10 | 286 |
| 10/3/10 | 286 |
| 10/3/10 | 286 |
| 10/3/10 | 286 |
| 10/3/10 | 286 |
| 10/3/10 | 286 |
| 10/3/10 | 287 |
| 10/3/10 | 286 |
| 10/3/10 | 286 |
| 10/3/10 | 286 |
| 10/3/10 | 286 |
| 10/3/10 | 286 |
| 10/3/10 | 286 |
| 10/3/10 | 286 |
| 10/4/10 | 286 |
| 10/4/10 | 286 |
| 10/4/10 | 286 |
| 10/4/10 | 286 |
| 10/4/10 | 286 |
| 10/4/10 | 286 |
| 10/4/10 | 286 |
| 10/4/10 | 286 |
| 10/4/10 | 286 |
| 10/4/10 | 286 |
| 10/4/10 | 286 |
| 10/4/10 | 286 |
| 10/4/10 | 286 |
| 10/4/10 | 286 |
| 10/4/10 | 286 |
| 10/4/10 | 286 |
| 10/4/10 | 286 |
| 10/4/10 | 287 |
| 10/4/10 | 287 |
| 10/4/10 | 286 |
| 10/4/10 | 287 |
| 10/4/10 | 287 |
| 10/4/10 | 287 |
| 10/4/10 | 287 |
| 10/4/10 | 287 |
| 10/4/10 | 287 |
| 10/4/10 | 286 |
| 10/4/10 | 286 |
| 10/4/10 | 287 |
| 10/4/10 | 287 |
| 10/4/10 | 287 |
| 10/4/10 | 287 |
| 10/4/10 | 287 |
| 10/4/10 | 287 |
| 10/4/10 | 287 |
| 10/4/10 | 287 |
| 10/4/10 | 287 |
| 10/4/10 | 287 |
| 10/4/10 | 287 |
| 10/4/10 | 287 |
| 10/4/10 | 287 |
| 10/4/10 | 287 |
| 10/4/10 | 287 |
| 10/4/10 | 287 |
| 10/4/10 | 287 |
| 10/4/10 | 287 |
| 10/4/10 | 287 |
| 10/4/10 | 287 |
| 10/5/10 | 287 |
| 10/5/10 | 287 |
| 10/5/10 | 287 |
| 10/5/10 | 287 |
| 10/5/10 | 287 |
| 10/5/10 | 287 |
| 10/5/10 | 287 |
| 10/5/10 | 287 |
| 10/5/10 | 287 |
| 10/5/10 | 288 |
| 10/5/10 | 287 |
| 10/5/10 | 287 |
| 10/5/10 | 288 |
| 10/5/10 | 287 |
| 10/5/10 | 287 |
| 10/5/10 | 287 |
| 10/5/10 | 287 |
| 10/5/10 | 288 |
| 10/5/10 | 287 |
| 10/5/10 | 287 |
| 10/5/10 | 287 |
| 10/5/10 | 287 |
| 10/5/10 | 287 |
| 10/5/10 | 287 |
| 10/5/10 | 287 |
| 10/5/10 | 287 |
| 10/5/10 | 287 |
| 10/5/10 | 288 |
| 10/5/10 | 288 |
| 10/5/10 | 287 |
| 10/5/10 | 288 |
| 10/5/10 | 287 |
| 10/5/10 | 287 |
| 10/5/10 | 287 |
| 10/5/10 | 287 |
| 10/5/10 | 287 |
| 10/5/10 | 287 |
| 10/5/10 | 287 |
| 10/5/10 | 287 |
| 10/5/10 | 287 |
| 10/5/10 | 288 |
| 10/5/10 | 287 |
| 10/5/10 | 288 |
| 10/5/10 | 288 |
| 10/5/10 | 288 |
| 10/5/10 | 288 |
| 10/5/10 | 288 |
| 10/5/10 | 288 |
| 10/6/10 | 287 |
| 10/6/10 | 287 |
| 10/6/10 | 288 |
| 10/6/10 | 288 |
| 10/6/10 | 288 |
| 10/6/10 | 288 |
| 10/6/10 | 288 |
| 10/6/10 | 288 |
| 10/6/10 | 287 |
| 10/6/10 | 288 |
| 10/6/10 | 287 |
| 10/6/10 | 288 |
| 10/6/10 | 288 |
| 10/6/10 | 288 |
| 10/6/10 | 287 |
| 10/6/10 | 288 |
| 10/6/10 | 287 |
| 10/6/10 | 288 |
| 10/6/10 | 288 |
| 10/6/10 | 288 |
| 10/6/10 | 287 |
| 10/6/10 | 287 |
| 10/6/10 | 288 |
| 10/6/10 | 288 |
| 10/6/10 | 288 |
| 10/6/10 | 288 |
| 10/6/10 | 288 |
| 10/6/10 | 288 |
| 10/6/10 | 287 |
| 10/6/10 | 287 |
| 10/6/10 | 287 |
| 10/6/10 | 287 |
| 10/6/10 | 287 |
| 10/6/10 | 287 |
| 10/6/10 | 287 |
| 10/6/10 | 287 |
| 10/6/10 | 287 |
| 10/6/10 | 287 |
| 10/6/10 | 287 |
| 10/6/10 | 287 |
| 10/6/10 | 288 |
| 10/6/10 | 287 |
| 10/6/10 | 288 |
| 10/6/10 | 288 |
| 10/6/10 | 288 |
| 10/6/10 | 288 |
| 10/6/10 | 288 |
| 10/6/10 | 288 |
| 10/7/10 | 288 |
| 10/7/10 | 288 |
| 10/7/10 | 288 |
| 10/7/10 | 288 |
| 10/7/10 | 288 |
| 10/7/10 | 288 |
| 10/7/10 | 288 |
| 10/7/10 | 288 |
| 10/7/10 | 288 |
| 10/7/10 | 288 |
| 10/7/10 | 288 |
| 10/7/10 | 288 |
| 10/7/10 | 288 |
| 10/7/10 | 288 |
| 10/7/10 | 288 |
| 10/7/10 | 288 |
| 10/7/10 | 288 |
| 10/7/10 | 288 |
| 10/7/10 | 288 |
| 10/7/10 | 288 |
| 10/7/10 | 287 |
| 10/7/10 | 288 |
| 10/7/10 | 288 |
| 10/7/10 | 288 |
| 10/7/10 | 288 |
| 10/7/10 | 287 |
| 10/7/10 | 287 |
| 10/7/10 | 287 |
| 10/7/10 | 287 |
| 10/7/10 | 287 |
| 10/7/10 | 287 |
| 10/7/10 | 288 |
| 10/7/10 | 288 |
| 10/7/10 | 287 |
| 10/7/10 | 287 |
| 10/7/10 | 288 |
| 10/7/10 | 288 |
| 10/7/10 | 288 |
| 10/7/10 | 288 |
| 10/7/10 | 288 |
| 10/7/10 | 288 |
| 10/7/10 | 288 |
| 10/7/10 | 288 |
| 10/7/10 | 288 |
| 10/7/10 | 288 |
| 10/7/10 | 288 |
| 10/7/10 | 288 |
| 10/7/10 | 288 |
| 10/8/10 | 288 |
| 10/8/10 | 288 |
| 10/8/10 | 288 |
| 10/8/10 | 288 |
| 10/8/10 | 288 |
| 10/8/10 | 288 |
| 10/8/10 | 288 |
| 10/8/10 | 288 |
| 10/8/10 | 289 |
| 10/8/10 | 289 |
| 10/8/10 | 288 |
| 10/8/10 | 288 |
| 10/8/10 | 288 |
| 10/8/10 | 288 |
| 10/8/10 | 288 |
| 10/8/10 | 288 |
| 10/8/10 | 288 |
| 10/8/10 | 288 |
| 10/8/10 | 288 |
| 10/8/10 | 288 |
| 10/8/10 | 288 |
| 10/8/10 | 289 |
| 10/8/10 | 289 |
| 10/8/10 | 289 |
| 10/8/10 | 288 |
| 10/8/10 | 289 |
| 10/8/10 | 289 |
| 10/8/10 | 289 |
| 10/8/10 | 288 |
| 10/8/10 | 288 |
| 10/8/10 | 288 |
| 10/8/10 | 288 |
| 10/8/10 | 288 |
| 10/8/10 | 289 |
| 10/8/10 | 288 |
| 10/8/10 | 291 |
| 10/8/10 | 289 |
| 10/8/10 | 289 |
| 10/8/10 | 289 |
| 10/8/10 | 289 |
| 10/8/10 | 289 |
| 10/8/10 | 289 |
| 10/8/10 | 289 |
| 10/8/10 | 289 |
| 10/8/10 | 288 |
| 10/8/10 | 288 |
| 10/8/10 | 288 |
| 10/8/10 | 288 |
| 10/9/10 | 288 |
| 10/9/10 | 288 |
| 10/9/10 | 288 |
| 10/9/10 | 288 |
| 10/9/10 | 289 |
| 10/9/10 | 289 |
| 10/9/10 | 289 |
| 10/9/10 | 289 |
| 10/9/10 | 289 |
| 10/9/10 | 289 |
| 10/9/10 | 289 |
| 10/9/10 | 289 |
| 10/9/10 | 289 |
| 10/9/10 | 289 |
| 10/9/10 | 289 |
| 10/9/10 | 289 |
| 10/9/10 | 289 |
| 10/9/10 | 289 |
| 10/9/10 | 289 |
| 10/9/10 | 289 |
| 10/9/10 | 289 |
| 10/9/10 | 290 |
| 10/9/10 | 290 |
| 10/9/10 | 290 |
| 10/9/10 | 290 |
| 10/9/10 | 290 |
| 10/9/10 | 290 |
| 10/9/10 | 290 |
| 10/9/10 | 290 |
| 10/9/10 | 290 |
| 10/9/10 | 291 |
| 10/9/10 | 290 |
| 10/9/10 | 289 |
| 10/9/10 | 290 |
| 10/9/10 | 289 |
| 10/9/10 | 289 |
| 10/9/10 | 291 |
| 10/9/10 | 290 |
| 10/9/10 | 289 |
| 10/9/10 | 290 |
| 10/9/10 | 290 |
| 10/9/10 | 290 |
| 10/9/10 | 291 |
| 10/9/10 | 290 |
| 10/9/10 | 289 |
| 10/9/10 | 289 |
| 10/9/10 | 289 |
| 10/9/10 | 289 |
| 10/10/10 | 290 |
| 10/10/10 | 290 |
| 10/10/10 | 290 |
| 10/10/10 | 290 |
| 10/10/10 | 290 |
| 10/10/10 | 290 |
| 10/10/10 | 290 |
| 10/10/10 | 290 |
| 10/10/10 | 290 |
| 10/10/10 | 290 |
| 10/10/10 | 290 |
| 10/10/10 | 289 |
| 10/10/10 | 289 |
| 10/10/10 | 289 |
| 10/10/10 | 289 |
| 10/10/10 | 289 |
| 10/10/10 | 290 |
| 10/10/10 | 289 |
| 10/10/10 | 290 |
| 10/10/10 | 290 |
| 10/10/10 | 290 |
| 10/10/10 | 290 |
| 10/10/10 | 290 |
| 10/10/10 | 290 |
| 10/10/10 | 289 |
| 10/10/10 | 289 |
| 10/10/10 | 289 |
| 10/10/10 | 289 |
| 10/10/10 | 289 |
| 10/10/10 | 290 |
| 10/10/10 | 290 |
| 10/10/10 | 289 |
| 10/10/10 | 289 |
| 10/10/10 | 289 |
| 10/10/10 | 290 |
| 10/10/10 | 290 |
| 10/10/10 | 289 |
| 10/10/10 | 289 |
| 10/10/10 | 290 |
| 10/10/10 | 290 |
| 10/10/10 | 290 |
| 10/10/10 | 290 |
| 10/10/10 | 290 |
| 10/10/10 | 290 |
| 10/10/10 | 290 |
| 10/10/10 | 291 |
| 10/10/10 | 290 |
| 10/10/10 | 290 |
| 10/11/10 | 290 |
| 10/11/10 | 291 |
| 10/11/10 | 290 |
| 10/11/10 | 291 |
| 10/11/10 | 290 |
| 10/11/10 | 290 |
| 10/11/10 | 290 |
| 10/11/10 | 290 |
| 10/11/10 | 290 |
| 10/11/10 | 291 |
| 10/11/10 | 291 |
| 10/11/10 | 291 |
| 10/11/10 | 290 |
| 10/11/10 | 290 |
| 10/11/10 | 290 |
| 10/11/10 | 291 |
| 10/11/10 | 290 |
| 10/11/10 | 291 |
| 10/11/10 | 291 |
| 10/11/10 | 291 |
| 10/11/10 | 291 |
| 10/11/10 | 291 |
| 10/11/10 | 291 |
| 10/11/10 | 291 |
| 10/11/10 | 290 |
| 10/11/10 | 291 |
| 10/11/10 | 291 |
| 10/11/10 | 291 |
| 10/11/10 | 291 |
| 10/11/10 | 291 |
| 10/11/10 | 290 |
| 10/11/10 | 291 |
| 10/11/10 | 290 |
| 10/11/10 | 290 |
| 10/11/10 | 290 |
| 10/11/10 | 290 |
| 10/11/10 | 291 |
| 10/11/10 | 291 |
| 10/11/10 | 291 |
| 10/11/10 | 291 |
| 10/11/10 | 291 |
| 10/11/10 | 291 |
| 10/11/10 | 291 |
| 10/11/10 | 292 |
| 10/11/10 | 291 |
| 10/11/10 | 292 |
| 10/11/10 | 292 |
| 10/11/10 | 291 |
| 10/12/10 | 291 |
| 10/12/10 | 291 |
| 10/12/10 | 291 |
| 10/12/10 | 291 |
| 10/12/10 | 292 |
| 10/12/10 | 291 |
| 10/12/10 | 291 |
| 10/12/10 | 291 |
| 10/12/10 | 291 |
| 10/12/10 | 291 |
| 10/12/10 | 291 |
| 10/12/10 | 291 |
| 10/12/10 | 291 |
| 10/12/10 | 291 |
| 10/12/10 | 291 |
| 10/12/10 | 291 |
| 10/12/10 | 291 |
| 10/12/10 | 291 |
| 10/12/10 | 291 |
| 10/12/10 | 291 |
| 10/12/10 | 291 |
| 10/12/10 | 291 |
| 10/12/10 | 291 |
| 10/12/10 | 291 |
| 10/12/10 | 291 |
| 10/12/10 | 291 |
| 10/12/10 | 291 |
| 10/12/10 | 291 |
| 10/12/10 | 292 |
| 10/12/10 | 292 |
| 10/12/10 | 291 |
| 10/12/10 | 292 |
| 10/12/10 | 291 |
| 10/12/10 | 292 |
| 10/12/10 | 291 |
| 10/12/10 | 291 |
| 10/12/10 | 291 |
| 10/12/10 | 291 |
| 10/12/10 | 291 |
| 10/12/10 | 291 |
| 10/12/10 | 291 |
| 10/12/10 | 291 |
| 10/12/10 | 291 |
| 10/12/10 | 291 |
| 10/12/10 | 292 |
| 10/12/10 | 291 |
| 10/12/10 | 291 |
| 10/12/10 | 291 |
| 10/13/10 | 291 |
| 10/13/10 | 291 |
| 10/13/10 | 291 |
| 10/13/10 | 291 |
| 10/13/10 | 291 |
| 10/13/10 | 291 |
| 10/13/10 | 292 |
| 10/13/10 | 292 |
| 10/13/10 | 292 |
| 10/13/10 | 292 |
| 10/13/10 | 291 |
| 10/13/10 | 292 |
| 10/13/10 | 292 |
| 10/13/10 | 292 |
| 10/13/10 | 292 |
| 10/13/10 | 292 |
| 10/13/10 | 292 |
| 10/13/10 | 292 |
| 10/13/10 | 292 |
| 10/13/10 | 291 |
| 10/13/10 | 292 |
| 10/13/10 | 292 |
| 10/13/10 | 292 |
| 10/13/10 | 292 |
| 10/13/10 | 292 |
| 10/13/10 | 292 |
| 10/13/10 | 292 |
| 10/13/10 | 292 |
| 10/13/10 | 292 |
| 10/13/10 | 292 |
| 10/13/10 | 293 |
| 10/13/10 | 293 |
| 10/13/10 | 293 |
| 10/13/10 | 293 |
| 10/13/10 | 292 |
| 10/13/10 | 293 |
| 10/13/10 | 293 |
| 10/13/10 | 293 |
| 10/13/10 | 293 |
| 10/13/10 | 292 |
| 10/13/10 | 292 |
| 10/13/10 | 292 |
| 10/13/10 | 292 |
| 10/13/10 | 292 |
| 10/13/10 | 292 |
| 10/13/10 | 292 |
| 10/13/10 | 292 |
| 10/13/10 | 292 |
| 10/14/10 | 292 |
| 10/14/10 | 292 |
| 10/14/10 | 292 |
| 10/14/10 | 292 |
| 10/14/10 | 292 |
| 10/14/10 | 292 |
| 10/14/10 | 292 |
| 10/14/10 | 292 |
| 10/14/10 | 292 |
| 10/14/10 | 292 |
| 10/14/10 | 292 |
| 10/14/10 | 292 |
| 10/14/10 | 292 |
| 10/14/10 | 292 |
| 10/14/10 | 293 |
| 10/14/10 | 292 |
| 10/14/10 | 292 |
| 10/14/10 | 292 |
| 10/14/10 | 293 |
| 10/14/10 | 292 |
| 10/14/10 | 292 |
| 10/14/10 | 293 |
| 10/14/10 | 293 |
| 10/14/10 | 293 |
| 10/14/10 | 293 |
| 10/14/10 | 293 |
| 10/14/10 | 293 |
| 10/14/10 | 293 |
| 10/14/10 | 293 |
| 10/14/10 | 292 |
| 10/14/10 | 292 |
| 10/14/10 | 292 |
| 10/14/10 | 292 |
| 10/14/10 | 292 |
| 10/14/10 | 292 |
| 10/14/10 | 292 |
| 10/14/10 | 293 |
| 10/14/10 | 293 |
| 10/14/10 | 293 |
| 10/14/10 | 293 |
| 10/14/10 | 293 |
| 10/14/10 | 294 |
| 10/14/10 | 293 |
| 10/14/10 | 293 |
| 10/14/10 | 293 |
| 10/14/10 | 293 |
| 10/14/10 | 293 |
| 10/14/10 | 293 |
| 10/15/10 | 293 |
| 10/15/10 | 293 |
| 10/15/10 | 293 |
| 10/15/10 | 293 |
| 10/15/10 | 293 |
| 10/15/10 | 293 |
| 10/15/10 | 293 |
| 10/15/10 | 293 |
| 10/15/10 | 293 |
| 10/15/10 | 294 |
| 10/15/10 | 294 |
| 10/15/10 | 294 |
| 10/15/10 | 294 |
| 10/15/10 | 293 |
| 10/15/10 | 293 |
| 10/15/10 | 293 |
| 10/15/10 | 294 |
| 10/15/10 | 294 |
| 10/15/10 | 294 |
| 10/15/10 | 294 |
| 10/15/10 | 294 |
| 10/15/10 | 294 |
| 10/15/10 | 294 |
| 10/15/10 | 294 |
| 10/15/10 | 294 |
| 10/15/10 | 294 |
| 10/15/10 | 294 |
| 10/15/10 | 294 |
| 10/15/10 | 293 |
| 10/15/10 | 294 |
| 10/15/10 | 294 |
| 10/15/10 | 294 |
| 10/15/10 | 293 |
| 10/15/10 | 293 |
| 10/15/10 | 293 |
| 10/15/10 | 293 |
| 10/15/10 | 293 |
| 10/15/10 | 293 |
| 10/15/10 | 293 |
| 10/15/10 | 293 |
| 10/15/10 | 293 |
| 10/15/10 | 293 |
| 10/15/10 | 293 |
| 10/15/10 | 293 |
| 10/15/10 | 293 |
| 10/15/10 | 293 |
| 10/15/10 | 293 |
| 10/15/10 | 293 |
| 10/16/10 | 293 |
| 10/16/10 | 294 |
| 10/16/10 | 294 |
| 10/16/10 | 294 |
| 10/16/10 | 294 |
| 10/16/10 | 294 |
| 10/16/10 | 294 |
| 10/16/10 | 294 |
| 10/16/10 | 294 |
| 10/16/10 | 294 |
| 10/16/10 | 294 |
| 10/16/10 | 294 |
| 10/16/10 | 294 |
| 10/16/10 | 294 |
| 10/16/10 | 294 |
| 10/16/10 | 294 |
| 10/16/10 | 294 |
| 10/16/10 | 294 |
| 10/16/10 | 294 |
| 10/16/10 | 294 |
| 10/16/10 | 294 |
| 10/16/10 | 294 |
| 10/16/10 | 294 |
| 10/16/10 | 294 |
| 10/16/10 | 294 |
| 10/16/10 | 294 |
| 10/16/10 | 294 |
| 10/16/10 | 294 |
| 10/16/10 | 294 |
| 10/16/10 | 295 |
| 10/16/10 | 294 |
| 10/16/10 | 294 |
| 10/16/10 | 295 |
| 10/16/10 | 294 |
| 10/16/10 | 294 |
| 10/16/10 | 294 |
| 10/16/10 | 294 |
| 10/16/10 | 294 |
| 10/16/10 | 294 |
| 10/16/10 | 294 |
| 10/16/10 | 294 |
| 10/16/10 | 294 |
| 10/16/10 | 294 |
| 10/16/10 | 294 |
| 10/16/10 | 294 |
| 10/16/10 | 294 |
| 10/16/10 | 294 |
| 10/16/10 | 294 |
| 10/17/10 | 295 |
| 10/17/10 | 295 |
| 10/17/10 | 295 |
| 10/17/10 | 295 |
| 10/17/10 | 295 |
| 10/17/10 | 295 |
| 10/17/10 | 295 |
| 10/17/10 | 295 |
| 10/17/10 | 295 |
| 10/17/10 | 294 |
| 10/17/10 | 295 |
| 10/17/10 | 293 |
| 10/17/10 | 294 |
| 10/17/10 | 295 |
| 10/17/10 | 295 |
| 10/17/10 | 295 |
| 10/17/10 | 295 |
| 10/17/10 | 295 |
| 10/17/10 | 295 |
| 10/17/10 | 295 |
| 10/17/10 | 295 |
| 10/17/10 | 295 |
| 10/17/10 | 295 |
| 10/17/10 | 295 |
| 10/17/10 | 295 |
| 10/17/10 | 295 |
| 10/17/10 | 295 |
| 10/17/10 | 295 |
| 10/17/10 | 295 |
| 10/17/10 | 295 |
| 10/17/10 | 295 |
| 10/17/10 | 294 |
| 10/17/10 | 294 |
| 10/17/10 | 295 |
| 10/17/10 | 295 |
| 10/17/10 | 295 |
| 10/17/10 | 294 |
| 10/17/10 | 295 |
| 10/17/10 | 295 |
| 10/17/10 | 295 |
| 10/17/10 | 295 |
| 10/17/10 | 295 |
| 10/17/10 | 295 |
| 10/17/10 | 295 |
| 10/17/10 | 295 |
| 10/17/10 | 295 |
| 10/17/10 | 295 |
| 10/17/10 | 295 |
| 10/18/10 | 295 |
| 10/18/10 | 295 |
| 10/18/10 | 295 |
| 10/18/10 | 295 |
| 10/18/10 | 295 |
| 10/18/10 | 295 |
| 10/18/10 | 295 |
| 10/18/10 | 295 |
| 10/18/10 | 295 |
| 10/18/10 | 295 |
| 10/18/10 | 295 |
| 10/18/10 | 295 |
| 10/18/10 | 295 |
| 10/18/10 | 295 |
| 10/18/10 | 295 |
| 10/18/10 | 295 |
| 10/18/10 | 295 |
| 10/18/10 | 295 |
| 10/18/10 | 295 |
| 10/18/10 | 296 |
| 10/18/10 | 296 |
| 10/18/10 | 296 |
| 10/18/10 | 296 |
| 10/18/10 | 296 |
| 10/18/10 | 296 |
| 10/18/10 | 296 |
| 10/18/10 | 296 |
| 10/18/10 | 296 |
| 10/18/10 | 296 |
| 10/18/10 | 296 |
| 10/18/10 | 296 |
| 10/18/10 | 296 |
| 10/18/10 | 296 |
| 10/18/10 | 296 |
| 10/18/10 | 296 |
| 10/18/10 | 296 |
| 10/18/10 | 296 |
| 10/18/10 | 296 |
| 10/18/10 | 296 |
| 10/18/10 | 296 |
| 10/18/10 | 296 |
| 10/18/10 | 296 |
| 10/18/10 | 296 |
| 10/18/10 | 297 |
| 10/18/10 | 296 |
| 10/18/10 | 296 |
| 10/18/10 | 296 |
| 10/18/10 | 296 |
| 10/19/10 | 296 |
| 10/19/10 | 296 |
| 10/19/10 | 296 |
| 10/19/10 | 296 |
| 10/19/10 | 296 |
| 10/19/10 | 297 |
| 10/19/10 | 296 |
| 10/19/10 | 296 |
| 10/19/10 | 297 |
| 10/19/10 | 297 |
| 10/19/10 | 297 |
| 10/19/10 | 296 |
| 10/19/10 | 296 |
| 10/19/10 | 297 |
| 10/19/10 | 297 |
| 10/19/10 | 296 |
| 10/19/10 | 296 |
| 10/19/10 | 296 |
| 10/19/10 | 296 |
| 10/19/10 | 297 |
| 10/19/10 | 297 |
| 10/19/10 | 296 |
| 10/19/10 | 296 |
| 10/19/10 | 296 |
| 10/19/10 | 297 |
| 10/19/10 | 296 |
| 10/19/10 | 297 |
| 10/19/10 | 297 |
| 10/19/10 | 297 |
| 10/19/10 | 297 |
| 10/19/10 | 297 |
| 10/19/10 | 297 |
| 10/19/10 | 296 |
| 10/19/10 | 295 |
| 10/19/10 | 297 |
| 10/19/10 | 296 |
| 10/19/10 | 297 |
| 10/19/10 | 297 |
| 10/19/10 | 297 |
| 10/19/10 | 297 |
| 10/19/10 | 296 |
| 10/19/10 | 297 |
| 10/19/10 | 297 |
| 10/19/10 | 297 |
| 10/19/10 | 297 |
| 10/19/10 | 297 |
| 10/19/10 | 297 |
| 10/19/10 | 297 |
| 10/20/10 | 297 |
| 10/20/10 | 297 |
| 10/20/10 | 297 |
| 10/20/10 | 297 |
| 10/20/10 | 297 |
| 10/20/10 | 297 |
| 10/20/10 | 297 |
| 10/20/10 | 297 |
| 10/20/10 | 297 |
| 10/20/10 | 297 |
| 10/20/10 | 297 |
| 10/20/10 | 297 |
| 10/20/10 | 297 |
| 10/20/10 | 297 |
| 10/20/10 | 297 |
| 10/20/10 | 297 |
| 10/20/10 | 298 |
| 10/20/10 | 298 |
| 10/20/10 | 298 |
| 10/20/10 | 298 |
| 10/20/10 | 298 |
| 10/20/10 | 298 |
| 10/20/10 | 298 |
| 10/20/10 | 298 |
| 10/20/10 | 298 |
| 10/20/10 | 298 |
| 10/20/10 | 298 |
| 10/20/10 | 298 |
| 10/20/10 | 298 |
| 10/20/10 | 298 |
| 10/20/10 | 298 |
| 10/20/10 | 298 |
| 10/20/10 | 298 |
| 10/20/10 | 298 |
| 10/20/10 | 298 |
| 10/20/10 | 298 |
| 10/20/10 | 298 |
| 10/20/10 | 298 |
| 10/20/10 | 299 |
| 10/20/10 | 299 |
| 10/20/10 | 298 |
| 10/20/10 | 299 |
| 10/20/10 | 299 |
| 10/20/10 | 299 |
| 10/20/10 | 299 |
| 10/20/10 | 299 |
| 10/20/10 | 299 |
| 10/20/10 | 299 |
| 10/21/10 | 299 |
| 10/21/10 | 299 |
| 10/21/10 | 299 |
| 10/21/10 | 298 |
| 10/21/10 | 298 |
| 10/21/10 | 298 |
| 10/21/10 | 299 |
| 10/21/10 | 298 |
| 10/21/10 | 298 |
| 10/21/10 | 299 |
| 10/21/10 | 298 |
| 10/21/10 | 298 |
| 10/21/10 | 299 |
| 10/21/10 | 298 |
| 10/21/10 | 298 |
| 10/21/10 | 298 |
| 10/21/10 | 299 |
| 10/21/10 | 298 |
| 10/21/10 | 298 |
| 10/21/10 | 298 |
| 10/21/10 | 298 |
| 10/21/10 | 298 |
| 10/21/10 | 298 |
| 10/21/10 | 298 |
| 10/21/10 | 298 |
| 10/21/10 | 298 |
| 10/21/10 | 298 |
| 10/21/10 | 298 |
| 10/21/10 | 298 |
| 10/21/10 | 298 |
| 10/21/10 | 299 |
| 10/21/10 | 298 |
| 10/21/10 | 298 |
| 10/21/10 | 298 |
| 10/21/10 | 298 |
| 10/21/10 | 298 |
| 10/21/10 | 298 |
| 10/21/10 | 298 |
| 10/21/10 | 298 |
| 10/21/10 | 298 |
| 10/21/10 | 298 |
| 10/21/10 | 298 |
| 10/21/10 | 298 |
| 10/21/10 | 298 |
| 10/21/10 | 298 |
| 10/21/10 | 298 |
| 10/21/10 | 298 |
| 10/21/10 | 298 |
| 10/22/10 | 298 |
| 10/22/10 | 298 |
| 10/22/10 | 298 |
| 10/22/10 | 298 |
| 10/22/10 | 298 |
| 10/22/10 | 298 |
| 10/22/10 | 298 |
| 10/22/10 | 298 |
| 10/22/10 | 294 |
| 10/22/10 | 298 |
| 10/22/10 | 298 |
| 10/22/10 | 298 |
| 10/22/10 | 298 |
| 10/22/10 | 298 |
| 10/22/10 | 298 |
| 10/22/10 | 298 |
| 10/22/10 | 298 |
| 10/22/10 | 298 |
| 10/22/10 | 298 |
| 10/22/10 | 298 |
| 10/22/10 | 298 |
| 10/22/10 | 298 |
| 10/22/10 | 298 |
| 10/22/10 | 298 |
| 10/22/10 | 298 |
| 10/22/10 | 298 |
| 10/22/10 | 298 |
| 10/22/10 | 298 |
| 10/22/10 | 298 |
| 10/22/10 | 298 |
| 10/22/10 | 298 |
| 10/22/10 | 298 |
| 10/22/10 | 298 |
| 10/22/10 | 298 |
| 10/22/10 | 298 |
| 10/22/10 | 298 |
| 10/22/10 | 298 |
| 10/22/10 | 298 |
| 10/22/10 | 298 |
| 10/22/10 | 298 |
| 10/22/10 | 298 |
| 10/22/10 | 298 |
| 10/22/10 | 298 |
| 10/22/10 | 298 |
| 10/22/10 | 298 |
| 10/22/10 | 298 |
| 10/22/10 | 298 |
| 10/22/10 | 298 |
| 10/23/10 | 298 |
| 10/23/10 | 298 |
| 10/23/10 | 298 |
| 10/23/10 | 298 |
| 10/23/10 | 296 |
| 10/23/10 | 297 |
| 10/23/10 | 298 |
| 10/23/10 | 298 |
| 10/23/10 | 298 |
| 10/23/10 | 298 |
| 10/23/10 | 298 |
| 10/23/10 | 298 |
| 10/23/10 | 298 |
| 10/23/10 | 298 |
| 10/23/10 | 298 |
| 10/23/10 | 298 |
| 10/23/10 | 298 |
| 10/23/10 | 298 |
| 10/23/10 | 298 |
| 10/23/10 | 298 |
| 10/23/10 | 299 |
| 10/23/10 | 299 |
| 10/23/10 | 298 |
| 10/23/10 | 298 |
| 10/23/10 | 298 |
| 10/23/10 | 298 |
| 10/23/10 | 298 |
| 10/23/10 | 298 |
| 10/23/10 | 298 |
| 10/23/10 | 298 |
| 10/23/10 | 298 |
| 10/23/10 | 298 |
| 10/23/10 | 298 |
| 10/23/10 | 299 |
| 10/23/10 | 299 |
| 10/23/10 | 299 |
| 10/23/10 | 299 |
| 10/23/10 | 299 |
| 10/23/10 | 298 |
| 10/23/10 | 299 |
| 10/23/10 | 299 |
| 10/23/10 | 299 |
| 10/23/10 | 299 |
| 10/23/10 | 299 |
| 10/23/10 | 299 |
| 10/23/10 | 299 |
| 10/23/10 | 299 |
| 10/23/10 | 299 |
| 10/24/10 | 299 |
| 10/24/10 | 299 |
| 10/24/10 | 299 |
| 10/24/10 | 299 |
| 10/24/10 | 299 |
| 10/24/10 | 299 |
| 10/24/10 | 299 |
| 10/24/10 | 299 |
| 10/24/10 | 299 |
| 10/24/10 | 299 |
| 10/24/10 | 299 |
| 10/24/10 | 299 |
| 10/24/10 | 299 |
| 10/24/10 | 299 |
| 10/24/10 | 299 |
| 10/24/10 | 299 |
| 10/24/10 | 299 |
| 10/24/10 | 299 |
| 10/24/10 | 299 |
| 10/24/10 | 299 |
| 10/24/10 | 299 |
| 10/24/10 | 299 |
| 10/24/10 | 299 |
| 10/24/10 | 299 |
| 10/24/10 | 299 |
| 10/24/10 | 299 |
| 10/24/10 | 299 |
| 10/24/10 | 299 |
| 10/24/10 | 299 |
| 10/24/10 | 299 |
| 10/24/10 | 298 |
| 10/24/10 | 299 |
| 10/24/10 | 299 |
| 10/24/10 | 299 |
| 10/24/10 | 299 |
| 10/24/10 | 299 |
| 10/24/10 | 299 |
| 10/24/10 | 299 |
| 10/24/10 | 299 |
| 10/24/10 | 300 |
| 10/24/10 | 300 |
| 10/24/10 | 300 |
| 10/24/10 | 300 |
| 10/24/10 | 300 |
| 10/24/10 | 300 |
| 10/24/10 | 300 |
| 10/24/10 | 300 |
| 10/24/10 | 300 |
| 10/25/10 | 300 |
| 10/25/10 | 300 |
| 10/25/10 | 299 |
| 10/25/10 | 299 |
| 10/25/10 | 299 |
| 10/25/10 | 299 |
| 10/25/10 | 299 |
| 10/25/10 | 299 |
| 10/25/10 | 299 |
| 10/25/10 | 300 |
| 10/25/10 | 300 |
| 10/25/10 | 300 |
| 10/25/10 | 299 |
| 10/25/10 | 299 |
| 10/25/10 | 300 |
| 10/25/10 | 300 |
| 10/25/10 | 299 |
| 10/25/10 | 300 |
| 10/25/10 | 300 |
| 10/25/10 | 300 |
| 10/25/10 | 300 |
| 10/25/10 | 300 |
| 10/25/10 | 300 |
| 10/25/10 | 300 |
| 10/25/10 | 300 |
| 10/25/10 | 299 |
| 10/25/10 | 299 |
| 10/25/10 | 300 |
| 10/25/10 | 300 |
| 10/25/10 | 300 |
| 10/25/10 | 300 |
| 10/25/10 | 300 |
| 10/25/10 | 300 |
| 10/25/10 | 299 |
| 10/25/10 | 299 |
| 10/25/10 | 299 |
| 10/25/10 | 300 |
| 10/25/10 | 300 |
| 10/25/10 | 300 |
| 10/25/10 | 300 |
| 10/25/10 | 301 |
| 10/25/10 | 301 |
| 10/25/10 | 300 |
| 10/25/10 | 300 |
| 10/25/10 | 300 |
| 10/25/10 | 300 |
| 10/25/10 | 300 |
| 10/25/10 | 301 |
| 10/26/10 | 300 |
| 10/26/10 | 300 |
| 10/26/10 | 300 |
| 10/26/10 | 300 |
| 10/26/10 | 300 |
| 10/26/10 | 300 |
| 10/26/10 | 300 |
| 10/26/10 | 299 |
| 10/26/10 | 298 |
| 10/26/10 | 299 |
| 10/26/10 | 299 |
| 10/26/10 | 299 |
| 10/26/10 | 299 |
| 10/26/10 | 299 |
| 10/26/10 | 298 |
| 10/26/10 | 298 |
| 10/26/10 | 298 |
| 10/26/10 | 298 |
| 10/26/10 | 298 |
| 10/26/10 | 298 |
| 10/26/10 | 298 |
| 10/26/10 | 299 |
| 10/26/10 | 300 |
| 10/26/10 | 299 |
| 10/26/10 | 299 |
| 10/26/10 | 299 |
| 10/26/10 | 300 |
| 10/26/10 | 299 |
| 10/26/10 | 299 |
| 10/26/10 | 299 |
| 10/26/10 | 299 |
| 10/26/10 | 300 |
| 10/26/10 | 300 |
| 10/26/10 | 300 |
| 10/26/10 | 298 |
| 10/26/10 | 298 |
| 10/26/10 | 300 |
| 10/26/10 | 300 |
| 10/26/10 | 300 |
| 10/26/10 | 299 |
| 10/26/10 | 299 |
| 10/26/10 | 299 |
| 10/26/10 | 300 |
| 10/26/10 | 299 |
| 10/26/10 | 299 |
| 10/26/10 | 299 |
| 10/26/10 | 299 |
| 10/26/10 | 299 |
| 10/27/10 | 299 |
| 10/27/10 | 300 |
| 10/27/10 | 300 |
| 10/27/10 | 300 |
| 10/27/10 | 299 |
| 10/27/10 | 300 |
| 10/27/10 | 299 |
| 10/27/10 | 298 |
| 10/27/10 | 298 |
| 10/27/10 | 298 |
| 10/27/10 | 298 |
| 10/27/10 | 297 |
| 10/27/10 | 297 |
| 10/27/10 | 297 |
| 10/27/10 | 298 |
| 10/27/10 | 298 |
| 10/27/10 | 298 |
| 10/27/10 | 298 |
| 10/27/10 | 298 |
| 10/27/10 | 298 |
| 10/27/10 | 297 |
| 10/27/10 | 298 |
| 10/27/10 | 297 |
| 10/27/10 | 297 |
| 10/27/10 | 298 |
| 10/27/10 | 298 |
| 10/27/10 | 298 |
| 10/27/10 | 298 |
| 10/27/10 | 298 |
| 10/27/10 | 299 |
| 10/27/10 | 298 |
| 10/27/10 | 298 |
| 10/27/10 | 298 |
| 10/27/10 | 297 |
| 10/27/10 | 298 |
| 10/27/10 | 297 |
| 10/27/10 | 297 |
| 10/27/10 | 297 |
| 10/27/10 | 297 |
| 10/27/10 | 298 |
| 10/27/10 | 298 |
| 10/27/10 | 298 |
| 10/27/10 | 298 |
| 10/27/10 | 297 |
| 10/27/10 | 297 |
| 10/27/10 | 297 |
| 10/27/10 | 297 |
| 10/27/10 | 297 |
| 10/28/10 | 297 |
| 10/28/10 | 297 |
| 10/28/10 | 298 |
| 10/28/10 | 297 |
| 10/28/10 | 298 |
| 10/28/10 | 297 |
| 10/28/10 | 298 |
| 10/28/10 | 298 |
| 10/28/10 | 298 |
| 10/28/10 | 298 |
| 10/28/10 | 298 |
| 10/28/10 | 298 |
| 10/28/10 | 298 |
| 10/28/10 | 298 |
| 10/28/10 | 298 |
| 10/28/10 | 298 |
| 10/28/10 | 298 |
| 10/28/10 | 298 |
| 10/28/10 | 298 |
| 10/28/10 | 298 |
| 10/28/10 | 298 |
| 10/28/10 | 298 |
| 10/28/10 | 298 |
| 10/28/10 | 298 |
| 10/28/10 | 298 |
| 10/28/10 | 298 |
| 10/28/10 | 298 |
| 10/28/10 | 298 |
| 10/28/10 | 298 |
| 10/28/10 | 298 |
| 10/28/10 | 298 |
| 10/28/10 | 298 |
| 10/28/10 | 298 |
| 10/28/10 | 298 |
| 10/28/10 | 298 |
| 10/28/10 | 299 |
| 10/28/10 | 298 |
| 10/28/10 | 299 |
| 10/28/10 | 299 |
| 10/28/10 | 299 |
| 10/28/10 | 299 |
| 10/28/10 | 299 |
| 10/28/10 | 299 |
| 10/28/10 | 299 |
| 10/28/10 | 298 |
| 10/28/10 | 299 |
| 10/28/10 | 299 |
| 10/28/10 | 299 |
| 10/29/10 | 299 |
| 10/29/10 | 298 |
| 10/29/10 | 299 |
| 10/29/10 | 298 |
| 10/29/10 | 298 |
| 10/29/10 | 298 |
| 10/29/10 | 298 |
| 10/29/10 | 298 |
| 10/29/10 | 298 |
| 10/29/10 | 298 |
| 10/29/10 | 298 |
| 10/29/10 | 298 |
| 10/29/10 | 298 |
| 10/29/10 | 298 |
| 10/29/10 | 298 |
| 10/29/10 | 298 |
| 10/29/10 | 298 |
| 10/29/10 | 297 |
| 10/29/10 | 298 |
| 10/29/10 | 298 |
| 10/29/10 | 299 |
| 10/29/10 | 298 |
| 10/29/10 | 296 |
| 10/29/10 | 297 |
| 10/29/10 | 297 |
| 10/29/10 | 297 |